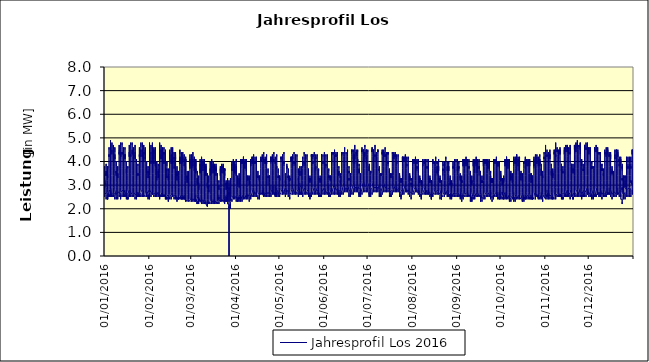
| Category | Jahresprofil Los 2016 |
|---|---|
| 01/01/2016 | 2.9 |
| 01/01/2016 | 2.8 |
| 01/01/2016 | 2.7 |
| 01/01/2016 | 2.5 |
| 01/01/2016 | 2.5 |
| 01/01/2016 | 2.6 |
| 01/01/2016 | 2.7 |
| 01/01/2016 | 2.8 |
| 01/01/2016 | 2.8 |
| 01/01/2016 | 3 |
| 01/01/2016 | 2.9 |
| 01/01/2016 | 3.2 |
| 01/01/2016 | 3.2 |
| 01/01/2016 | 3 |
| 01/01/2016 | 3.1 |
| 01/01/2016 | 3 |
| 01/01/2016 | 3.3 |
| 01/01/2016 | 3.8 |
| 01/01/2016 | 3.7 |
| 01/01/2016 | 3.6 |
| 01/01/2016 | 3.5 |
| 01/01/2016 | 3.3 |
| 01/01/2016 | 3.2 |
| 01/01/2016 | 3.1 |
| 02/01/2016 | 2.7 |
| 02/01/2016 | 2.6 |
| 02/01/2016 | 2.5 |
| 02/01/2016 | 2.5 |
| 02/01/2016 | 2.4 |
| 02/01/2016 | 2.5 |
| 02/01/2016 | 2.6 |
| 02/01/2016 | 2.8 |
| 02/01/2016 | 2.9 |
| 02/01/2016 | 3.3 |
| 02/01/2016 | 3.4 |
| 02/01/2016 | 3.6 |
| 02/01/2016 | 3.4 |
| 02/01/2016 | 3.5 |
| 02/01/2016 | 3.5 |
| 02/01/2016 | 3.4 |
| 02/01/2016 | 3.6 |
| 02/01/2016 | 3.9 |
| 02/01/2016 | 3.9 |
| 02/01/2016 | 3.8 |
| 02/01/2016 | 3.5 |
| 02/01/2016 | 3.2 |
| 02/01/2016 | 3.1 |
| 02/01/2016 | 2.9 |
| 03/01/2016 | 2.7 |
| 03/01/2016 | 2.6 |
| 03/01/2016 | 2.4 |
| 03/01/2016 | 2.5 |
| 03/01/2016 | 2.4 |
| 03/01/2016 | 2.4 |
| 03/01/2016 | 2.5 |
| 03/01/2016 | 2.7 |
| 03/01/2016 | 2.8 |
| 03/01/2016 | 3.1 |
| 03/01/2016 | 3.2 |
| 03/01/2016 | 3.4 |
| 03/01/2016 | 3.4 |
| 03/01/2016 | 3.4 |
| 03/01/2016 | 3.3 |
| 03/01/2016 | 3.5 |
| 03/01/2016 | 3.7 |
| 03/01/2016 | 3.8 |
| 03/01/2016 | 3.7 |
| 03/01/2016 | 3.8 |
| 03/01/2016 | 3.4 |
| 03/01/2016 | 3.3 |
| 03/01/2016 | 3.2 |
| 03/01/2016 | 2.8 |
| 04/01/2016 | 2.8 |
| 04/01/2016 | 2.5 |
| 04/01/2016 | 2.5 |
| 04/01/2016 | 2.6 |
| 04/01/2016 | 2.5 |
| 04/01/2016 | 2.8 |
| 04/01/2016 | 3.3 |
| 04/01/2016 | 3.7 |
| 04/01/2016 | 4 |
| 04/01/2016 | 4.1 |
| 04/01/2016 | 4.2 |
| 04/01/2016 | 4.3 |
| 04/01/2016 | 4.2 |
| 04/01/2016 | 4.3 |
| 04/01/2016 | 4.3 |
| 04/01/2016 | 4.3 |
| 04/01/2016 | 4.6 |
| 04/01/2016 | 4.6 |
| 04/01/2016 | 4.6 |
| 04/01/2016 | 4.5 |
| 04/01/2016 | 4 |
| 04/01/2016 | 3.5 |
| 04/01/2016 | 3.3 |
| 04/01/2016 | 3 |
| 05/01/2016 | 2.8 |
| 05/01/2016 | 2.7 |
| 05/01/2016 | 2.5 |
| 05/01/2016 | 2.5 |
| 05/01/2016 | 2.6 |
| 05/01/2016 | 2.8 |
| 05/01/2016 | 3.3 |
| 05/01/2016 | 3.7 |
| 05/01/2016 | 4 |
| 05/01/2016 | 4.1 |
| 05/01/2016 | 4.2 |
| 05/01/2016 | 4.2 |
| 05/01/2016 | 4.3 |
| 05/01/2016 | 4.2 |
| 05/01/2016 | 4.2 |
| 05/01/2016 | 4.4 |
| 05/01/2016 | 4.8 |
| 05/01/2016 | 4.9 |
| 05/01/2016 | 4.8 |
| 05/01/2016 | 4.5 |
| 05/01/2016 | 4 |
| 05/01/2016 | 3.6 |
| 05/01/2016 | 3.4 |
| 05/01/2016 | 3.1 |
| 06/01/2016 | 2.9 |
| 06/01/2016 | 2.5 |
| 06/01/2016 | 2.6 |
| 06/01/2016 | 2.5 |
| 06/01/2016 | 2.6 |
| 06/01/2016 | 2.9 |
| 06/01/2016 | 3.4 |
| 06/01/2016 | 3.8 |
| 06/01/2016 | 4.1 |
| 06/01/2016 | 4.3 |
| 06/01/2016 | 4.3 |
| 06/01/2016 | 4.4 |
| 06/01/2016 | 4.5 |
| 06/01/2016 | 4.4 |
| 06/01/2016 | 4.3 |
| 06/01/2016 | 4.5 |
| 06/01/2016 | 4.7 |
| 06/01/2016 | 4.8 |
| 06/01/2016 | 4.8 |
| 06/01/2016 | 4.5 |
| 06/01/2016 | 4 |
| 06/01/2016 | 3.6 |
| 06/01/2016 | 3.4 |
| 06/01/2016 | 3.1 |
| 07/01/2016 | 2.7 |
| 07/01/2016 | 2.6 |
| 07/01/2016 | 2.6 |
| 07/01/2016 | 2.5 |
| 07/01/2016 | 2.6 |
| 07/01/2016 | 2.9 |
| 07/01/2016 | 3.4 |
| 07/01/2016 | 3.8 |
| 07/01/2016 | 4.1 |
| 07/01/2016 | 4 |
| 07/01/2016 | 4.3 |
| 07/01/2016 | 4.3 |
| 07/01/2016 | 4.2 |
| 07/01/2016 | 4.2 |
| 07/01/2016 | 4.2 |
| 07/01/2016 | 4.1 |
| 07/01/2016 | 4.5 |
| 07/01/2016 | 4.7 |
| 07/01/2016 | 4.5 |
| 07/01/2016 | 4.4 |
| 07/01/2016 | 3.9 |
| 07/01/2016 | 3.6 |
| 07/01/2016 | 3.4 |
| 07/01/2016 | 2.9 |
| 08/01/2016 | 2.7 |
| 08/01/2016 | 2.6 |
| 08/01/2016 | 2.4 |
| 08/01/2016 | 2.5 |
| 08/01/2016 | 2.6 |
| 08/01/2016 | 2.8 |
| 08/01/2016 | 3.3 |
| 08/01/2016 | 3.7 |
| 08/01/2016 | 4 |
| 08/01/2016 | 4 |
| 08/01/2016 | 4.3 |
| 08/01/2016 | 4.3 |
| 08/01/2016 | 4.3 |
| 08/01/2016 | 4.3 |
| 08/01/2016 | 4.1 |
| 08/01/2016 | 4.2 |
| 08/01/2016 | 4.3 |
| 08/01/2016 | 4.6 |
| 08/01/2016 | 4.6 |
| 08/01/2016 | 4.4 |
| 08/01/2016 | 3.9 |
| 08/01/2016 | 3.5 |
| 08/01/2016 | 3.3 |
| 08/01/2016 | 3 |
| 09/01/2016 | 2.8 |
| 09/01/2016 | 2.5 |
| 09/01/2016 | 2.4 |
| 09/01/2016 | 2.4 |
| 09/01/2016 | 2.5 |
| 09/01/2016 | 2.5 |
| 09/01/2016 | 2.7 |
| 09/01/2016 | 2.8 |
| 09/01/2016 | 3.1 |
| 09/01/2016 | 3.4 |
| 09/01/2016 | 3.6 |
| 09/01/2016 | 3.5 |
| 09/01/2016 | 3.5 |
| 09/01/2016 | 3.6 |
| 09/01/2016 | 3.4 |
| 09/01/2016 | 3.6 |
| 09/01/2016 | 3.8 |
| 09/01/2016 | 4 |
| 09/01/2016 | 4 |
| 09/01/2016 | 3.8 |
| 09/01/2016 | 3.5 |
| 09/01/2016 | 3.3 |
| 09/01/2016 | 3.1 |
| 09/01/2016 | 2.9 |
| 10/01/2016 | 2.6 |
| 10/01/2016 | 2.7 |
| 10/01/2016 | 2.5 |
| 10/01/2016 | 2.4 |
| 10/01/2016 | 2.5 |
| 10/01/2016 | 2.5 |
| 10/01/2016 | 2.6 |
| 10/01/2016 | 2.6 |
| 10/01/2016 | 2.8 |
| 10/01/2016 | 3 |
| 10/01/2016 | 3.3 |
| 10/01/2016 | 3.5 |
| 10/01/2016 | 3.5 |
| 10/01/2016 | 3.5 |
| 10/01/2016 | 3.3 |
| 10/01/2016 | 3.5 |
| 10/01/2016 | 3.7 |
| 10/01/2016 | 3.8 |
| 10/01/2016 | 3.8 |
| 10/01/2016 | 3.6 |
| 10/01/2016 | 3.5 |
| 10/01/2016 | 3.2 |
| 10/01/2016 | 3.2 |
| 10/01/2016 | 2.9 |
| 11/01/2016 | 2.7 |
| 11/01/2016 | 2.7 |
| 11/01/2016 | 2.6 |
| 11/01/2016 | 2.5 |
| 11/01/2016 | 2.6 |
| 11/01/2016 | 2.9 |
| 11/01/2016 | 3.3 |
| 11/01/2016 | 3.9 |
| 11/01/2016 | 4 |
| 11/01/2016 | 4.1 |
| 11/01/2016 | 4.2 |
| 11/01/2016 | 4.2 |
| 11/01/2016 | 4.3 |
| 11/01/2016 | 4.4 |
| 11/01/2016 | 4.3 |
| 11/01/2016 | 4.3 |
| 11/01/2016 | 4.5 |
| 11/01/2016 | 4.6 |
| 11/01/2016 | 4.7 |
| 11/01/2016 | 4.4 |
| 11/01/2016 | 3.9 |
| 11/01/2016 | 3.6 |
| 11/01/2016 | 3.4 |
| 11/01/2016 | 3.1 |
| 12/01/2016 | 2.7 |
| 12/01/2016 | 2.6 |
| 12/01/2016 | 2.4 |
| 12/01/2016 | 2.6 |
| 12/01/2016 | 2.7 |
| 12/01/2016 | 2.9 |
| 12/01/2016 | 3.3 |
| 12/01/2016 | 3.9 |
| 12/01/2016 | 4 |
| 12/01/2016 | 4.1 |
| 12/01/2016 | 4.3 |
| 12/01/2016 | 4.4 |
| 12/01/2016 | 4.2 |
| 12/01/2016 | 4.3 |
| 12/01/2016 | 4.2 |
| 12/01/2016 | 4.3 |
| 12/01/2016 | 4.5 |
| 12/01/2016 | 4.8 |
| 12/01/2016 | 4.7 |
| 12/01/2016 | 4.6 |
| 12/01/2016 | 4.1 |
| 12/01/2016 | 3.7 |
| 12/01/2016 | 3.2 |
| 12/01/2016 | 2.9 |
| 13/01/2016 | 2.8 |
| 13/01/2016 | 2.7 |
| 13/01/2016 | 2.5 |
| 13/01/2016 | 2.6 |
| 13/01/2016 | 2.7 |
| 13/01/2016 | 2.8 |
| 13/01/2016 | 3.4 |
| 13/01/2016 | 3.8 |
| 13/01/2016 | 4.1 |
| 13/01/2016 | 4.3 |
| 13/01/2016 | 4.3 |
| 13/01/2016 | 4.3 |
| 13/01/2016 | 4.4 |
| 13/01/2016 | 4.4 |
| 13/01/2016 | 4.3 |
| 13/01/2016 | 4.4 |
| 13/01/2016 | 4.5 |
| 13/01/2016 | 4.8 |
| 13/01/2016 | 4.7 |
| 13/01/2016 | 4.6 |
| 13/01/2016 | 4.1 |
| 13/01/2016 | 3.7 |
| 13/01/2016 | 3.3 |
| 13/01/2016 | 3 |
| 14/01/2016 | 2.8 |
| 14/01/2016 | 2.7 |
| 14/01/2016 | 2.5 |
| 14/01/2016 | 2.6 |
| 14/01/2016 | 2.7 |
| 14/01/2016 | 2.8 |
| 14/01/2016 | 3.4 |
| 14/01/2016 | 3.8 |
| 14/01/2016 | 4.1 |
| 14/01/2016 | 4.2 |
| 14/01/2016 | 4.2 |
| 14/01/2016 | 4.3 |
| 14/01/2016 | 4.3 |
| 14/01/2016 | 4.3 |
| 14/01/2016 | 4.2 |
| 14/01/2016 | 4.1 |
| 14/01/2016 | 4.3 |
| 14/01/2016 | 4.6 |
| 14/01/2016 | 4.6 |
| 14/01/2016 | 4.5 |
| 14/01/2016 | 4 |
| 14/01/2016 | 3.5 |
| 14/01/2016 | 3.3 |
| 14/01/2016 | 3 |
| 15/01/2016 | 2.8 |
| 15/01/2016 | 2.7 |
| 15/01/2016 | 2.5 |
| 15/01/2016 | 2.6 |
| 15/01/2016 | 2.5 |
| 15/01/2016 | 2.8 |
| 15/01/2016 | 3.3 |
| 15/01/2016 | 3.7 |
| 15/01/2016 | 4.1 |
| 15/01/2016 | 4.3 |
| 15/01/2016 | 4.3 |
| 15/01/2016 | 4.3 |
| 15/01/2016 | 4.2 |
| 15/01/2016 | 4.3 |
| 15/01/2016 | 4.1 |
| 15/01/2016 | 4.2 |
| 15/01/2016 | 4.3 |
| 15/01/2016 | 4.6 |
| 15/01/2016 | 4.5 |
| 15/01/2016 | 4.3 |
| 15/01/2016 | 3.8 |
| 15/01/2016 | 3.6 |
| 15/01/2016 | 3.3 |
| 15/01/2016 | 2.9 |
| 16/01/2016 | 2.7 |
| 16/01/2016 | 2.6 |
| 16/01/2016 | 2.5 |
| 16/01/2016 | 2.5 |
| 16/01/2016 | 2.4 |
| 16/01/2016 | 2.7 |
| 16/01/2016 | 2.8 |
| 16/01/2016 | 3 |
| 16/01/2016 | 3.3 |
| 16/01/2016 | 3.3 |
| 16/01/2016 | 3.5 |
| 16/01/2016 | 3.7 |
| 16/01/2016 | 3.6 |
| 16/01/2016 | 3.5 |
| 16/01/2016 | 3.5 |
| 16/01/2016 | 3.5 |
| 16/01/2016 | 3.6 |
| 16/01/2016 | 3.9 |
| 16/01/2016 | 4 |
| 16/01/2016 | 3.9 |
| 16/01/2016 | 3.6 |
| 16/01/2016 | 3.4 |
| 16/01/2016 | 3.2 |
| 16/01/2016 | 3 |
| 17/01/2016 | 2.7 |
| 17/01/2016 | 2.6 |
| 17/01/2016 | 2.4 |
| 17/01/2016 | 2.5 |
| 17/01/2016 | 2.4 |
| 17/01/2016 | 2.4 |
| 17/01/2016 | 2.5 |
| 17/01/2016 | 2.8 |
| 17/01/2016 | 2.9 |
| 17/01/2016 | 3.2 |
| 17/01/2016 | 3.2 |
| 17/01/2016 | 3.4 |
| 17/01/2016 | 3.4 |
| 17/01/2016 | 3.4 |
| 17/01/2016 | 3.4 |
| 17/01/2016 | 3.4 |
| 17/01/2016 | 3.5 |
| 17/01/2016 | 3.8 |
| 17/01/2016 | 3.8 |
| 17/01/2016 | 3.7 |
| 17/01/2016 | 3.5 |
| 17/01/2016 | 3.3 |
| 17/01/2016 | 3.1 |
| 17/01/2016 | 3 |
| 18/01/2016 | 2.8 |
| 18/01/2016 | 2.6 |
| 18/01/2016 | 2.5 |
| 18/01/2016 | 2.6 |
| 18/01/2016 | 2.5 |
| 18/01/2016 | 2.8 |
| 18/01/2016 | 3.3 |
| 18/01/2016 | 3.9 |
| 18/01/2016 | 4.2 |
| 18/01/2016 | 4.3 |
| 18/01/2016 | 4.3 |
| 18/01/2016 | 4.3 |
| 18/01/2016 | 4.4 |
| 18/01/2016 | 4.2 |
| 18/01/2016 | 4.2 |
| 18/01/2016 | 4.2 |
| 18/01/2016 | 4.5 |
| 18/01/2016 | 4.6 |
| 18/01/2016 | 4.7 |
| 18/01/2016 | 4.5 |
| 18/01/2016 | 4 |
| 18/01/2016 | 3.7 |
| 18/01/2016 | 3.3 |
| 18/01/2016 | 3 |
| 19/01/2016 | 2.8 |
| 19/01/2016 | 2.7 |
| 19/01/2016 | 2.5 |
| 19/01/2016 | 2.5 |
| 19/01/2016 | 2.6 |
| 19/01/2016 | 2.9 |
| 19/01/2016 | 3.5 |
| 19/01/2016 | 3.9 |
| 19/01/2016 | 4.2 |
| 19/01/2016 | 4.3 |
| 19/01/2016 | 4.3 |
| 19/01/2016 | 4.3 |
| 19/01/2016 | 4.3 |
| 19/01/2016 | 4.3 |
| 19/01/2016 | 4.2 |
| 19/01/2016 | 4.3 |
| 19/01/2016 | 4.5 |
| 19/01/2016 | 4.8 |
| 19/01/2016 | 4.7 |
| 19/01/2016 | 4.7 |
| 19/01/2016 | 4.2 |
| 19/01/2016 | 3.6 |
| 19/01/2016 | 3.3 |
| 19/01/2016 | 3 |
| 20/01/2016 | 2.7 |
| 20/01/2016 | 2.6 |
| 20/01/2016 | 2.6 |
| 20/01/2016 | 2.5 |
| 20/01/2016 | 2.6 |
| 20/01/2016 | 2.9 |
| 20/01/2016 | 3.4 |
| 20/01/2016 | 4.1 |
| 20/01/2016 | 4.3 |
| 20/01/2016 | 4.3 |
| 20/01/2016 | 4.5 |
| 20/01/2016 | 4.5 |
| 20/01/2016 | 4.5 |
| 20/01/2016 | 4.3 |
| 20/01/2016 | 4.4 |
| 20/01/2016 | 4.4 |
| 20/01/2016 | 4.4 |
| 20/01/2016 | 4.8 |
| 20/01/2016 | 4.7 |
| 20/01/2016 | 4.5 |
| 20/01/2016 | 4.2 |
| 20/01/2016 | 3.6 |
| 20/01/2016 | 3.4 |
| 20/01/2016 | 3.1 |
| 21/01/2016 | 2.7 |
| 21/01/2016 | 2.6 |
| 21/01/2016 | 2.6 |
| 21/01/2016 | 2.5 |
| 21/01/2016 | 2.6 |
| 21/01/2016 | 2.9 |
| 21/01/2016 | 3.4 |
| 21/01/2016 | 4 |
| 21/01/2016 | 4.1 |
| 21/01/2016 | 4.2 |
| 21/01/2016 | 4.4 |
| 21/01/2016 | 4.4 |
| 21/01/2016 | 4.4 |
| 21/01/2016 | 4.2 |
| 21/01/2016 | 4.1 |
| 21/01/2016 | 4.1 |
| 21/01/2016 | 4.3 |
| 21/01/2016 | 4.6 |
| 21/01/2016 | 4.6 |
| 21/01/2016 | 4.4 |
| 21/01/2016 | 3.9 |
| 21/01/2016 | 3.6 |
| 21/01/2016 | 3.4 |
| 21/01/2016 | 2.9 |
| 22/01/2016 | 2.7 |
| 22/01/2016 | 2.6 |
| 22/01/2016 | 2.4 |
| 22/01/2016 | 2.5 |
| 22/01/2016 | 2.6 |
| 22/01/2016 | 2.9 |
| 22/01/2016 | 3.3 |
| 22/01/2016 | 3.9 |
| 22/01/2016 | 4.1 |
| 22/01/2016 | 4.3 |
| 22/01/2016 | 4.4 |
| 22/01/2016 | 4.4 |
| 22/01/2016 | 4.3 |
| 22/01/2016 | 4.2 |
| 22/01/2016 | 4.2 |
| 22/01/2016 | 4.1 |
| 22/01/2016 | 4.3 |
| 22/01/2016 | 4.6 |
| 22/01/2016 | 4.7 |
| 22/01/2016 | 4.4 |
| 22/01/2016 | 3.9 |
| 22/01/2016 | 3.5 |
| 22/01/2016 | 3.2 |
| 22/01/2016 | 3 |
| 23/01/2016 | 2.6 |
| 23/01/2016 | 2.6 |
| 23/01/2016 | 2.6 |
| 23/01/2016 | 2.4 |
| 23/01/2016 | 2.6 |
| 23/01/2016 | 2.6 |
| 23/01/2016 | 2.8 |
| 23/01/2016 | 2.9 |
| 23/01/2016 | 3.2 |
| 23/01/2016 | 3.5 |
| 23/01/2016 | 3.7 |
| 23/01/2016 | 3.8 |
| 23/01/2016 | 3.7 |
| 23/01/2016 | 3.5 |
| 23/01/2016 | 3.5 |
| 23/01/2016 | 3.5 |
| 23/01/2016 | 3.6 |
| 23/01/2016 | 3.9 |
| 23/01/2016 | 4.1 |
| 23/01/2016 | 4 |
| 23/01/2016 | 3.7 |
| 23/01/2016 | 3.3 |
| 23/01/2016 | 3.1 |
| 23/01/2016 | 2.8 |
| 24/01/2016 | 2.6 |
| 24/01/2016 | 2.7 |
| 24/01/2016 | 2.5 |
| 24/01/2016 | 2.6 |
| 24/01/2016 | 2.5 |
| 24/01/2016 | 2.5 |
| 24/01/2016 | 2.7 |
| 24/01/2016 | 2.7 |
| 24/01/2016 | 3.1 |
| 24/01/2016 | 3.1 |
| 24/01/2016 | 3.4 |
| 24/01/2016 | 3.5 |
| 24/01/2016 | 3.5 |
| 24/01/2016 | 3.4 |
| 24/01/2016 | 3.4 |
| 24/01/2016 | 3.4 |
| 24/01/2016 | 3.5 |
| 24/01/2016 | 3.8 |
| 24/01/2016 | 3.9 |
| 24/01/2016 | 3.8 |
| 24/01/2016 | 3.4 |
| 24/01/2016 | 3.3 |
| 24/01/2016 | 3.2 |
| 24/01/2016 | 2.9 |
| 25/01/2016 | 2.7 |
| 25/01/2016 | 2.5 |
| 25/01/2016 | 2.6 |
| 25/01/2016 | 2.5 |
| 25/01/2016 | 2.6 |
| 25/01/2016 | 2.9 |
| 25/01/2016 | 3.5 |
| 25/01/2016 | 3.9 |
| 25/01/2016 | 4.2 |
| 25/01/2016 | 4.3 |
| 25/01/2016 | 4.3 |
| 25/01/2016 | 4.3 |
| 25/01/2016 | 4.3 |
| 25/01/2016 | 4.3 |
| 25/01/2016 | 4.2 |
| 25/01/2016 | 4.2 |
| 25/01/2016 | 4.3 |
| 25/01/2016 | 4.5 |
| 25/01/2016 | 4.6 |
| 25/01/2016 | 4.6 |
| 25/01/2016 | 4.1 |
| 25/01/2016 | 3.6 |
| 25/01/2016 | 3.3 |
| 25/01/2016 | 3 |
| 26/01/2016 | 2.7 |
| 26/01/2016 | 2.6 |
| 26/01/2016 | 2.5 |
| 26/01/2016 | 2.6 |
| 26/01/2016 | 2.7 |
| 26/01/2016 | 3 |
| 26/01/2016 | 3.5 |
| 26/01/2016 | 3.9 |
| 26/01/2016 | 4.2 |
| 26/01/2016 | 4.3 |
| 26/01/2016 | 4.5 |
| 26/01/2016 | 4.5 |
| 26/01/2016 | 4.4 |
| 26/01/2016 | 4.2 |
| 26/01/2016 | 4.3 |
| 26/01/2016 | 4.3 |
| 26/01/2016 | 4.4 |
| 26/01/2016 | 4.8 |
| 26/01/2016 | 4.8 |
| 26/01/2016 | 4.6 |
| 26/01/2016 | 4.1 |
| 26/01/2016 | 3.7 |
| 26/01/2016 | 3.4 |
| 26/01/2016 | 2.9 |
| 27/01/2016 | 2.8 |
| 27/01/2016 | 2.7 |
| 27/01/2016 | 2.5 |
| 27/01/2016 | 2.6 |
| 27/01/2016 | 2.7 |
| 27/01/2016 | 2.9 |
| 27/01/2016 | 3.6 |
| 27/01/2016 | 4.1 |
| 27/01/2016 | 4.4 |
| 27/01/2016 | 4.5 |
| 27/01/2016 | 4.4 |
| 27/01/2016 | 4.4 |
| 27/01/2016 | 4.4 |
| 27/01/2016 | 4.4 |
| 27/01/2016 | 4.2 |
| 27/01/2016 | 4.4 |
| 27/01/2016 | 4.4 |
| 27/01/2016 | 4.7 |
| 27/01/2016 | 4.8 |
| 27/01/2016 | 4.6 |
| 27/01/2016 | 4.1 |
| 27/01/2016 | 3.7 |
| 27/01/2016 | 3.3 |
| 27/01/2016 | 3 |
| 28/01/2016 | 2.8 |
| 28/01/2016 | 2.7 |
| 28/01/2016 | 2.5 |
| 28/01/2016 | 2.6 |
| 28/01/2016 | 2.7 |
| 28/01/2016 | 2.9 |
| 28/01/2016 | 3.6 |
| 28/01/2016 | 4 |
| 28/01/2016 | 4.3 |
| 28/01/2016 | 4.4 |
| 28/01/2016 | 4.4 |
| 28/01/2016 | 4.3 |
| 28/01/2016 | 4.3 |
| 28/01/2016 | 4.2 |
| 28/01/2016 | 4.1 |
| 28/01/2016 | 4 |
| 28/01/2016 | 4.2 |
| 28/01/2016 | 4.6 |
| 28/01/2016 | 4.7 |
| 28/01/2016 | 4.5 |
| 28/01/2016 | 4 |
| 28/01/2016 | 3.7 |
| 28/01/2016 | 3.2 |
| 28/01/2016 | 3 |
| 29/01/2016 | 2.6 |
| 29/01/2016 | 2.5 |
| 29/01/2016 | 2.5 |
| 29/01/2016 | 2.6 |
| 29/01/2016 | 2.7 |
| 29/01/2016 | 2.8 |
| 29/01/2016 | 3.5 |
| 29/01/2016 | 3.9 |
| 29/01/2016 | 4.3 |
| 29/01/2016 | 4.5 |
| 29/01/2016 | 4.4 |
| 29/01/2016 | 4.3 |
| 29/01/2016 | 4.4 |
| 29/01/2016 | 4.3 |
| 29/01/2016 | 4.2 |
| 29/01/2016 | 4.1 |
| 29/01/2016 | 4.2 |
| 29/01/2016 | 4.5 |
| 29/01/2016 | 4.6 |
| 29/01/2016 | 4.3 |
| 29/01/2016 | 3.8 |
| 29/01/2016 | 3.6 |
| 29/01/2016 | 3.3 |
| 29/01/2016 | 3.1 |
| 30/01/2016 | 2.7 |
| 30/01/2016 | 2.7 |
| 30/01/2016 | 2.5 |
| 30/01/2016 | 2.5 |
| 30/01/2016 | 2.5 |
| 30/01/2016 | 2.7 |
| 30/01/2016 | 2.7 |
| 30/01/2016 | 3.1 |
| 30/01/2016 | 3.4 |
| 30/01/2016 | 3.5 |
| 30/01/2016 | 3.8 |
| 30/01/2016 | 3.7 |
| 30/01/2016 | 3.6 |
| 30/01/2016 | 3.6 |
| 30/01/2016 | 3.5 |
| 30/01/2016 | 3.5 |
| 30/01/2016 | 3.6 |
| 30/01/2016 | 3.9 |
| 30/01/2016 | 4 |
| 30/01/2016 | 3.9 |
| 30/01/2016 | 3.6 |
| 30/01/2016 | 3.3 |
| 30/01/2016 | 3.2 |
| 30/01/2016 | 2.9 |
| 31/01/2016 | 2.8 |
| 31/01/2016 | 2.6 |
| 31/01/2016 | 2.4 |
| 31/01/2016 | 2.5 |
| 31/01/2016 | 2.6 |
| 31/01/2016 | 2.5 |
| 31/01/2016 | 2.6 |
| 31/01/2016 | 2.8 |
| 31/01/2016 | 3 |
| 31/01/2016 | 3.3 |
| 31/01/2016 | 3.5 |
| 31/01/2016 | 3.6 |
| 31/01/2016 | 3.6 |
| 31/01/2016 | 3.5 |
| 31/01/2016 | 3.4 |
| 31/01/2016 | 3.4 |
| 31/01/2016 | 3.3 |
| 31/01/2016 | 3.7 |
| 31/01/2016 | 3.8 |
| 31/01/2016 | 3.7 |
| 31/01/2016 | 3.5 |
| 31/01/2016 | 3.2 |
| 31/01/2016 | 3.1 |
| 31/01/2016 | 3 |
| 01/02/2016 | 2.8 |
| 01/02/2016 | 2.6 |
| 01/02/2016 | 2.4 |
| 01/02/2016 | 2.5 |
| 01/02/2016 | 2.7 |
| 01/02/2016 | 2.9 |
| 01/02/2016 | 3.4 |
| 01/02/2016 | 3.9 |
| 01/02/2016 | 4.3 |
| 01/02/2016 | 4.4 |
| 01/02/2016 | 4.4 |
| 01/02/2016 | 4.4 |
| 01/02/2016 | 4.3 |
| 01/02/2016 | 4 |
| 01/02/2016 | 4.1 |
| 01/02/2016 | 3.9 |
| 01/02/2016 | 4 |
| 01/02/2016 | 4.5 |
| 01/02/2016 | 4.8 |
| 01/02/2016 | 4.3 |
| 01/02/2016 | 3.8 |
| 01/02/2016 | 3.4 |
| 01/02/2016 | 3.3 |
| 01/02/2016 | 2.9 |
| 02/02/2016 | 2.8 |
| 02/02/2016 | 2.7 |
| 02/02/2016 | 2.5 |
| 02/02/2016 | 2.6 |
| 02/02/2016 | 2.7 |
| 02/02/2016 | 3 |
| 02/02/2016 | 3.4 |
| 02/02/2016 | 3.9 |
| 02/02/2016 | 4.3 |
| 02/02/2016 | 4.4 |
| 02/02/2016 | 4.4 |
| 02/02/2016 | 4.4 |
| 02/02/2016 | 4.3 |
| 02/02/2016 | 4.1 |
| 02/02/2016 | 3.9 |
| 02/02/2016 | 4 |
| 02/02/2016 | 4.2 |
| 02/02/2016 | 4.5 |
| 02/02/2016 | 4.7 |
| 02/02/2016 | 4.4 |
| 02/02/2016 | 3.9 |
| 02/02/2016 | 3.5 |
| 02/02/2016 | 3.4 |
| 02/02/2016 | 3 |
| 03/02/2016 | 2.7 |
| 03/02/2016 | 2.6 |
| 03/02/2016 | 2.6 |
| 03/02/2016 | 2.7 |
| 03/02/2016 | 2.6 |
| 03/02/2016 | 2.8 |
| 03/02/2016 | 3.5 |
| 03/02/2016 | 4 |
| 03/02/2016 | 4.2 |
| 03/02/2016 | 4.6 |
| 03/02/2016 | 4.6 |
| 03/02/2016 | 4.5 |
| 03/02/2016 | 4.4 |
| 03/02/2016 | 4.3 |
| 03/02/2016 | 4.1 |
| 03/02/2016 | 4.1 |
| 03/02/2016 | 4.2 |
| 03/02/2016 | 4.5 |
| 03/02/2016 | 4.8 |
| 03/02/2016 | 4.5 |
| 03/02/2016 | 3.9 |
| 03/02/2016 | 3.5 |
| 03/02/2016 | 3.2 |
| 03/02/2016 | 3 |
| 04/02/2016 | 2.7 |
| 04/02/2016 | 2.6 |
| 04/02/2016 | 2.6 |
| 04/02/2016 | 2.5 |
| 04/02/2016 | 2.6 |
| 04/02/2016 | 2.8 |
| 04/02/2016 | 3.5 |
| 04/02/2016 | 4 |
| 04/02/2016 | 4.2 |
| 04/02/2016 | 4.5 |
| 04/02/2016 | 4.5 |
| 04/02/2016 | 4.5 |
| 04/02/2016 | 4.3 |
| 04/02/2016 | 4 |
| 04/02/2016 | 3.9 |
| 04/02/2016 | 4 |
| 04/02/2016 | 4 |
| 04/02/2016 | 4.3 |
| 04/02/2016 | 4.6 |
| 04/02/2016 | 4.1 |
| 04/02/2016 | 3.9 |
| 04/02/2016 | 3.5 |
| 04/02/2016 | 3.2 |
| 04/02/2016 | 3 |
| 05/02/2016 | 2.7 |
| 05/02/2016 | 2.6 |
| 05/02/2016 | 2.6 |
| 05/02/2016 | 2.5 |
| 05/02/2016 | 2.6 |
| 05/02/2016 | 2.8 |
| 05/02/2016 | 3.4 |
| 05/02/2016 | 3.9 |
| 05/02/2016 | 4.2 |
| 05/02/2016 | 4.5 |
| 05/02/2016 | 4.5 |
| 05/02/2016 | 4.5 |
| 05/02/2016 | 4.3 |
| 05/02/2016 | 4 |
| 05/02/2016 | 3.9 |
| 05/02/2016 | 3.8 |
| 05/02/2016 | 4 |
| 05/02/2016 | 4.3 |
| 05/02/2016 | 4.6 |
| 05/02/2016 | 4.1 |
| 05/02/2016 | 3.7 |
| 05/02/2016 | 3.4 |
| 05/02/2016 | 3.3 |
| 05/02/2016 | 2.9 |
| 06/02/2016 | 2.6 |
| 06/02/2016 | 2.6 |
| 06/02/2016 | 2.6 |
| 06/02/2016 | 2.6 |
| 06/02/2016 | 2.5 |
| 06/02/2016 | 2.7 |
| 06/02/2016 | 2.7 |
| 06/02/2016 | 3 |
| 06/02/2016 | 3.3 |
| 06/02/2016 | 3.6 |
| 06/02/2016 | 3.7 |
| 06/02/2016 | 3.8 |
| 06/02/2016 | 3.7 |
| 06/02/2016 | 3.4 |
| 06/02/2016 | 3.2 |
| 06/02/2016 | 3.3 |
| 06/02/2016 | 3.4 |
| 06/02/2016 | 3.7 |
| 06/02/2016 | 4 |
| 06/02/2016 | 3.8 |
| 06/02/2016 | 3.5 |
| 06/02/2016 | 3.2 |
| 06/02/2016 | 3.1 |
| 06/02/2016 | 2.7 |
| 07/02/2016 | 2.6 |
| 07/02/2016 | 2.7 |
| 07/02/2016 | 2.5 |
| 07/02/2016 | 2.5 |
| 07/02/2016 | 2.5 |
| 07/02/2016 | 2.6 |
| 07/02/2016 | 2.7 |
| 07/02/2016 | 3 |
| 07/02/2016 | 3.1 |
| 07/02/2016 | 3.4 |
| 07/02/2016 | 3.4 |
| 07/02/2016 | 3.5 |
| 07/02/2016 | 3.6 |
| 07/02/2016 | 3.5 |
| 07/02/2016 | 3.4 |
| 07/02/2016 | 3.3 |
| 07/02/2016 | 3.3 |
| 07/02/2016 | 3.7 |
| 07/02/2016 | 3.9 |
| 07/02/2016 | 3.8 |
| 07/02/2016 | 3.6 |
| 07/02/2016 | 3.3 |
| 07/02/2016 | 3.2 |
| 07/02/2016 | 2.8 |
| 08/02/2016 | 2.6 |
| 08/02/2016 | 2.6 |
| 08/02/2016 | 2.5 |
| 08/02/2016 | 2.4 |
| 08/02/2016 | 2.6 |
| 08/02/2016 | 3 |
| 08/02/2016 | 3.6 |
| 08/02/2016 | 4 |
| 08/02/2016 | 4.3 |
| 08/02/2016 | 4.4 |
| 08/02/2016 | 4.5 |
| 08/02/2016 | 4.5 |
| 08/02/2016 | 4.4 |
| 08/02/2016 | 4.2 |
| 08/02/2016 | 4.2 |
| 08/02/2016 | 4.3 |
| 08/02/2016 | 4.1 |
| 08/02/2016 | 4.5 |
| 08/02/2016 | 4.8 |
| 08/02/2016 | 4.5 |
| 08/02/2016 | 4 |
| 08/02/2016 | 3.5 |
| 08/02/2016 | 3.2 |
| 08/02/2016 | 3 |
| 09/02/2016 | 2.6 |
| 09/02/2016 | 2.5 |
| 09/02/2016 | 2.6 |
| 09/02/2016 | 2.5 |
| 09/02/2016 | 2.6 |
| 09/02/2016 | 3 |
| 09/02/2016 | 3.5 |
| 09/02/2016 | 4.2 |
| 09/02/2016 | 4.5 |
| 09/02/2016 | 4.4 |
| 09/02/2016 | 4.4 |
| 09/02/2016 | 4.4 |
| 09/02/2016 | 4.3 |
| 09/02/2016 | 4.2 |
| 09/02/2016 | 4.2 |
| 09/02/2016 | 4.1 |
| 09/02/2016 | 4.3 |
| 09/02/2016 | 4.7 |
| 09/02/2016 | 4.7 |
| 09/02/2016 | 4.7 |
| 09/02/2016 | 4.1 |
| 09/02/2016 | 3.6 |
| 09/02/2016 | 3.3 |
| 09/02/2016 | 3 |
| 10/02/2016 | 2.7 |
| 10/02/2016 | 2.5 |
| 10/02/2016 | 2.6 |
| 10/02/2016 | 2.5 |
| 10/02/2016 | 2.6 |
| 10/02/2016 | 3 |
| 10/02/2016 | 3.6 |
| 10/02/2016 | 4 |
| 10/02/2016 | 4.3 |
| 10/02/2016 | 4.5 |
| 10/02/2016 | 4.5 |
| 10/02/2016 | 4.5 |
| 10/02/2016 | 4.4 |
| 10/02/2016 | 4.3 |
| 10/02/2016 | 4.3 |
| 10/02/2016 | 4.1 |
| 10/02/2016 | 4.2 |
| 10/02/2016 | 4.5 |
| 10/02/2016 | 4.6 |
| 10/02/2016 | 4.6 |
| 10/02/2016 | 4.1 |
| 10/02/2016 | 3.5 |
| 10/02/2016 | 3.3 |
| 10/02/2016 | 3 |
| 11/02/2016 | 2.6 |
| 11/02/2016 | 2.5 |
| 11/02/2016 | 2.6 |
| 11/02/2016 | 2.5 |
| 11/02/2016 | 2.6 |
| 11/02/2016 | 2.9 |
| 11/02/2016 | 3.5 |
| 11/02/2016 | 4.1 |
| 11/02/2016 | 4.4 |
| 11/02/2016 | 4.3 |
| 11/02/2016 | 4.4 |
| 11/02/2016 | 4.3 |
| 11/02/2016 | 4.2 |
| 11/02/2016 | 4.1 |
| 11/02/2016 | 4.1 |
| 11/02/2016 | 3.9 |
| 11/02/2016 | 4 |
| 11/02/2016 | 4.3 |
| 11/02/2016 | 4.6 |
| 11/02/2016 | 4.5 |
| 11/02/2016 | 4 |
| 11/02/2016 | 3.5 |
| 11/02/2016 | 3.2 |
| 11/02/2016 | 2.9 |
| 12/02/2016 | 2.6 |
| 12/02/2016 | 2.5 |
| 12/02/2016 | 2.6 |
| 12/02/2016 | 2.4 |
| 12/02/2016 | 2.6 |
| 12/02/2016 | 2.9 |
| 12/02/2016 | 3.4 |
| 12/02/2016 | 3.9 |
| 12/02/2016 | 4.3 |
| 12/02/2016 | 4.5 |
| 12/02/2016 | 4.3 |
| 12/02/2016 | 4.4 |
| 12/02/2016 | 4.3 |
| 12/02/2016 | 4.1 |
| 12/02/2016 | 4 |
| 12/02/2016 | 4 |
| 12/02/2016 | 4 |
| 12/02/2016 | 4.4 |
| 12/02/2016 | 4.4 |
| 12/02/2016 | 4.2 |
| 12/02/2016 | 3.8 |
| 12/02/2016 | 3.5 |
| 12/02/2016 | 3.2 |
| 12/02/2016 | 3 |
| 13/02/2016 | 2.6 |
| 13/02/2016 | 2.4 |
| 13/02/2016 | 2.5 |
| 13/02/2016 | 2.5 |
| 13/02/2016 | 2.4 |
| 13/02/2016 | 2.5 |
| 13/02/2016 | 2.7 |
| 13/02/2016 | 3 |
| 13/02/2016 | 3.3 |
| 13/02/2016 | 3.6 |
| 13/02/2016 | 3.7 |
| 13/02/2016 | 3.7 |
| 13/02/2016 | 3.6 |
| 13/02/2016 | 3.4 |
| 13/02/2016 | 3.3 |
| 13/02/2016 | 3.3 |
| 13/02/2016 | 3.4 |
| 13/02/2016 | 3.7 |
| 13/02/2016 | 4 |
| 13/02/2016 | 3.8 |
| 13/02/2016 | 3.5 |
| 13/02/2016 | 3.2 |
| 13/02/2016 | 3 |
| 13/02/2016 | 2.8 |
| 14/02/2016 | 2.6 |
| 14/02/2016 | 2.5 |
| 14/02/2016 | 2.4 |
| 14/02/2016 | 2.4 |
| 14/02/2016 | 2.3 |
| 14/02/2016 | 2.4 |
| 14/02/2016 | 2.6 |
| 14/02/2016 | 2.7 |
| 14/02/2016 | 2.9 |
| 14/02/2016 | 3.2 |
| 14/02/2016 | 3.3 |
| 14/02/2016 | 3.4 |
| 14/02/2016 | 3.3 |
| 14/02/2016 | 3.2 |
| 14/02/2016 | 3.2 |
| 14/02/2016 | 3.2 |
| 14/02/2016 | 3.2 |
| 14/02/2016 | 3.5 |
| 14/02/2016 | 3.7 |
| 14/02/2016 | 3.6 |
| 14/02/2016 | 3.4 |
| 14/02/2016 | 3.3 |
| 14/02/2016 | 3.1 |
| 14/02/2016 | 2.8 |
| 15/02/2016 | 2.6 |
| 15/02/2016 | 2.4 |
| 15/02/2016 | 2.4 |
| 15/02/2016 | 2.5 |
| 15/02/2016 | 2.6 |
| 15/02/2016 | 2.8 |
| 15/02/2016 | 3.4 |
| 15/02/2016 | 3.9 |
| 15/02/2016 | 4.2 |
| 15/02/2016 | 4.3 |
| 15/02/2016 | 4.4 |
| 15/02/2016 | 4.3 |
| 15/02/2016 | 4.2 |
| 15/02/2016 | 4.2 |
| 15/02/2016 | 4.1 |
| 15/02/2016 | 4.1 |
| 15/02/2016 | 4.1 |
| 15/02/2016 | 4.2 |
| 15/02/2016 | 4.5 |
| 15/02/2016 | 4.3 |
| 15/02/2016 | 4 |
| 15/02/2016 | 3.5 |
| 15/02/2016 | 3.2 |
| 15/02/2016 | 2.9 |
| 16/02/2016 | 2.6 |
| 16/02/2016 | 2.5 |
| 16/02/2016 | 2.4 |
| 16/02/2016 | 2.5 |
| 16/02/2016 | 2.7 |
| 16/02/2016 | 2.8 |
| 16/02/2016 | 3.5 |
| 16/02/2016 | 4 |
| 16/02/2016 | 4.1 |
| 16/02/2016 | 4.2 |
| 16/02/2016 | 4.3 |
| 16/02/2016 | 4.2 |
| 16/02/2016 | 4.1 |
| 16/02/2016 | 4 |
| 16/02/2016 | 4.1 |
| 16/02/2016 | 3.9 |
| 16/02/2016 | 4 |
| 16/02/2016 | 4.4 |
| 16/02/2016 | 4.6 |
| 16/02/2016 | 4.4 |
| 16/02/2016 | 3.9 |
| 16/02/2016 | 3.6 |
| 16/02/2016 | 3.2 |
| 16/02/2016 | 2.7 |
| 17/02/2016 | 2.6 |
| 17/02/2016 | 2.6 |
| 17/02/2016 | 2.5 |
| 17/02/2016 | 2.6 |
| 17/02/2016 | 2.7 |
| 17/02/2016 | 2.8 |
| 17/02/2016 | 3.5 |
| 17/02/2016 | 3.9 |
| 17/02/2016 | 4.2 |
| 17/02/2016 | 4.3 |
| 17/02/2016 | 4.4 |
| 17/02/2016 | 4.3 |
| 17/02/2016 | 4.2 |
| 17/02/2016 | 4.1 |
| 17/02/2016 | 4.2 |
| 17/02/2016 | 3.9 |
| 17/02/2016 | 4 |
| 17/02/2016 | 4.2 |
| 17/02/2016 | 4.6 |
| 17/02/2016 | 4.4 |
| 17/02/2016 | 3.9 |
| 17/02/2016 | 3.5 |
| 17/02/2016 | 3.2 |
| 17/02/2016 | 2.7 |
| 18/02/2016 | 2.6 |
| 18/02/2016 | 2.5 |
| 18/02/2016 | 2.4 |
| 18/02/2016 | 2.5 |
| 18/02/2016 | 2.7 |
| 18/02/2016 | 2.8 |
| 18/02/2016 | 3.5 |
| 18/02/2016 | 4 |
| 18/02/2016 | 4.1 |
| 18/02/2016 | 4.2 |
| 18/02/2016 | 4.2 |
| 18/02/2016 | 4.1 |
| 18/02/2016 | 4 |
| 18/02/2016 | 4 |
| 18/02/2016 | 4 |
| 18/02/2016 | 3.7 |
| 18/02/2016 | 3.8 |
| 18/02/2016 | 4.2 |
| 18/02/2016 | 4.4 |
| 18/02/2016 | 4.2 |
| 18/02/2016 | 3.8 |
| 18/02/2016 | 3.4 |
| 18/02/2016 | 3.2 |
| 18/02/2016 | 2.7 |
| 19/02/2016 | 2.6 |
| 19/02/2016 | 2.5 |
| 19/02/2016 | 2.4 |
| 19/02/2016 | 2.5 |
| 19/02/2016 | 2.6 |
| 19/02/2016 | 2.7 |
| 19/02/2016 | 3.3 |
| 19/02/2016 | 3.8 |
| 19/02/2016 | 4.2 |
| 19/02/2016 | 4.1 |
| 19/02/2016 | 4.2 |
| 19/02/2016 | 4.3 |
| 19/02/2016 | 4.1 |
| 19/02/2016 | 3.9 |
| 19/02/2016 | 3.8 |
| 19/02/2016 | 3.8 |
| 19/02/2016 | 3.8 |
| 19/02/2016 | 4.1 |
| 19/02/2016 | 4.4 |
| 19/02/2016 | 4.2 |
| 19/02/2016 | 3.8 |
| 19/02/2016 | 3.3 |
| 19/02/2016 | 3 |
| 19/02/2016 | 2.7 |
| 20/02/2016 | 2.6 |
| 20/02/2016 | 2.4 |
| 20/02/2016 | 2.3 |
| 20/02/2016 | 2.3 |
| 20/02/2016 | 2.5 |
| 20/02/2016 | 2.6 |
| 20/02/2016 | 2.7 |
| 20/02/2016 | 3 |
| 20/02/2016 | 3.1 |
| 20/02/2016 | 3.3 |
| 20/02/2016 | 3.6 |
| 20/02/2016 | 3.4 |
| 20/02/2016 | 3.5 |
| 20/02/2016 | 3.3 |
| 20/02/2016 | 3.2 |
| 20/02/2016 | 3.2 |
| 20/02/2016 | 3.3 |
| 20/02/2016 | 3.5 |
| 20/02/2016 | 3.8 |
| 20/02/2016 | 3.8 |
| 20/02/2016 | 3.5 |
| 20/02/2016 | 3.2 |
| 20/02/2016 | 3 |
| 20/02/2016 | 2.8 |
| 21/02/2016 | 2.4 |
| 21/02/2016 | 2.5 |
| 21/02/2016 | 2.4 |
| 21/02/2016 | 2.5 |
| 21/02/2016 | 2.4 |
| 21/02/2016 | 2.5 |
| 21/02/2016 | 2.6 |
| 21/02/2016 | 2.7 |
| 21/02/2016 | 2.9 |
| 21/02/2016 | 3.1 |
| 21/02/2016 | 3.3 |
| 21/02/2016 | 3.3 |
| 21/02/2016 | 3.3 |
| 21/02/2016 | 3.1 |
| 21/02/2016 | 3.1 |
| 21/02/2016 | 3.1 |
| 21/02/2016 | 3.1 |
| 21/02/2016 | 3.4 |
| 21/02/2016 | 3.6 |
| 21/02/2016 | 3.6 |
| 21/02/2016 | 3.4 |
| 21/02/2016 | 3.1 |
| 21/02/2016 | 2.9 |
| 21/02/2016 | 2.8 |
| 22/02/2016 | 2.4 |
| 22/02/2016 | 2.5 |
| 22/02/2016 | 2.4 |
| 22/02/2016 | 2.4 |
| 22/02/2016 | 2.5 |
| 22/02/2016 | 2.9 |
| 22/02/2016 | 3.3 |
| 22/02/2016 | 3.8 |
| 22/02/2016 | 4.1 |
| 22/02/2016 | 4.2 |
| 22/02/2016 | 4 |
| 22/02/2016 | 4.1 |
| 22/02/2016 | 4.1 |
| 22/02/2016 | 4.1 |
| 22/02/2016 | 3.9 |
| 22/02/2016 | 3.9 |
| 22/02/2016 | 3.9 |
| 22/02/2016 | 4.2 |
| 22/02/2016 | 4.5 |
| 22/02/2016 | 4.3 |
| 22/02/2016 | 3.8 |
| 22/02/2016 | 3.4 |
| 22/02/2016 | 3.2 |
| 22/02/2016 | 2.7 |
| 23/02/2016 | 2.6 |
| 23/02/2016 | 2.4 |
| 23/02/2016 | 2.5 |
| 23/02/2016 | 2.4 |
| 23/02/2016 | 2.5 |
| 23/02/2016 | 2.9 |
| 23/02/2016 | 3.3 |
| 23/02/2016 | 3.7 |
| 23/02/2016 | 4 |
| 23/02/2016 | 4.1 |
| 23/02/2016 | 4.2 |
| 23/02/2016 | 4 |
| 23/02/2016 | 3.9 |
| 23/02/2016 | 3.9 |
| 23/02/2016 | 3.9 |
| 23/02/2016 | 3.9 |
| 23/02/2016 | 4 |
| 23/02/2016 | 4.1 |
| 23/02/2016 | 4.4 |
| 23/02/2016 | 4.4 |
| 23/02/2016 | 3.9 |
| 23/02/2016 | 3.5 |
| 23/02/2016 | 3 |
| 23/02/2016 | 2.7 |
| 24/02/2016 | 2.6 |
| 24/02/2016 | 2.4 |
| 24/02/2016 | 2.5 |
| 24/02/2016 | 2.4 |
| 24/02/2016 | 2.6 |
| 24/02/2016 | 2.9 |
| 24/02/2016 | 3.3 |
| 24/02/2016 | 3.8 |
| 24/02/2016 | 4.1 |
| 24/02/2016 | 4.2 |
| 24/02/2016 | 4.2 |
| 24/02/2016 | 4.1 |
| 24/02/2016 | 4.1 |
| 24/02/2016 | 4 |
| 24/02/2016 | 4 |
| 24/02/2016 | 4 |
| 24/02/2016 | 4 |
| 24/02/2016 | 4.2 |
| 24/02/2016 | 4.3 |
| 24/02/2016 | 4.4 |
| 24/02/2016 | 3.9 |
| 24/02/2016 | 3.5 |
| 24/02/2016 | 3 |
| 24/02/2016 | 2.7 |
| 25/02/2016 | 2.6 |
| 25/02/2016 | 2.4 |
| 25/02/2016 | 2.5 |
| 25/02/2016 | 2.4 |
| 25/02/2016 | 2.5 |
| 25/02/2016 | 2.8 |
| 25/02/2016 | 3.2 |
| 25/02/2016 | 3.7 |
| 25/02/2016 | 3.9 |
| 25/02/2016 | 4 |
| 25/02/2016 | 4.1 |
| 25/02/2016 | 4 |
| 25/02/2016 | 3.9 |
| 25/02/2016 | 3.8 |
| 25/02/2016 | 3.8 |
| 25/02/2016 | 3.8 |
| 25/02/2016 | 3.8 |
| 25/02/2016 | 3.9 |
| 25/02/2016 | 4.3 |
| 25/02/2016 | 4.2 |
| 25/02/2016 | 3.8 |
| 25/02/2016 | 3.4 |
| 25/02/2016 | 2.9 |
| 25/02/2016 | 2.7 |
| 26/02/2016 | 2.6 |
| 26/02/2016 | 2.3 |
| 26/02/2016 | 2.4 |
| 26/02/2016 | 2.4 |
| 26/02/2016 | 2.5 |
| 26/02/2016 | 2.8 |
| 26/02/2016 | 3.3 |
| 26/02/2016 | 3.7 |
| 26/02/2016 | 4.1 |
| 26/02/2016 | 4 |
| 26/02/2016 | 4.1 |
| 26/02/2016 | 4.1 |
| 26/02/2016 | 4 |
| 26/02/2016 | 3.8 |
| 26/02/2016 | 3.7 |
| 26/02/2016 | 3.6 |
| 26/02/2016 | 3.8 |
| 26/02/2016 | 3.8 |
| 26/02/2016 | 4.2 |
| 26/02/2016 | 4.2 |
| 26/02/2016 | 3.6 |
| 26/02/2016 | 3.2 |
| 26/02/2016 | 3 |
| 26/02/2016 | 2.7 |
| 27/02/2016 | 2.4 |
| 27/02/2016 | 2.3 |
| 27/02/2016 | 2.4 |
| 27/02/2016 | 2.4 |
| 27/02/2016 | 2.4 |
| 27/02/2016 | 2.4 |
| 27/02/2016 | 2.6 |
| 27/02/2016 | 2.7 |
| 27/02/2016 | 3 |
| 27/02/2016 | 3.3 |
| 27/02/2016 | 3.3 |
| 27/02/2016 | 3.3 |
| 27/02/2016 | 3.4 |
| 27/02/2016 | 3.2 |
| 27/02/2016 | 3.1 |
| 27/02/2016 | 3.1 |
| 27/02/2016 | 3.1 |
| 27/02/2016 | 3.4 |
| 27/02/2016 | 3.6 |
| 27/02/2016 | 3.6 |
| 27/02/2016 | 3.3 |
| 27/02/2016 | 3 |
| 27/02/2016 | 2.8 |
| 27/02/2016 | 2.6 |
| 28/02/2016 | 2.4 |
| 28/02/2016 | 2.3 |
| 28/02/2016 | 2.3 |
| 28/02/2016 | 2.3 |
| 28/02/2016 | 2.3 |
| 28/02/2016 | 2.4 |
| 28/02/2016 | 2.4 |
| 28/02/2016 | 2.5 |
| 28/02/2016 | 2.9 |
| 28/02/2016 | 2.9 |
| 28/02/2016 | 3 |
| 28/02/2016 | 3.3 |
| 28/02/2016 | 3.2 |
| 28/02/2016 | 3.1 |
| 28/02/2016 | 3 |
| 28/02/2016 | 3.1 |
| 28/02/2016 | 2.9 |
| 28/02/2016 | 3.2 |
| 28/02/2016 | 3.6 |
| 28/02/2016 | 3.6 |
| 28/02/2016 | 3.2 |
| 28/02/2016 | 3.1 |
| 28/02/2016 | 2.9 |
| 28/02/2016 | 2.6 |
| 29/02/2016 | 2.4 |
| 29/02/2016 | 2.3 |
| 29/02/2016 | 2.3 |
| 29/02/2016 | 2.4 |
| 29/02/2016 | 2.4 |
| 29/02/2016 | 2.7 |
| 29/02/2016 | 3.3 |
| 29/02/2016 | 3.6 |
| 29/02/2016 | 3.9 |
| 29/02/2016 | 4.1 |
| 29/02/2016 | 3.9 |
| 29/02/2016 | 4 |
| 29/02/2016 | 3.9 |
| 29/02/2016 | 3.9 |
| 29/02/2016 | 3.7 |
| 29/02/2016 | 3.7 |
| 29/02/2016 | 3.7 |
| 29/02/2016 | 3.9 |
| 29/02/2016 | 4.2 |
| 29/02/2016 | 4.3 |
| 29/02/2016 | 3.8 |
| 29/02/2016 | 3.2 |
| 29/02/2016 | 2.9 |
| 29/02/2016 | 2.7 |
| 01/03/2016 | 2.4 |
| 01/03/2016 | 2.4 |
| 01/03/2016 | 2.3 |
| 01/03/2016 | 2.5 |
| 01/03/2016 | 2.4 |
| 01/03/2016 | 2.7 |
| 01/03/2016 | 3.2 |
| 01/03/2016 | 3.6 |
| 01/03/2016 | 3.9 |
| 01/03/2016 | 4 |
| 01/03/2016 | 4 |
| 01/03/2016 | 3.9 |
| 01/03/2016 | 3.8 |
| 01/03/2016 | 3.8 |
| 01/03/2016 | 3.8 |
| 01/03/2016 | 3.8 |
| 01/03/2016 | 3.8 |
| 01/03/2016 | 4 |
| 01/03/2016 | 4.3 |
| 01/03/2016 | 4.2 |
| 01/03/2016 | 3.7 |
| 01/03/2016 | 3.3 |
| 01/03/2016 | 2.9 |
| 01/03/2016 | 2.7 |
| 02/03/2016 | 2.4 |
| 02/03/2016 | 2.4 |
| 02/03/2016 | 2.3 |
| 02/03/2016 | 2.3 |
| 02/03/2016 | 2.4 |
| 02/03/2016 | 2.7 |
| 02/03/2016 | 3.3 |
| 02/03/2016 | 3.6 |
| 02/03/2016 | 4 |
| 02/03/2016 | 4.1 |
| 02/03/2016 | 4.1 |
| 02/03/2016 | 4 |
| 02/03/2016 | 3.9 |
| 02/03/2016 | 3.9 |
| 02/03/2016 | 3.8 |
| 02/03/2016 | 3.8 |
| 02/03/2016 | 3.8 |
| 02/03/2016 | 3.9 |
| 02/03/2016 | 4.3 |
| 02/03/2016 | 4.4 |
| 02/03/2016 | 3.7 |
| 02/03/2016 | 3.2 |
| 02/03/2016 | 2.9 |
| 02/03/2016 | 2.7 |
| 03/03/2016 | 2.4 |
| 03/03/2016 | 2.4 |
| 03/03/2016 | 2.3 |
| 03/03/2016 | 2.3 |
| 03/03/2016 | 2.4 |
| 03/03/2016 | 2.7 |
| 03/03/2016 | 3.2 |
| 03/03/2016 | 3.5 |
| 03/03/2016 | 3.8 |
| 03/03/2016 | 3.9 |
| 03/03/2016 | 4 |
| 03/03/2016 | 3.8 |
| 03/03/2016 | 3.7 |
| 03/03/2016 | 3.7 |
| 03/03/2016 | 3.6 |
| 03/03/2016 | 3.6 |
| 03/03/2016 | 3.6 |
| 03/03/2016 | 3.7 |
| 03/03/2016 | 4.1 |
| 03/03/2016 | 4.2 |
| 03/03/2016 | 3.6 |
| 03/03/2016 | 3.1 |
| 03/03/2016 | 2.9 |
| 03/03/2016 | 2.6 |
| 04/03/2016 | 2.4 |
| 04/03/2016 | 2.4 |
| 04/03/2016 | 2.3 |
| 04/03/2016 | 2.4 |
| 04/03/2016 | 2.3 |
| 04/03/2016 | 2.6 |
| 04/03/2016 | 3.1 |
| 04/03/2016 | 3.6 |
| 04/03/2016 | 3.7 |
| 04/03/2016 | 3.9 |
| 04/03/2016 | 3.9 |
| 04/03/2016 | 4 |
| 04/03/2016 | 3.8 |
| 04/03/2016 | 3.7 |
| 04/03/2016 | 3.5 |
| 04/03/2016 | 3.7 |
| 04/03/2016 | 3.6 |
| 04/03/2016 | 3.6 |
| 04/03/2016 | 4.1 |
| 04/03/2016 | 4 |
| 04/03/2016 | 3.6 |
| 04/03/2016 | 3.2 |
| 04/03/2016 | 2.9 |
| 04/03/2016 | 2.7 |
| 05/03/2016 | 2.4 |
| 05/03/2016 | 2.3 |
| 05/03/2016 | 2.2 |
| 05/03/2016 | 2.3 |
| 05/03/2016 | 2.2 |
| 05/03/2016 | 2.3 |
| 05/03/2016 | 2.6 |
| 05/03/2016 | 2.7 |
| 05/03/2016 | 3 |
| 05/03/2016 | 3.2 |
| 05/03/2016 | 3.2 |
| 05/03/2016 | 3.2 |
| 05/03/2016 | 3.3 |
| 05/03/2016 | 3.1 |
| 05/03/2016 | 3 |
| 05/03/2016 | 3 |
| 05/03/2016 | 3 |
| 05/03/2016 | 3.2 |
| 05/03/2016 | 3.6 |
| 05/03/2016 | 3.6 |
| 05/03/2016 | 3.4 |
| 05/03/2016 | 3 |
| 05/03/2016 | 2.8 |
| 05/03/2016 | 2.6 |
| 06/03/2016 | 2.5 |
| 06/03/2016 | 2.4 |
| 06/03/2016 | 2.3 |
| 06/03/2016 | 2.2 |
| 06/03/2016 | 2.4 |
| 06/03/2016 | 2.3 |
| 06/03/2016 | 2.5 |
| 06/03/2016 | 2.5 |
| 06/03/2016 | 2.7 |
| 06/03/2016 | 2.9 |
| 06/03/2016 | 3 |
| 06/03/2016 | 3 |
| 06/03/2016 | 3.1 |
| 06/03/2016 | 3 |
| 06/03/2016 | 2.9 |
| 06/03/2016 | 3 |
| 06/03/2016 | 2.8 |
| 06/03/2016 | 2.9 |
| 06/03/2016 | 3.4 |
| 06/03/2016 | 3.4 |
| 06/03/2016 | 3.3 |
| 06/03/2016 | 2.9 |
| 06/03/2016 | 2.7 |
| 06/03/2016 | 2.6 |
| 07/03/2016 | 2.5 |
| 07/03/2016 | 2.3 |
| 07/03/2016 | 2.3 |
| 07/03/2016 | 2.3 |
| 07/03/2016 | 2.4 |
| 07/03/2016 | 2.6 |
| 07/03/2016 | 3.1 |
| 07/03/2016 | 3.5 |
| 07/03/2016 | 3.8 |
| 07/03/2016 | 3.9 |
| 07/03/2016 | 3.8 |
| 07/03/2016 | 3.8 |
| 07/03/2016 | 3.8 |
| 07/03/2016 | 3.8 |
| 07/03/2016 | 3.6 |
| 07/03/2016 | 3.6 |
| 07/03/2016 | 3.5 |
| 07/03/2016 | 3.7 |
| 07/03/2016 | 4 |
| 07/03/2016 | 4.1 |
| 07/03/2016 | 3.6 |
| 07/03/2016 | 3.2 |
| 07/03/2016 | 2.9 |
| 07/03/2016 | 2.6 |
| 08/03/2016 | 2.4 |
| 08/03/2016 | 2.2 |
| 08/03/2016 | 2.4 |
| 08/03/2016 | 2.3 |
| 08/03/2016 | 2.5 |
| 08/03/2016 | 2.6 |
| 08/03/2016 | 3 |
| 08/03/2016 | 3.5 |
| 08/03/2016 | 3.8 |
| 08/03/2016 | 3.9 |
| 08/03/2016 | 3.9 |
| 08/03/2016 | 3.7 |
| 08/03/2016 | 3.7 |
| 08/03/2016 | 3.6 |
| 08/03/2016 | 3.6 |
| 08/03/2016 | 3.6 |
| 08/03/2016 | 3.6 |
| 08/03/2016 | 3.8 |
| 08/03/2016 | 4.1 |
| 08/03/2016 | 4.2 |
| 08/03/2016 | 3.7 |
| 08/03/2016 | 3.2 |
| 08/03/2016 | 2.9 |
| 08/03/2016 | 2.7 |
| 09/03/2016 | 2.4 |
| 09/03/2016 | 2.3 |
| 09/03/2016 | 2.2 |
| 09/03/2016 | 2.4 |
| 09/03/2016 | 2.5 |
| 09/03/2016 | 2.6 |
| 09/03/2016 | 3 |
| 09/03/2016 | 3.5 |
| 09/03/2016 | 3.8 |
| 09/03/2016 | 3.9 |
| 09/03/2016 | 4 |
| 09/03/2016 | 3.8 |
| 09/03/2016 | 3.8 |
| 09/03/2016 | 3.7 |
| 09/03/2016 | 3.7 |
| 09/03/2016 | 3.6 |
| 09/03/2016 | 3.6 |
| 09/03/2016 | 3.7 |
| 09/03/2016 | 4 |
| 09/03/2016 | 4.1 |
| 09/03/2016 | 3.7 |
| 09/03/2016 | 3.2 |
| 09/03/2016 | 2.9 |
| 09/03/2016 | 2.5 |
| 10/03/2016 | 2.4 |
| 10/03/2016 | 2.2 |
| 10/03/2016 | 2.2 |
| 10/03/2016 | 2.3 |
| 10/03/2016 | 2.4 |
| 10/03/2016 | 2.5 |
| 10/03/2016 | 3.2 |
| 10/03/2016 | 3.4 |
| 10/03/2016 | 3.7 |
| 10/03/2016 | 3.8 |
| 10/03/2016 | 3.8 |
| 10/03/2016 | 3.7 |
| 10/03/2016 | 3.6 |
| 10/03/2016 | 3.6 |
| 10/03/2016 | 3.5 |
| 10/03/2016 | 3.5 |
| 10/03/2016 | 3.4 |
| 10/03/2016 | 3.5 |
| 10/03/2016 | 4.1 |
| 10/03/2016 | 4 |
| 10/03/2016 | 3.6 |
| 10/03/2016 | 3.1 |
| 10/03/2016 | 2.8 |
| 10/03/2016 | 2.4 |
| 11/03/2016 | 2.4 |
| 11/03/2016 | 2.2 |
| 11/03/2016 | 2.3 |
| 11/03/2016 | 2.3 |
| 11/03/2016 | 2.4 |
| 11/03/2016 | 2.7 |
| 11/03/2016 | 3 |
| 11/03/2016 | 3.5 |
| 11/03/2016 | 3.6 |
| 11/03/2016 | 3.8 |
| 11/03/2016 | 3.8 |
| 11/03/2016 | 3.8 |
| 11/03/2016 | 3.7 |
| 11/03/2016 | 3.7 |
| 11/03/2016 | 3.6 |
| 11/03/2016 | 3.5 |
| 11/03/2016 | 3.4 |
| 11/03/2016 | 3.4 |
| 11/03/2016 | 3.9 |
| 11/03/2016 | 3.9 |
| 11/03/2016 | 3.4 |
| 11/03/2016 | 3 |
| 11/03/2016 | 2.7 |
| 11/03/2016 | 2.5 |
| 12/03/2016 | 2.2 |
| 12/03/2016 | 2.1 |
| 12/03/2016 | 2.3 |
| 12/03/2016 | 2.1 |
| 12/03/2016 | 2.3 |
| 12/03/2016 | 2.4 |
| 12/03/2016 | 2.4 |
| 12/03/2016 | 2.7 |
| 12/03/2016 | 2.8 |
| 12/03/2016 | 2.9 |
| 12/03/2016 | 3.1 |
| 12/03/2016 | 3.1 |
| 12/03/2016 | 3 |
| 12/03/2016 | 3 |
| 12/03/2016 | 2.9 |
| 12/03/2016 | 2.9 |
| 12/03/2016 | 2.9 |
| 12/03/2016 | 2.9 |
| 12/03/2016 | 3.5 |
| 12/03/2016 | 3.4 |
| 12/03/2016 | 3.2 |
| 12/03/2016 | 2.8 |
| 12/03/2016 | 2.6 |
| 12/03/2016 | 2.4 |
| 13/03/2016 | 2.3 |
| 13/03/2016 | 2.2 |
| 13/03/2016 | 2.2 |
| 13/03/2016 | 2.3 |
| 13/03/2016 | 2.2 |
| 13/03/2016 | 2.3 |
| 13/03/2016 | 2.3 |
| 13/03/2016 | 2.5 |
| 13/03/2016 | 2.7 |
| 13/03/2016 | 2.8 |
| 13/03/2016 | 2.9 |
| 13/03/2016 | 2.9 |
| 13/03/2016 | 3 |
| 13/03/2016 | 3 |
| 13/03/2016 | 2.9 |
| 13/03/2016 | 2.7 |
| 13/03/2016 | 2.7 |
| 13/03/2016 | 2.8 |
| 13/03/2016 | 3.3 |
| 13/03/2016 | 3.4 |
| 13/03/2016 | 3.1 |
| 13/03/2016 | 2.8 |
| 13/03/2016 | 2.6 |
| 13/03/2016 | 2.4 |
| 14/03/2016 | 2.3 |
| 14/03/2016 | 2.2 |
| 14/03/2016 | 2.2 |
| 14/03/2016 | 2.2 |
| 14/03/2016 | 2.3 |
| 14/03/2016 | 2.6 |
| 14/03/2016 | 3.1 |
| 14/03/2016 | 3.4 |
| 14/03/2016 | 3.5 |
| 14/03/2016 | 3.6 |
| 14/03/2016 | 3.7 |
| 14/03/2016 | 3.7 |
| 14/03/2016 | 3.7 |
| 14/03/2016 | 3.7 |
| 14/03/2016 | 3.5 |
| 14/03/2016 | 3.4 |
| 14/03/2016 | 3.5 |
| 14/03/2016 | 3.5 |
| 14/03/2016 | 4 |
| 14/03/2016 | 4 |
| 14/03/2016 | 3.6 |
| 14/03/2016 | 3.2 |
| 14/03/2016 | 2.6 |
| 14/03/2016 | 2.4 |
| 15/03/2016 | 2.4 |
| 15/03/2016 | 2.3 |
| 15/03/2016 | 2.2 |
| 15/03/2016 | 2.2 |
| 15/03/2016 | 2.3 |
| 15/03/2016 | 2.6 |
| 15/03/2016 | 3 |
| 15/03/2016 | 3.4 |
| 15/03/2016 | 3.7 |
| 15/03/2016 | 3.8 |
| 15/03/2016 | 3.8 |
| 15/03/2016 | 3.6 |
| 15/03/2016 | 3.6 |
| 15/03/2016 | 3.5 |
| 15/03/2016 | 3.5 |
| 15/03/2016 | 3.5 |
| 15/03/2016 | 3.5 |
| 15/03/2016 | 3.7 |
| 15/03/2016 | 4.1 |
| 15/03/2016 | 4.1 |
| 15/03/2016 | 3.7 |
| 15/03/2016 | 3.2 |
| 15/03/2016 | 2.7 |
| 15/03/2016 | 2.5 |
| 16/03/2016 | 2.3 |
| 16/03/2016 | 2.3 |
| 16/03/2016 | 2.3 |
| 16/03/2016 | 2.2 |
| 16/03/2016 | 2.4 |
| 16/03/2016 | 2.7 |
| 16/03/2016 | 3.1 |
| 16/03/2016 | 3.5 |
| 16/03/2016 | 3.8 |
| 16/03/2016 | 3.9 |
| 16/03/2016 | 3.9 |
| 16/03/2016 | 3.7 |
| 16/03/2016 | 3.7 |
| 16/03/2016 | 3.7 |
| 16/03/2016 | 3.6 |
| 16/03/2016 | 3.6 |
| 16/03/2016 | 3.5 |
| 16/03/2016 | 3.7 |
| 16/03/2016 | 4 |
| 16/03/2016 | 4 |
| 16/03/2016 | 3.7 |
| 16/03/2016 | 3.2 |
| 16/03/2016 | 2.7 |
| 16/03/2016 | 2.5 |
| 17/03/2016 | 2.3 |
| 17/03/2016 | 2.3 |
| 17/03/2016 | 2.3 |
| 17/03/2016 | 2.2 |
| 17/03/2016 | 2.4 |
| 17/03/2016 | 2.6 |
| 17/03/2016 | 3 |
| 17/03/2016 | 3.4 |
| 17/03/2016 | 3.7 |
| 17/03/2016 | 3.8 |
| 17/03/2016 | 3.8 |
| 17/03/2016 | 3.6 |
| 17/03/2016 | 3.6 |
| 17/03/2016 | 3.5 |
| 17/03/2016 | 3.5 |
| 17/03/2016 | 3.4 |
| 17/03/2016 | 3.4 |
| 17/03/2016 | 3.6 |
| 17/03/2016 | 3.9 |
| 17/03/2016 | 3.8 |
| 17/03/2016 | 3.6 |
| 17/03/2016 | 3.2 |
| 17/03/2016 | 2.7 |
| 17/03/2016 | 2.5 |
| 18/03/2016 | 2.3 |
| 18/03/2016 | 2.3 |
| 18/03/2016 | 2.2 |
| 18/03/2016 | 2.2 |
| 18/03/2016 | 2.3 |
| 18/03/2016 | 2.6 |
| 18/03/2016 | 3.1 |
| 18/03/2016 | 3.3 |
| 18/03/2016 | 3.6 |
| 18/03/2016 | 3.8 |
| 18/03/2016 | 3.8 |
| 18/03/2016 | 3.6 |
| 18/03/2016 | 3.7 |
| 18/03/2016 | 3.6 |
| 18/03/2016 | 3.4 |
| 18/03/2016 | 3.5 |
| 18/03/2016 | 3.5 |
| 18/03/2016 | 3.6 |
| 18/03/2016 | 3.9 |
| 18/03/2016 | 3.8 |
| 18/03/2016 | 3.4 |
| 18/03/2016 | 3.1 |
| 18/03/2016 | 2.8 |
| 18/03/2016 | 2.5 |
| 19/03/2016 | 2.3 |
| 19/03/2016 | 2.2 |
| 19/03/2016 | 2.2 |
| 19/03/2016 | 2.3 |
| 19/03/2016 | 2.3 |
| 19/03/2016 | 2.3 |
| 19/03/2016 | 2.5 |
| 19/03/2016 | 2.5 |
| 19/03/2016 | 2.8 |
| 19/03/2016 | 3 |
| 19/03/2016 | 3.2 |
| 19/03/2016 | 3.2 |
| 19/03/2016 | 3.1 |
| 19/03/2016 | 3.1 |
| 19/03/2016 | 3 |
| 19/03/2016 | 3 |
| 19/03/2016 | 3 |
| 19/03/2016 | 3 |
| 19/03/2016 | 3.4 |
| 19/03/2016 | 3.5 |
| 19/03/2016 | 3.2 |
| 19/03/2016 | 2.9 |
| 19/03/2016 | 2.7 |
| 19/03/2016 | 2.5 |
| 20/03/2016 | 2.4 |
| 20/03/2016 | 2.4 |
| 20/03/2016 | 2.3 |
| 20/03/2016 | 2.2 |
| 20/03/2016 | 2.2 |
| 20/03/2016 | 2.3 |
| 20/03/2016 | 2.5 |
| 20/03/2016 | 2.4 |
| 20/03/2016 | 2.6 |
| 20/03/2016 | 2.7 |
| 20/03/2016 | 2.8 |
| 20/03/2016 | 3 |
| 20/03/2016 | 2.9 |
| 20/03/2016 | 2.9 |
| 20/03/2016 | 2.8 |
| 20/03/2016 | 2.8 |
| 20/03/2016 | 2.9 |
| 20/03/2016 | 3.1 |
| 20/03/2016 | 3.2 |
| 20/03/2016 | 3.2 |
| 20/03/2016 | 3.1 |
| 20/03/2016 | 2.8 |
| 20/03/2016 | 2.8 |
| 20/03/2016 | 2.5 |
| 21/03/2016 | 2.4 |
| 21/03/2016 | 2.3 |
| 21/03/2016 | 2.3 |
| 21/03/2016 | 2.3 |
| 21/03/2016 | 2.4 |
| 21/03/2016 | 2.6 |
| 21/03/2016 | 2.9 |
| 21/03/2016 | 3.3 |
| 21/03/2016 | 3.5 |
| 21/03/2016 | 3.6 |
| 21/03/2016 | 3.7 |
| 21/03/2016 | 3.6 |
| 21/03/2016 | 3.5 |
| 21/03/2016 | 3.5 |
| 21/03/2016 | 3.4 |
| 21/03/2016 | 3.4 |
| 21/03/2016 | 3.4 |
| 21/03/2016 | 3.7 |
| 21/03/2016 | 3.8 |
| 21/03/2016 | 3.7 |
| 21/03/2016 | 3.4 |
| 21/03/2016 | 3 |
| 21/03/2016 | 2.9 |
| 21/03/2016 | 2.5 |
| 22/03/2016 | 2.3 |
| 22/03/2016 | 2.4 |
| 22/03/2016 | 2.4 |
| 22/03/2016 | 2.3 |
| 22/03/2016 | 2.4 |
| 22/03/2016 | 2.6 |
| 22/03/2016 | 2.9 |
| 22/03/2016 | 3.3 |
| 22/03/2016 | 3.5 |
| 22/03/2016 | 3.7 |
| 22/03/2016 | 3.8 |
| 22/03/2016 | 3.7 |
| 22/03/2016 | 3.6 |
| 22/03/2016 | 3.6 |
| 22/03/2016 | 3.5 |
| 22/03/2016 | 3.5 |
| 22/03/2016 | 3.5 |
| 22/03/2016 | 3.7 |
| 22/03/2016 | 3.9 |
| 22/03/2016 | 3.8 |
| 22/03/2016 | 3.5 |
| 22/03/2016 | 3.1 |
| 22/03/2016 | 2.9 |
| 22/03/2016 | 2.5 |
| 23/03/2016 | 2.4 |
| 23/03/2016 | 2.3 |
| 23/03/2016 | 2.4 |
| 23/03/2016 | 2.4 |
| 23/03/2016 | 2.5 |
| 23/03/2016 | 2.7 |
| 23/03/2016 | 2.9 |
| 23/03/2016 | 3.4 |
| 23/03/2016 | 3.6 |
| 23/03/2016 | 3.8 |
| 23/03/2016 | 3.7 |
| 23/03/2016 | 3.8 |
| 23/03/2016 | 3.8 |
| 23/03/2016 | 3.7 |
| 23/03/2016 | 3.6 |
| 23/03/2016 | 3.5 |
| 23/03/2016 | 3.5 |
| 23/03/2016 | 3.7 |
| 23/03/2016 | 3.9 |
| 23/03/2016 | 3.9 |
| 23/03/2016 | 3.5 |
| 23/03/2016 | 3.1 |
| 23/03/2016 | 2.9 |
| 23/03/2016 | 2.6 |
| 24/03/2016 | 2.4 |
| 24/03/2016 | 2.2 |
| 24/03/2016 | 2.4 |
| 24/03/2016 | 2.3 |
| 24/03/2016 | 2.5 |
| 24/03/2016 | 2.6 |
| 24/03/2016 | 3 |
| 24/03/2016 | 3.3 |
| 24/03/2016 | 3.5 |
| 24/03/2016 | 3.7 |
| 24/03/2016 | 3.6 |
| 24/03/2016 | 3.7 |
| 24/03/2016 | 3.6 |
| 24/03/2016 | 3.6 |
| 24/03/2016 | 3.5 |
| 24/03/2016 | 3.4 |
| 24/03/2016 | 3.4 |
| 24/03/2016 | 3.5 |
| 24/03/2016 | 3.7 |
| 24/03/2016 | 3.7 |
| 24/03/2016 | 3.3 |
| 24/03/2016 | 3.1 |
| 24/03/2016 | 2.9 |
| 24/03/2016 | 2.5 |
| 25/03/2016 | 2.5 |
| 25/03/2016 | 2.5 |
| 25/03/2016 | 2.4 |
| 25/03/2016 | 2.3 |
| 25/03/2016 | 2.3 |
| 25/03/2016 | 2.3 |
| 25/03/2016 | 2.4 |
| 25/03/2016 | 2.3 |
| 25/03/2016 | 2.6 |
| 25/03/2016 | 2.8 |
| 25/03/2016 | 2.9 |
| 25/03/2016 | 3 |
| 25/03/2016 | 3 |
| 25/03/2016 | 3.1 |
| 25/03/2016 | 3 |
| 25/03/2016 | 2.8 |
| 25/03/2016 | 2.8 |
| 25/03/2016 | 3.1 |
| 25/03/2016 | 3.2 |
| 25/03/2016 | 3 |
| 25/03/2016 | 2.9 |
| 25/03/2016 | 2.8 |
| 25/03/2016 | 2.7 |
| 25/03/2016 | 2.4 |
| 26/03/2016 | 2.5 |
| 26/03/2016 | 2.4 |
| 26/03/2016 | 2.3 |
| 26/03/2016 | 2.4 |
| 26/03/2016 | 2.4 |
| 26/03/2016 | 2.4 |
| 26/03/2016 | 2.5 |
| 26/03/2016 | 2.4 |
| 26/03/2016 | 2.8 |
| 26/03/2016 | 3 |
| 26/03/2016 | 3.1 |
| 26/03/2016 | 3.1 |
| 26/03/2016 | 3.2 |
| 26/03/2016 | 3 |
| 26/03/2016 | 2.9 |
| 26/03/2016 | 2.9 |
| 26/03/2016 | 2.9 |
| 26/03/2016 | 3.2 |
| 26/03/2016 | 3.3 |
| 26/03/2016 | 3.3 |
| 26/03/2016 | 3.1 |
| 26/03/2016 | 2.8 |
| 26/03/2016 | 2.7 |
| 26/03/2016 | 2.5 |
| 27/03/2016 | 2.2 |
| 27/03/2016 | 2.2 |
| 27/03/2016 | 0 |
| 27/03/2016 | 2.1 |
| 27/03/2016 | 2 |
| 27/03/2016 | 2.1 |
| 27/03/2016 | 2.3 |
| 27/03/2016 | 2.6 |
| 27/03/2016 | 2.7 |
| 27/03/2016 | 2.9 |
| 27/03/2016 | 2.9 |
| 27/03/2016 | 2.9 |
| 27/03/2016 | 2.8 |
| 27/03/2016 | 2.6 |
| 27/03/2016 | 2.7 |
| 27/03/2016 | 2.5 |
| 27/03/2016 | 2.4 |
| 27/03/2016 | 2.3 |
| 27/03/2016 | 3.1 |
| 27/03/2016 | 3.2 |
| 27/03/2016 | 2.8 |
| 27/03/2016 | 2.6 |
| 27/03/2016 | 2.5 |
| 27/03/2016 | 2.5 |
| 28/03/2016 | 2.1 |
| 28/03/2016 | 2.2 |
| 28/03/2016 | 2.2 |
| 28/03/2016 | 2.1 |
| 28/03/2016 | 2 |
| 28/03/2016 | 2.1 |
| 28/03/2016 | 2.3 |
| 28/03/2016 | 2.6 |
| 28/03/2016 | 2.7 |
| 28/03/2016 | 2.9 |
| 28/03/2016 | 2.9 |
| 28/03/2016 | 2.9 |
| 28/03/2016 | 2.8 |
| 28/03/2016 | 2.6 |
| 28/03/2016 | 2.7 |
| 28/03/2016 | 2.5 |
| 28/03/2016 | 2.6 |
| 28/03/2016 | 2.4 |
| 28/03/2016 | 3.3 |
| 28/03/2016 | 3.2 |
| 28/03/2016 | 3 |
| 28/03/2016 | 2.6 |
| 28/03/2016 | 2.5 |
| 28/03/2016 | 2.5 |
| 29/03/2016 | 2.4 |
| 29/03/2016 | 2.4 |
| 29/03/2016 | 2.4 |
| 29/03/2016 | 2.3 |
| 29/03/2016 | 2.4 |
| 29/03/2016 | 2.6 |
| 29/03/2016 | 3.1 |
| 29/03/2016 | 3.4 |
| 29/03/2016 | 3.8 |
| 29/03/2016 | 3.9 |
| 29/03/2016 | 3.9 |
| 29/03/2016 | 4 |
| 29/03/2016 | 3.9 |
| 29/03/2016 | 3.8 |
| 29/03/2016 | 3.7 |
| 29/03/2016 | 3.6 |
| 29/03/2016 | 3.6 |
| 29/03/2016 | 3.7 |
| 29/03/2016 | 3.9 |
| 29/03/2016 | 3.9 |
| 29/03/2016 | 3.8 |
| 29/03/2016 | 3.2 |
| 29/03/2016 | 2.9 |
| 29/03/2016 | 2.8 |
| 30/03/2016 | 2.5 |
| 30/03/2016 | 2.5 |
| 30/03/2016 | 2.4 |
| 30/03/2016 | 2.4 |
| 30/03/2016 | 2.5 |
| 30/03/2016 | 2.7 |
| 30/03/2016 | 3.1 |
| 30/03/2016 | 3.5 |
| 30/03/2016 | 3.9 |
| 30/03/2016 | 4 |
| 30/03/2016 | 4 |
| 30/03/2016 | 4.1 |
| 30/03/2016 | 4.1 |
| 30/03/2016 | 3.9 |
| 30/03/2016 | 3.8 |
| 30/03/2016 | 3.7 |
| 30/03/2016 | 3.6 |
| 30/03/2016 | 3.6 |
| 30/03/2016 | 4 |
| 30/03/2016 | 3.9 |
| 30/03/2016 | 3.7 |
| 30/03/2016 | 3.2 |
| 30/03/2016 | 2.9 |
| 30/03/2016 | 2.8 |
| 31/03/2016 | 2.5 |
| 31/03/2016 | 2.5 |
| 31/03/2016 | 2.4 |
| 31/03/2016 | 2.4 |
| 31/03/2016 | 2.5 |
| 31/03/2016 | 2.6 |
| 31/03/2016 | 3.1 |
| 31/03/2016 | 3.4 |
| 31/03/2016 | 3.8 |
| 31/03/2016 | 3.9 |
| 31/03/2016 | 3.9 |
| 31/03/2016 | 4 |
| 31/03/2016 | 4 |
| 31/03/2016 | 3.8 |
| 31/03/2016 | 3.6 |
| 31/03/2016 | 3.6 |
| 31/03/2016 | 3.5 |
| 31/03/2016 | 3.5 |
| 31/03/2016 | 3.9 |
| 31/03/2016 | 3.9 |
| 31/03/2016 | 3.6 |
| 31/03/2016 | 3.1 |
| 31/03/2016 | 2.9 |
| 31/03/2016 | 2.8 |
| 01/04/2016 | 2.5 |
| 01/04/2016 | 2.5 |
| 01/04/2016 | 2.4 |
| 01/04/2016 | 2.3 |
| 01/04/2016 | 2.4 |
| 01/04/2016 | 2.8 |
| 01/04/2016 | 3 |
| 01/04/2016 | 3.5 |
| 01/04/2016 | 3.7 |
| 01/04/2016 | 3.9 |
| 01/04/2016 | 4.1 |
| 01/04/2016 | 4 |
| 01/04/2016 | 3.9 |
| 01/04/2016 | 3.8 |
| 01/04/2016 | 3.6 |
| 01/04/2016 | 3.5 |
| 01/04/2016 | 3.6 |
| 01/04/2016 | 3.4 |
| 01/04/2016 | 3.8 |
| 01/04/2016 | 3.7 |
| 01/04/2016 | 3.4 |
| 01/04/2016 | 3.3 |
| 01/04/2016 | 3 |
| 01/04/2016 | 2.6 |
| 02/04/2016 | 2.5 |
| 02/04/2016 | 2.4 |
| 02/04/2016 | 2.3 |
| 02/04/2016 | 2.4 |
| 02/04/2016 | 2.4 |
| 02/04/2016 | 2.3 |
| 02/04/2016 | 2.5 |
| 02/04/2016 | 2.7 |
| 02/04/2016 | 2.9 |
| 02/04/2016 | 3.1 |
| 02/04/2016 | 3.3 |
| 02/04/2016 | 3.3 |
| 02/04/2016 | 3.3 |
| 02/04/2016 | 3.2 |
| 02/04/2016 | 3 |
| 02/04/2016 | 3 |
| 02/04/2016 | 3 |
| 02/04/2016 | 3 |
| 02/04/2016 | 3.4 |
| 02/04/2016 | 3.3 |
| 02/04/2016 | 3.3 |
| 02/04/2016 | 3.1 |
| 02/04/2016 | 2.9 |
| 02/04/2016 | 2.7 |
| 03/04/2016 | 2.6 |
| 03/04/2016 | 2.3 |
| 03/04/2016 | 2.3 |
| 03/04/2016 | 2.4 |
| 03/04/2016 | 2.4 |
| 03/04/2016 | 2.5 |
| 03/04/2016 | 2.4 |
| 03/04/2016 | 2.6 |
| 03/04/2016 | 2.8 |
| 03/04/2016 | 3 |
| 03/04/2016 | 3.1 |
| 03/04/2016 | 3.1 |
| 03/04/2016 | 3.3 |
| 03/04/2016 | 3.2 |
| 03/04/2016 | 3.1 |
| 03/04/2016 | 3.1 |
| 03/04/2016 | 3 |
| 03/04/2016 | 2.9 |
| 03/04/2016 | 3.2 |
| 03/04/2016 | 3.5 |
| 03/04/2016 | 3.3 |
| 03/04/2016 | 3 |
| 03/04/2016 | 2.9 |
| 03/04/2016 | 2.8 |
| 04/04/2016 | 2.6 |
| 04/04/2016 | 2.5 |
| 04/04/2016 | 2.3 |
| 04/04/2016 | 2.5 |
| 04/04/2016 | 2.4 |
| 04/04/2016 | 2.7 |
| 04/04/2016 | 3.3 |
| 04/04/2016 | 3.7 |
| 04/04/2016 | 3.8 |
| 04/04/2016 | 3.9 |
| 04/04/2016 | 4.1 |
| 04/04/2016 | 4 |
| 04/04/2016 | 4 |
| 04/04/2016 | 4 |
| 04/04/2016 | 3.9 |
| 04/04/2016 | 3.9 |
| 04/04/2016 | 3.8 |
| 04/04/2016 | 3.7 |
| 04/04/2016 | 4 |
| 04/04/2016 | 4 |
| 04/04/2016 | 3.8 |
| 04/04/2016 | 3.4 |
| 04/04/2016 | 3.1 |
| 04/04/2016 | 2.9 |
| 05/04/2016 | 2.6 |
| 05/04/2016 | 2.4 |
| 05/04/2016 | 2.3 |
| 05/04/2016 | 2.5 |
| 05/04/2016 | 2.5 |
| 05/04/2016 | 2.7 |
| 05/04/2016 | 3.2 |
| 05/04/2016 | 3.7 |
| 05/04/2016 | 4 |
| 05/04/2016 | 3.9 |
| 05/04/2016 | 4 |
| 05/04/2016 | 4.1 |
| 05/04/2016 | 4.1 |
| 05/04/2016 | 4.1 |
| 05/04/2016 | 4 |
| 05/04/2016 | 4 |
| 05/04/2016 | 4 |
| 05/04/2016 | 3.9 |
| 05/04/2016 | 4.1 |
| 05/04/2016 | 4 |
| 05/04/2016 | 3.9 |
| 05/04/2016 | 3.5 |
| 05/04/2016 | 3.1 |
| 05/04/2016 | 2.8 |
| 06/04/2016 | 2.6 |
| 06/04/2016 | 2.4 |
| 06/04/2016 | 2.4 |
| 06/04/2016 | 2.6 |
| 06/04/2016 | 2.5 |
| 06/04/2016 | 2.8 |
| 06/04/2016 | 3.3 |
| 06/04/2016 | 3.8 |
| 06/04/2016 | 3.9 |
| 06/04/2016 | 4 |
| 06/04/2016 | 4.1 |
| 06/04/2016 | 4.2 |
| 06/04/2016 | 4.2 |
| 06/04/2016 | 4.2 |
| 06/04/2016 | 4.1 |
| 06/04/2016 | 4 |
| 06/04/2016 | 4 |
| 06/04/2016 | 3.9 |
| 06/04/2016 | 4.1 |
| 06/04/2016 | 4.2 |
| 06/04/2016 | 3.9 |
| 06/04/2016 | 3.4 |
| 06/04/2016 | 3.2 |
| 06/04/2016 | 2.8 |
| 07/04/2016 | 2.6 |
| 07/04/2016 | 2.4 |
| 07/04/2016 | 2.4 |
| 07/04/2016 | 2.5 |
| 07/04/2016 | 2.5 |
| 07/04/2016 | 2.7 |
| 07/04/2016 | 3.2 |
| 07/04/2016 | 3.7 |
| 07/04/2016 | 4 |
| 07/04/2016 | 3.9 |
| 07/04/2016 | 4 |
| 07/04/2016 | 4.1 |
| 07/04/2016 | 4.1 |
| 07/04/2016 | 4 |
| 07/04/2016 | 3.9 |
| 07/04/2016 | 3.9 |
| 07/04/2016 | 3.7 |
| 07/04/2016 | 3.8 |
| 07/04/2016 | 3.9 |
| 07/04/2016 | 4 |
| 07/04/2016 | 3.7 |
| 07/04/2016 | 3.4 |
| 07/04/2016 | 3.1 |
| 07/04/2016 | 2.7 |
| 08/04/2016 | 2.6 |
| 08/04/2016 | 2.4 |
| 08/04/2016 | 2.4 |
| 08/04/2016 | 2.5 |
| 08/04/2016 | 2.7 |
| 08/04/2016 | 2.9 |
| 08/04/2016 | 3.1 |
| 08/04/2016 | 3.6 |
| 08/04/2016 | 3.9 |
| 08/04/2016 | 4.1 |
| 08/04/2016 | 4 |
| 08/04/2016 | 4.1 |
| 08/04/2016 | 4 |
| 08/04/2016 | 4.1 |
| 08/04/2016 | 3.9 |
| 08/04/2016 | 3.8 |
| 08/04/2016 | 3.8 |
| 08/04/2016 | 3.6 |
| 08/04/2016 | 3.8 |
| 08/04/2016 | 4 |
| 08/04/2016 | 3.8 |
| 08/04/2016 | 3.3 |
| 08/04/2016 | 3 |
| 08/04/2016 | 2.8 |
| 09/04/2016 | 2.5 |
| 09/04/2016 | 2.6 |
| 09/04/2016 | 2.5 |
| 09/04/2016 | 2.4 |
| 09/04/2016 | 2.4 |
| 09/04/2016 | 2.6 |
| 09/04/2016 | 2.6 |
| 09/04/2016 | 2.9 |
| 09/04/2016 | 2.9 |
| 09/04/2016 | 3.3 |
| 09/04/2016 | 3.4 |
| 09/04/2016 | 3.4 |
| 09/04/2016 | 3.4 |
| 09/04/2016 | 3.4 |
| 09/04/2016 | 3.2 |
| 09/04/2016 | 3.3 |
| 09/04/2016 | 3.3 |
| 09/04/2016 | 3.3 |
| 09/04/2016 | 3.4 |
| 09/04/2016 | 3.4 |
| 09/04/2016 | 3.4 |
| 09/04/2016 | 3.3 |
| 09/04/2016 | 2.9 |
| 09/04/2016 | 2.7 |
| 09/04/2016 | 2.6 |
| 10/04/2016 | 2.5 |
| 10/04/2016 | 2.5 |
| 10/04/2016 | 2.3 |
| 10/04/2016 | 2.3 |
| 10/04/2016 | 2.4 |
| 10/04/2016 | 2.5 |
| 10/04/2016 | 2.5 |
| 10/04/2016 | 2.7 |
| 10/04/2016 | 3.1 |
| 10/04/2016 | 3.2 |
| 10/04/2016 | 3.3 |
| 10/04/2016 | 3.3 |
| 10/04/2016 | 3.4 |
| 10/04/2016 | 3.2 |
| 10/04/2016 | 3.1 |
| 10/04/2016 | 3 |
| 10/04/2016 | 3.2 |
| 10/04/2016 | 3.3 |
| 10/04/2016 | 3.3 |
| 10/04/2016 | 3.3 |
| 10/04/2016 | 3.2 |
| 10/04/2016 | 3 |
| 10/04/2016 | 2.7 |
| 10/04/2016 | 2.6 |
| 11/04/2016 | 2.5 |
| 11/04/2016 | 2.5 |
| 11/04/2016 | 2.4 |
| 11/04/2016 | 2.6 |
| 11/04/2016 | 2.9 |
| 11/04/2016 | 3.2 |
| 11/04/2016 | 3.6 |
| 11/04/2016 | 3.9 |
| 11/04/2016 | 4 |
| 11/04/2016 | 4.1 |
| 11/04/2016 | 4.1 |
| 11/04/2016 | 4.1 |
| 11/04/2016 | 4.1 |
| 11/04/2016 | 4.1 |
| 11/04/2016 | 4.1 |
| 11/04/2016 | 4 |
| 11/04/2016 | 3.8 |
| 11/04/2016 | 3.9 |
| 11/04/2016 | 4.1 |
| 11/04/2016 | 3.8 |
| 11/04/2016 | 3.5 |
| 11/04/2016 | 3.2 |
| 11/04/2016 | 2.8 |
| 11/04/2016 | 2.7 |
| 12/04/2016 | 2.5 |
| 12/04/2016 | 2.5 |
| 12/04/2016 | 2.5 |
| 12/04/2016 | 2.6 |
| 12/04/2016 | 2.9 |
| 12/04/2016 | 3.3 |
| 12/04/2016 | 3.8 |
| 12/04/2016 | 3.9 |
| 12/04/2016 | 4 |
| 12/04/2016 | 4.1 |
| 12/04/2016 | 4.2 |
| 12/04/2016 | 4.2 |
| 12/04/2016 | 4.2 |
| 12/04/2016 | 4.1 |
| 12/04/2016 | 3.9 |
| 12/04/2016 | 4 |
| 12/04/2016 | 4 |
| 12/04/2016 | 4 |
| 12/04/2016 | 4.2 |
| 12/04/2016 | 3.9 |
| 12/04/2016 | 3.6 |
| 12/04/2016 | 3.3 |
| 12/04/2016 | 2.9 |
| 12/04/2016 | 2.8 |
| 13/04/2016 | 2.6 |
| 13/04/2016 | 2.5 |
| 13/04/2016 | 2.5 |
| 13/04/2016 | 2.7 |
| 13/04/2016 | 2.9 |
| 13/04/2016 | 3.4 |
| 13/04/2016 | 3.6 |
| 13/04/2016 | 4 |
| 13/04/2016 | 4.1 |
| 13/04/2016 | 4.2 |
| 13/04/2016 | 4.3 |
| 13/04/2016 | 4.3 |
| 13/04/2016 | 4.3 |
| 13/04/2016 | 4.2 |
| 13/04/2016 | 4 |
| 13/04/2016 | 4 |
| 13/04/2016 | 4 |
| 13/04/2016 | 3.9 |
| 13/04/2016 | 4.1 |
| 13/04/2016 | 4 |
| 13/04/2016 | 3.6 |
| 13/04/2016 | 3.1 |
| 13/04/2016 | 2.9 |
| 13/04/2016 | 2.8 |
| 14/04/2016 | 2.6 |
| 14/04/2016 | 2.5 |
| 14/04/2016 | 2.5 |
| 14/04/2016 | 2.7 |
| 14/04/2016 | 2.9 |
| 14/04/2016 | 3.3 |
| 14/04/2016 | 3.8 |
| 14/04/2016 | 3.9 |
| 14/04/2016 | 4 |
| 14/04/2016 | 4.1 |
| 14/04/2016 | 4.2 |
| 14/04/2016 | 4.2 |
| 14/04/2016 | 4.2 |
| 14/04/2016 | 3.9 |
| 14/04/2016 | 3.9 |
| 14/04/2016 | 3.9 |
| 14/04/2016 | 3.9 |
| 14/04/2016 | 4 |
| 14/04/2016 | 3.9 |
| 14/04/2016 | 3.9 |
| 14/04/2016 | 3.6 |
| 14/04/2016 | 3.3 |
| 14/04/2016 | 2.9 |
| 14/04/2016 | 2.7 |
| 15/04/2016 | 2.6 |
| 15/04/2016 | 2.5 |
| 15/04/2016 | 2.5 |
| 15/04/2016 | 2.6 |
| 15/04/2016 | 2.8 |
| 15/04/2016 | 3.2 |
| 15/04/2016 | 3.6 |
| 15/04/2016 | 3.8 |
| 15/04/2016 | 4 |
| 15/04/2016 | 4.1 |
| 15/04/2016 | 4.1 |
| 15/04/2016 | 4.1 |
| 15/04/2016 | 4.2 |
| 15/04/2016 | 4 |
| 15/04/2016 | 4 |
| 15/04/2016 | 4 |
| 15/04/2016 | 3.9 |
| 15/04/2016 | 3.9 |
| 15/04/2016 | 3.9 |
| 15/04/2016 | 3.7 |
| 15/04/2016 | 3.5 |
| 15/04/2016 | 3.1 |
| 15/04/2016 | 3 |
| 15/04/2016 | 2.6 |
| 16/04/2016 | 2.5 |
| 16/04/2016 | 2.4 |
| 16/04/2016 | 2.5 |
| 16/04/2016 | 2.6 |
| 16/04/2016 | 2.6 |
| 16/04/2016 | 2.7 |
| 16/04/2016 | 2.8 |
| 16/04/2016 | 3.1 |
| 16/04/2016 | 3.2 |
| 16/04/2016 | 3.5 |
| 16/04/2016 | 3.5 |
| 16/04/2016 | 3.5 |
| 16/04/2016 | 3.6 |
| 16/04/2016 | 3.4 |
| 16/04/2016 | 3.4 |
| 16/04/2016 | 3.3 |
| 16/04/2016 | 3.4 |
| 16/04/2016 | 3.4 |
| 16/04/2016 | 3.4 |
| 16/04/2016 | 3.4 |
| 16/04/2016 | 3.3 |
| 16/04/2016 | 3 |
| 16/04/2016 | 2.9 |
| 16/04/2016 | 2.7 |
| 17/04/2016 | 2.6 |
| 17/04/2016 | 2.4 |
| 17/04/2016 | 2.5 |
| 17/04/2016 | 2.5 |
| 17/04/2016 | 2.6 |
| 17/04/2016 | 2.5 |
| 17/04/2016 | 2.7 |
| 17/04/2016 | 2.8 |
| 17/04/2016 | 3 |
| 17/04/2016 | 3.1 |
| 17/04/2016 | 3.4 |
| 17/04/2016 | 3.4 |
| 17/04/2016 | 3.3 |
| 17/04/2016 | 3.2 |
| 17/04/2016 | 3.3 |
| 17/04/2016 | 3.2 |
| 17/04/2016 | 3.3 |
| 17/04/2016 | 3.3 |
| 17/04/2016 | 3.3 |
| 17/04/2016 | 3.3 |
| 17/04/2016 | 3.4 |
| 17/04/2016 | 3.1 |
| 17/04/2016 | 2.9 |
| 17/04/2016 | 2.7 |
| 18/04/2016 | 2.6 |
| 18/04/2016 | 2.6 |
| 18/04/2016 | 2.6 |
| 18/04/2016 | 2.6 |
| 18/04/2016 | 2.8 |
| 18/04/2016 | 3.3 |
| 18/04/2016 | 3.7 |
| 18/04/2016 | 4 |
| 18/04/2016 | 4.1 |
| 18/04/2016 | 4 |
| 18/04/2016 | 4.1 |
| 18/04/2016 | 4.2 |
| 18/04/2016 | 4.2 |
| 18/04/2016 | 4.2 |
| 18/04/2016 | 4 |
| 18/04/2016 | 4 |
| 18/04/2016 | 4.1 |
| 18/04/2016 | 4 |
| 18/04/2016 | 4 |
| 18/04/2016 | 3.9 |
| 18/04/2016 | 3.7 |
| 18/04/2016 | 3.2 |
| 18/04/2016 | 3 |
| 18/04/2016 | 2.6 |
| 19/04/2016 | 2.7 |
| 19/04/2016 | 2.6 |
| 19/04/2016 | 2.6 |
| 19/04/2016 | 2.6 |
| 19/04/2016 | 2.8 |
| 19/04/2016 | 3.4 |
| 19/04/2016 | 3.6 |
| 19/04/2016 | 4 |
| 19/04/2016 | 4.1 |
| 19/04/2016 | 4.2 |
| 19/04/2016 | 4.3 |
| 19/04/2016 | 4.3 |
| 19/04/2016 | 4.1 |
| 19/04/2016 | 4.1 |
| 19/04/2016 | 4.1 |
| 19/04/2016 | 4.2 |
| 19/04/2016 | 4.1 |
| 19/04/2016 | 4.1 |
| 19/04/2016 | 4.1 |
| 19/04/2016 | 4 |
| 19/04/2016 | 3.8 |
| 19/04/2016 | 3.2 |
| 19/04/2016 | 3 |
| 19/04/2016 | 2.7 |
| 20/04/2016 | 2.5 |
| 20/04/2016 | 2.5 |
| 20/04/2016 | 2.7 |
| 20/04/2016 | 2.6 |
| 20/04/2016 | 2.9 |
| 20/04/2016 | 3.5 |
| 20/04/2016 | 3.7 |
| 20/04/2016 | 4.1 |
| 20/04/2016 | 4.2 |
| 20/04/2016 | 4.3 |
| 20/04/2016 | 4.4 |
| 20/04/2016 | 4.3 |
| 20/04/2016 | 4.2 |
| 20/04/2016 | 4.2 |
| 20/04/2016 | 4.2 |
| 20/04/2016 | 4.2 |
| 20/04/2016 | 4.1 |
| 20/04/2016 | 4 |
| 20/04/2016 | 4.1 |
| 20/04/2016 | 4 |
| 20/04/2016 | 3.8 |
| 20/04/2016 | 3.2 |
| 20/04/2016 | 3 |
| 20/04/2016 | 2.7 |
| 21/04/2016 | 2.5 |
| 21/04/2016 | 2.5 |
| 21/04/2016 | 2.6 |
| 21/04/2016 | 2.6 |
| 21/04/2016 | 2.8 |
| 21/04/2016 | 3.4 |
| 21/04/2016 | 3.7 |
| 21/04/2016 | 4 |
| 21/04/2016 | 4.1 |
| 21/04/2016 | 4.2 |
| 21/04/2016 | 4.1 |
| 21/04/2016 | 4.1 |
| 21/04/2016 | 4.1 |
| 21/04/2016 | 4 |
| 21/04/2016 | 4 |
| 21/04/2016 | 4.1 |
| 21/04/2016 | 3.9 |
| 21/04/2016 | 3.9 |
| 21/04/2016 | 4 |
| 21/04/2016 | 3.9 |
| 21/04/2016 | 3.7 |
| 21/04/2016 | 3.2 |
| 21/04/2016 | 3 |
| 21/04/2016 | 2.7 |
| 22/04/2016 | 2.5 |
| 22/04/2016 | 2.5 |
| 22/04/2016 | 2.6 |
| 22/04/2016 | 2.6 |
| 22/04/2016 | 2.8 |
| 22/04/2016 | 3.3 |
| 22/04/2016 | 3.8 |
| 22/04/2016 | 3.9 |
| 22/04/2016 | 4.1 |
| 22/04/2016 | 4.2 |
| 22/04/2016 | 4.3 |
| 22/04/2016 | 4.3 |
| 22/04/2016 | 4.2 |
| 22/04/2016 | 4 |
| 22/04/2016 | 3.9 |
| 22/04/2016 | 4 |
| 22/04/2016 | 4 |
| 22/04/2016 | 3.9 |
| 22/04/2016 | 3.8 |
| 22/04/2016 | 3.7 |
| 22/04/2016 | 3.6 |
| 22/04/2016 | 3.3 |
| 22/04/2016 | 2.9 |
| 22/04/2016 | 2.6 |
| 23/04/2016 | 2.7 |
| 23/04/2016 | 2.6 |
| 23/04/2016 | 2.5 |
| 23/04/2016 | 2.5 |
| 23/04/2016 | 2.5 |
| 23/04/2016 | 2.6 |
| 23/04/2016 | 2.9 |
| 23/04/2016 | 3 |
| 23/04/2016 | 3.4 |
| 23/04/2016 | 3.4 |
| 23/04/2016 | 3.5 |
| 23/04/2016 | 3.7 |
| 23/04/2016 | 3.5 |
| 23/04/2016 | 3.4 |
| 23/04/2016 | 3.4 |
| 23/04/2016 | 3.3 |
| 23/04/2016 | 3.4 |
| 23/04/2016 | 3.4 |
| 23/04/2016 | 3.4 |
| 23/04/2016 | 3.4 |
| 23/04/2016 | 3.4 |
| 23/04/2016 | 3 |
| 23/04/2016 | 2.8 |
| 23/04/2016 | 2.7 |
| 24/04/2016 | 2.6 |
| 24/04/2016 | 2.6 |
| 24/04/2016 | 2.5 |
| 24/04/2016 | 2.5 |
| 24/04/2016 | 2.5 |
| 24/04/2016 | 2.6 |
| 24/04/2016 | 2.6 |
| 24/04/2016 | 2.8 |
| 24/04/2016 | 3 |
| 24/04/2016 | 3.1 |
| 24/04/2016 | 3.3 |
| 24/04/2016 | 3.4 |
| 24/04/2016 | 3.3 |
| 24/04/2016 | 3.2 |
| 24/04/2016 | 3.3 |
| 24/04/2016 | 3.2 |
| 24/04/2016 | 3.3 |
| 24/04/2016 | 3.2 |
| 24/04/2016 | 3.4 |
| 24/04/2016 | 3.3 |
| 24/04/2016 | 3.3 |
| 24/04/2016 | 3.1 |
| 24/04/2016 | 2.9 |
| 24/04/2016 | 2.7 |
| 25/04/2016 | 2.6 |
| 25/04/2016 | 2.6 |
| 25/04/2016 | 2.6 |
| 25/04/2016 | 2.5 |
| 25/04/2016 | 3 |
| 25/04/2016 | 3.4 |
| 25/04/2016 | 3.6 |
| 25/04/2016 | 3.9 |
| 25/04/2016 | 4.1 |
| 25/04/2016 | 4.2 |
| 25/04/2016 | 4.1 |
| 25/04/2016 | 4.2 |
| 25/04/2016 | 4.2 |
| 25/04/2016 | 4.2 |
| 25/04/2016 | 4.2 |
| 25/04/2016 | 4 |
| 25/04/2016 | 4.1 |
| 25/04/2016 | 3.9 |
| 25/04/2016 | 3.9 |
| 25/04/2016 | 3.9 |
| 25/04/2016 | 3.6 |
| 25/04/2016 | 3.3 |
| 25/04/2016 | 2.9 |
| 25/04/2016 | 2.8 |
| 26/04/2016 | 2.7 |
| 26/04/2016 | 2.6 |
| 26/04/2016 | 2.6 |
| 26/04/2016 | 2.8 |
| 26/04/2016 | 3 |
| 26/04/2016 | 3.3 |
| 26/04/2016 | 3.8 |
| 26/04/2016 | 3.9 |
| 26/04/2016 | 4 |
| 26/04/2016 | 4.1 |
| 26/04/2016 | 4.2 |
| 26/04/2016 | 4.3 |
| 26/04/2016 | 4.1 |
| 26/04/2016 | 4.1 |
| 26/04/2016 | 4.1 |
| 26/04/2016 | 4.2 |
| 26/04/2016 | 4.1 |
| 26/04/2016 | 4.1 |
| 26/04/2016 | 4 |
| 26/04/2016 | 4 |
| 26/04/2016 | 3.7 |
| 26/04/2016 | 3.2 |
| 26/04/2016 | 3 |
| 26/04/2016 | 2.7 |
| 27/04/2016 | 2.7 |
| 27/04/2016 | 2.7 |
| 27/04/2016 | 2.6 |
| 27/04/2016 | 2.6 |
| 27/04/2016 | 3 |
| 27/04/2016 | 3.4 |
| 27/04/2016 | 3.7 |
| 27/04/2016 | 4 |
| 27/04/2016 | 4.1 |
| 27/04/2016 | 4.3 |
| 27/04/2016 | 4.4 |
| 27/04/2016 | 4.3 |
| 27/04/2016 | 4.3 |
| 27/04/2016 | 4.2 |
| 27/04/2016 | 4.2 |
| 27/04/2016 | 4.2 |
| 27/04/2016 | 4 |
| 27/04/2016 | 4.1 |
| 27/04/2016 | 4 |
| 27/04/2016 | 4 |
| 27/04/2016 | 3.6 |
| 27/04/2016 | 3.2 |
| 27/04/2016 | 3 |
| 27/04/2016 | 2.7 |
| 28/04/2016 | 2.5 |
| 28/04/2016 | 2.7 |
| 28/04/2016 | 2.6 |
| 28/04/2016 | 2.6 |
| 28/04/2016 | 3 |
| 28/04/2016 | 3.3 |
| 28/04/2016 | 3.8 |
| 28/04/2016 | 3.9 |
| 28/04/2016 | 4 |
| 28/04/2016 | 4.2 |
| 28/04/2016 | 4.1 |
| 28/04/2016 | 4.1 |
| 28/04/2016 | 4.1 |
| 28/04/2016 | 4.1 |
| 28/04/2016 | 4 |
| 28/04/2016 | 3.9 |
| 28/04/2016 | 3.9 |
| 28/04/2016 | 4 |
| 28/04/2016 | 3.9 |
| 28/04/2016 | 3.9 |
| 28/04/2016 | 3.6 |
| 28/04/2016 | 3.2 |
| 28/04/2016 | 3 |
| 28/04/2016 | 2.7 |
| 29/04/2016 | 2.5 |
| 29/04/2016 | 2.7 |
| 29/04/2016 | 2.6 |
| 29/04/2016 | 2.6 |
| 29/04/2016 | 2.9 |
| 29/04/2016 | 3.2 |
| 29/04/2016 | 3.7 |
| 29/04/2016 | 3.9 |
| 29/04/2016 | 4 |
| 29/04/2016 | 4.2 |
| 29/04/2016 | 4.3 |
| 29/04/2016 | 4.3 |
| 29/04/2016 | 4.2 |
| 29/04/2016 | 4 |
| 29/04/2016 | 4 |
| 29/04/2016 | 4 |
| 29/04/2016 | 4 |
| 29/04/2016 | 3.7 |
| 29/04/2016 | 3.8 |
| 29/04/2016 | 3.7 |
| 29/04/2016 | 3.5 |
| 29/04/2016 | 3.3 |
| 29/04/2016 | 2.9 |
| 29/04/2016 | 2.8 |
| 30/04/2016 | 2.7 |
| 30/04/2016 | 2.6 |
| 30/04/2016 | 2.5 |
| 30/04/2016 | 2.5 |
| 30/04/2016 | 2.7 |
| 30/04/2016 | 2.8 |
| 30/04/2016 | 2.9 |
| 30/04/2016 | 3.2 |
| 30/04/2016 | 3.3 |
| 30/04/2016 | 3.4 |
| 30/04/2016 | 3.5 |
| 30/04/2016 | 3.7 |
| 30/04/2016 | 3.5 |
| 30/04/2016 | 3.4 |
| 30/04/2016 | 3.4 |
| 30/04/2016 | 3.3 |
| 30/04/2016 | 3.4 |
| 30/04/2016 | 3.4 |
| 30/04/2016 | 3.4 |
| 30/04/2016 | 3.4 |
| 30/04/2016 | 3.3 |
| 30/04/2016 | 3 |
| 30/04/2016 | 2.8 |
| 30/04/2016 | 2.7 |
| 01/05/2016 | 2.6 |
| 01/05/2016 | 2.6 |
| 01/05/2016 | 2.5 |
| 01/05/2016 | 2.5 |
| 01/05/2016 | 2.5 |
| 01/05/2016 | 2.6 |
| 01/05/2016 | 2.6 |
| 01/05/2016 | 2.8 |
| 01/05/2016 | 2.9 |
| 01/05/2016 | 3.3 |
| 01/05/2016 | 3.3 |
| 01/05/2016 | 3.4 |
| 01/05/2016 | 3.3 |
| 01/05/2016 | 3.2 |
| 01/05/2016 | 3.3 |
| 01/05/2016 | 3.2 |
| 01/05/2016 | 3.2 |
| 01/05/2016 | 3.2 |
| 01/05/2016 | 3.3 |
| 01/05/2016 | 3.4 |
| 01/05/2016 | 3.2 |
| 01/05/2016 | 3.1 |
| 01/05/2016 | 2.9 |
| 01/05/2016 | 2.7 |
| 02/05/2016 | 2.6 |
| 02/05/2016 | 2.6 |
| 02/05/2016 | 2.6 |
| 02/05/2016 | 2.7 |
| 02/05/2016 | 2.9 |
| 02/05/2016 | 3.3 |
| 02/05/2016 | 3.8 |
| 02/05/2016 | 3.9 |
| 02/05/2016 | 4 |
| 02/05/2016 | 4.2 |
| 02/05/2016 | 4.1 |
| 02/05/2016 | 4.2 |
| 02/05/2016 | 4.2 |
| 02/05/2016 | 4.2 |
| 02/05/2016 | 4 |
| 02/05/2016 | 4 |
| 02/05/2016 | 4 |
| 02/05/2016 | 3.9 |
| 02/05/2016 | 3.9 |
| 02/05/2016 | 3.7 |
| 02/05/2016 | 3.7 |
| 02/05/2016 | 3.3 |
| 02/05/2016 | 2.9 |
| 02/05/2016 | 2.8 |
| 03/05/2016 | 2.7 |
| 03/05/2016 | 2.6 |
| 03/05/2016 | 2.6 |
| 03/05/2016 | 2.7 |
| 03/05/2016 | 2.9 |
| 03/05/2016 | 3.3 |
| 03/05/2016 | 3.7 |
| 03/05/2016 | 4.1 |
| 03/05/2016 | 4 |
| 03/05/2016 | 4.1 |
| 03/05/2016 | 4.2 |
| 03/05/2016 | 4.3 |
| 03/05/2016 | 4.1 |
| 03/05/2016 | 4.1 |
| 03/05/2016 | 4.1 |
| 03/05/2016 | 4.2 |
| 03/05/2016 | 4 |
| 03/05/2016 | 4.1 |
| 03/05/2016 | 4 |
| 03/05/2016 | 3.8 |
| 03/05/2016 | 3.5 |
| 03/05/2016 | 3.2 |
| 03/05/2016 | 3 |
| 03/05/2016 | 2.7 |
| 04/05/2016 | 2.7 |
| 04/05/2016 | 2.7 |
| 04/05/2016 | 2.6 |
| 04/05/2016 | 2.8 |
| 04/05/2016 | 2.9 |
| 04/05/2016 | 3.3 |
| 04/05/2016 | 3.8 |
| 04/05/2016 | 4 |
| 04/05/2016 | 4.1 |
| 04/05/2016 | 4.3 |
| 04/05/2016 | 4.4 |
| 04/05/2016 | 4.3 |
| 04/05/2016 | 4.3 |
| 04/05/2016 | 4.2 |
| 04/05/2016 | 4.2 |
| 04/05/2016 | 4.2 |
| 04/05/2016 | 4 |
| 04/05/2016 | 3.9 |
| 04/05/2016 | 4 |
| 04/05/2016 | 3.8 |
| 04/05/2016 | 3.5 |
| 04/05/2016 | 3.2 |
| 04/05/2016 | 3 |
| 04/05/2016 | 2.9 |
| 05/05/2016 | 2.6 |
| 05/05/2016 | 2.5 |
| 05/05/2016 | 2.6 |
| 05/05/2016 | 2.6 |
| 05/05/2016 | 2.6 |
| 05/05/2016 | 2.6 |
| 05/05/2016 | 2.7 |
| 05/05/2016 | 2.9 |
| 05/05/2016 | 3.1 |
| 05/05/2016 | 3.2 |
| 05/05/2016 | 3.4 |
| 05/05/2016 | 3.5 |
| 05/05/2016 | 3.4 |
| 05/05/2016 | 3.3 |
| 05/05/2016 | 3.3 |
| 05/05/2016 | 3.2 |
| 05/05/2016 | 3.2 |
| 05/05/2016 | 3.2 |
| 05/05/2016 | 3.1 |
| 05/05/2016 | 3.2 |
| 05/05/2016 | 3.2 |
| 05/05/2016 | 3 |
| 05/05/2016 | 2.9 |
| 05/05/2016 | 2.9 |
| 06/05/2016 | 2.7 |
| 06/05/2016 | 2.7 |
| 06/05/2016 | 2.6 |
| 06/05/2016 | 2.6 |
| 06/05/2016 | 2.8 |
| 06/05/2016 | 2.9 |
| 06/05/2016 | 3.2 |
| 06/05/2016 | 3.3 |
| 06/05/2016 | 3.6 |
| 06/05/2016 | 3.7 |
| 06/05/2016 | 3.9 |
| 06/05/2016 | 3.9 |
| 06/05/2016 | 3.9 |
| 06/05/2016 | 3.7 |
| 06/05/2016 | 3.7 |
| 06/05/2016 | 3.7 |
| 06/05/2016 | 3.8 |
| 06/05/2016 | 3.8 |
| 06/05/2016 | 3.8 |
| 06/05/2016 | 3.7 |
| 06/05/2016 | 3.6 |
| 06/05/2016 | 3.4 |
| 06/05/2016 | 3.3 |
| 06/05/2016 | 2.8 |
| 07/05/2016 | 2.7 |
| 07/05/2016 | 2.6 |
| 07/05/2016 | 2.5 |
| 07/05/2016 | 2.5 |
| 07/05/2016 | 2.6 |
| 07/05/2016 | 2.7 |
| 07/05/2016 | 2.9 |
| 07/05/2016 | 3.1 |
| 07/05/2016 | 3.3 |
| 07/05/2016 | 3.4 |
| 07/05/2016 | 3.5 |
| 07/05/2016 | 3.7 |
| 07/05/2016 | 3.5 |
| 07/05/2016 | 3.4 |
| 07/05/2016 | 3.4 |
| 07/05/2016 | 3.3 |
| 07/05/2016 | 3.4 |
| 07/05/2016 | 3.3 |
| 07/05/2016 | 3.4 |
| 07/05/2016 | 3.4 |
| 07/05/2016 | 3.2 |
| 07/05/2016 | 3 |
| 07/05/2016 | 2.8 |
| 07/05/2016 | 2.7 |
| 08/05/2016 | 2.6 |
| 08/05/2016 | 2.6 |
| 08/05/2016 | 2.5 |
| 08/05/2016 | 2.4 |
| 08/05/2016 | 2.4 |
| 08/05/2016 | 2.5 |
| 08/05/2016 | 2.6 |
| 08/05/2016 | 2.9 |
| 08/05/2016 | 3.1 |
| 08/05/2016 | 3.3 |
| 08/05/2016 | 3.3 |
| 08/05/2016 | 3.4 |
| 08/05/2016 | 3.3 |
| 08/05/2016 | 3.2 |
| 08/05/2016 | 3.3 |
| 08/05/2016 | 3.2 |
| 08/05/2016 | 3.2 |
| 08/05/2016 | 3.2 |
| 08/05/2016 | 3.3 |
| 08/05/2016 | 3.2 |
| 08/05/2016 | 3.2 |
| 08/05/2016 | 3.1 |
| 08/05/2016 | 2.8 |
| 08/05/2016 | 2.7 |
| 09/05/2016 | 2.6 |
| 09/05/2016 | 2.6 |
| 09/05/2016 | 2.6 |
| 09/05/2016 | 2.7 |
| 09/05/2016 | 2.8 |
| 09/05/2016 | 3.3 |
| 09/05/2016 | 3.7 |
| 09/05/2016 | 4.1 |
| 09/05/2016 | 4 |
| 09/05/2016 | 4.2 |
| 09/05/2016 | 4.1 |
| 09/05/2016 | 4.2 |
| 09/05/2016 | 4.2 |
| 09/05/2016 | 4.2 |
| 09/05/2016 | 4 |
| 09/05/2016 | 4 |
| 09/05/2016 | 4 |
| 09/05/2016 | 4 |
| 09/05/2016 | 3.9 |
| 09/05/2016 | 3.7 |
| 09/05/2016 | 3.5 |
| 09/05/2016 | 3.3 |
| 09/05/2016 | 2.9 |
| 09/05/2016 | 2.8 |
| 10/05/2016 | 2.7 |
| 10/05/2016 | 2.6 |
| 10/05/2016 | 2.6 |
| 10/05/2016 | 2.7 |
| 10/05/2016 | 2.8 |
| 10/05/2016 | 3.4 |
| 10/05/2016 | 3.7 |
| 10/05/2016 | 4 |
| 10/05/2016 | 4.2 |
| 10/05/2016 | 4.1 |
| 10/05/2016 | 4.2 |
| 10/05/2016 | 4.3 |
| 10/05/2016 | 4.1 |
| 10/05/2016 | 4.1 |
| 10/05/2016 | 4.1 |
| 10/05/2016 | 4 |
| 10/05/2016 | 4 |
| 10/05/2016 | 3.9 |
| 10/05/2016 | 4 |
| 10/05/2016 | 3.8 |
| 10/05/2016 | 3.6 |
| 10/05/2016 | 3.2 |
| 10/05/2016 | 3 |
| 10/05/2016 | 2.9 |
| 11/05/2016 | 2.7 |
| 11/05/2016 | 2.7 |
| 11/05/2016 | 2.6 |
| 11/05/2016 | 2.7 |
| 11/05/2016 | 2.8 |
| 11/05/2016 | 3.3 |
| 11/05/2016 | 3.8 |
| 11/05/2016 | 4.1 |
| 11/05/2016 | 4.3 |
| 11/05/2016 | 4.3 |
| 11/05/2016 | 4.4 |
| 11/05/2016 | 4.3 |
| 11/05/2016 | 4.3 |
| 11/05/2016 | 4.2 |
| 11/05/2016 | 4.2 |
| 11/05/2016 | 4 |
| 11/05/2016 | 4 |
| 11/05/2016 | 3.9 |
| 11/05/2016 | 4 |
| 11/05/2016 | 3.8 |
| 11/05/2016 | 3.6 |
| 11/05/2016 | 3.2 |
| 11/05/2016 | 3 |
| 11/05/2016 | 2.7 |
| 12/05/2016 | 2.7 |
| 12/05/2016 | 2.6 |
| 12/05/2016 | 2.6 |
| 12/05/2016 | 2.7 |
| 12/05/2016 | 2.8 |
| 12/05/2016 | 3.4 |
| 12/05/2016 | 3.7 |
| 12/05/2016 | 4 |
| 12/05/2016 | 4.2 |
| 12/05/2016 | 4.2 |
| 12/05/2016 | 4.3 |
| 12/05/2016 | 4.1 |
| 12/05/2016 | 4.1 |
| 12/05/2016 | 4.1 |
| 12/05/2016 | 3.8 |
| 12/05/2016 | 3.8 |
| 12/05/2016 | 3.8 |
| 12/05/2016 | 3.8 |
| 12/05/2016 | 3.9 |
| 12/05/2016 | 3.6 |
| 12/05/2016 | 3.5 |
| 12/05/2016 | 3.2 |
| 12/05/2016 | 3 |
| 12/05/2016 | 2.7 |
| 13/05/2016 | 2.7 |
| 13/05/2016 | 2.6 |
| 13/05/2016 | 2.6 |
| 13/05/2016 | 2.7 |
| 13/05/2016 | 3 |
| 13/05/2016 | 3.3 |
| 13/05/2016 | 3.6 |
| 13/05/2016 | 4 |
| 13/05/2016 | 4.2 |
| 13/05/2016 | 4.2 |
| 13/05/2016 | 4.3 |
| 13/05/2016 | 4.3 |
| 13/05/2016 | 4.2 |
| 13/05/2016 | 4 |
| 13/05/2016 | 4 |
| 13/05/2016 | 3.9 |
| 13/05/2016 | 3.9 |
| 13/05/2016 | 3.8 |
| 13/05/2016 | 3.7 |
| 13/05/2016 | 3.5 |
| 13/05/2016 | 3.4 |
| 13/05/2016 | 3.3 |
| 13/05/2016 | 2.9 |
| 13/05/2016 | 2.8 |
| 14/05/2016 | 2.7 |
| 14/05/2016 | 2.6 |
| 14/05/2016 | 2.5 |
| 14/05/2016 | 2.5 |
| 14/05/2016 | 2.6 |
| 14/05/2016 | 2.7 |
| 14/05/2016 | 2.8 |
| 14/05/2016 | 3.1 |
| 14/05/2016 | 3.3 |
| 14/05/2016 | 3.4 |
| 14/05/2016 | 3.7 |
| 14/05/2016 | 3.7 |
| 14/05/2016 | 3.5 |
| 14/05/2016 | 3.4 |
| 14/05/2016 | 3.4 |
| 14/05/2016 | 3.3 |
| 14/05/2016 | 3.3 |
| 14/05/2016 | 3.3 |
| 14/05/2016 | 3.3 |
| 14/05/2016 | 3.2 |
| 14/05/2016 | 3.3 |
| 14/05/2016 | 3 |
| 14/05/2016 | 2.8 |
| 14/05/2016 | 3 |
| 15/05/2016 | 2.7 |
| 15/05/2016 | 2.6 |
| 15/05/2016 | 2.7 |
| 15/05/2016 | 2.6 |
| 15/05/2016 | 2.6 |
| 15/05/2016 | 2.6 |
| 15/05/2016 | 3.1 |
| 15/05/2016 | 3.3 |
| 15/05/2016 | 3.4 |
| 15/05/2016 | 3.4 |
| 15/05/2016 | 3.5 |
| 15/05/2016 | 3.6 |
| 15/05/2016 | 3.5 |
| 15/05/2016 | 3.4 |
| 15/05/2016 | 3.5 |
| 15/05/2016 | 3.5 |
| 15/05/2016 | 3.5 |
| 15/05/2016 | 3.5 |
| 15/05/2016 | 3.7 |
| 15/05/2016 | 3.8 |
| 15/05/2016 | 3.6 |
| 15/05/2016 | 3.5 |
| 15/05/2016 | 3.2 |
| 15/05/2016 | 3 |
| 16/05/2016 | 2.9 |
| 16/05/2016 | 2.6 |
| 16/05/2016 | 2.7 |
| 16/05/2016 | 2.6 |
| 16/05/2016 | 2.6 |
| 16/05/2016 | 2.8 |
| 16/05/2016 | 3.1 |
| 16/05/2016 | 3.3 |
| 16/05/2016 | 3.4 |
| 16/05/2016 | 3.4 |
| 16/05/2016 | 3.5 |
| 16/05/2016 | 3.6 |
| 16/05/2016 | 3.5 |
| 16/05/2016 | 3.4 |
| 16/05/2016 | 3.5 |
| 16/05/2016 | 3.5 |
| 16/05/2016 | 3.5 |
| 16/05/2016 | 3.5 |
| 16/05/2016 | 3.7 |
| 16/05/2016 | 3.8 |
| 16/05/2016 | 3.6 |
| 16/05/2016 | 3.5 |
| 16/05/2016 | 3.2 |
| 16/05/2016 | 2.8 |
| 17/05/2016 | 2.6 |
| 17/05/2016 | 2.6 |
| 17/05/2016 | 2.5 |
| 17/05/2016 | 2.6 |
| 17/05/2016 | 2.8 |
| 17/05/2016 | 3.2 |
| 17/05/2016 | 3.7 |
| 17/05/2016 | 3.9 |
| 17/05/2016 | 4 |
| 17/05/2016 | 4.1 |
| 17/05/2016 | 4.2 |
| 17/05/2016 | 4.1 |
| 17/05/2016 | 4 |
| 17/05/2016 | 3.9 |
| 17/05/2016 | 3.9 |
| 17/05/2016 | 3.8 |
| 17/05/2016 | 4 |
| 17/05/2016 | 4 |
| 17/05/2016 | 3.8 |
| 17/05/2016 | 3.7 |
| 17/05/2016 | 3.4 |
| 17/05/2016 | 3.2 |
| 17/05/2016 | 2.9 |
| 17/05/2016 | 2.9 |
| 18/05/2016 | 2.7 |
| 18/05/2016 | 2.6 |
| 18/05/2016 | 2.6 |
| 18/05/2016 | 2.7 |
| 18/05/2016 | 3 |
| 18/05/2016 | 3.4 |
| 18/05/2016 | 3.7 |
| 18/05/2016 | 4.1 |
| 18/05/2016 | 4.2 |
| 18/05/2016 | 4.2 |
| 18/05/2016 | 4.4 |
| 18/05/2016 | 4.3 |
| 18/05/2016 | 4.3 |
| 18/05/2016 | 4.2 |
| 18/05/2016 | 4.2 |
| 18/05/2016 | 3.9 |
| 18/05/2016 | 3.9 |
| 18/05/2016 | 3.9 |
| 18/05/2016 | 4 |
| 18/05/2016 | 3.8 |
| 18/05/2016 | 3.4 |
| 18/05/2016 | 3.2 |
| 18/05/2016 | 3 |
| 18/05/2016 | 2.9 |
| 19/05/2016 | 2.7 |
| 19/05/2016 | 2.6 |
| 19/05/2016 | 2.6 |
| 19/05/2016 | 2.7 |
| 19/05/2016 | 2.9 |
| 19/05/2016 | 3.4 |
| 19/05/2016 | 3.7 |
| 19/05/2016 | 4 |
| 19/05/2016 | 4.1 |
| 19/05/2016 | 4.2 |
| 19/05/2016 | 4.3 |
| 19/05/2016 | 4.1 |
| 19/05/2016 | 4.2 |
| 19/05/2016 | 4.1 |
| 19/05/2016 | 3.8 |
| 19/05/2016 | 3.8 |
| 19/05/2016 | 3.8 |
| 19/05/2016 | 3.8 |
| 19/05/2016 | 3.8 |
| 19/05/2016 | 3.6 |
| 19/05/2016 | 3.4 |
| 19/05/2016 | 3.2 |
| 19/05/2016 | 3 |
| 19/05/2016 | 2.7 |
| 20/05/2016 | 2.7 |
| 20/05/2016 | 2.6 |
| 20/05/2016 | 2.6 |
| 20/05/2016 | 2.7 |
| 20/05/2016 | 2.9 |
| 20/05/2016 | 3.3 |
| 20/05/2016 | 3.8 |
| 20/05/2016 | 3.9 |
| 20/05/2016 | 4.2 |
| 20/05/2016 | 4.2 |
| 20/05/2016 | 4.3 |
| 20/05/2016 | 4.3 |
| 20/05/2016 | 4.2 |
| 20/05/2016 | 4 |
| 20/05/2016 | 4 |
| 20/05/2016 | 3.9 |
| 20/05/2016 | 3.8 |
| 20/05/2016 | 3.8 |
| 20/05/2016 | 3.7 |
| 20/05/2016 | 3.5 |
| 20/05/2016 | 3.3 |
| 20/05/2016 | 3.3 |
| 20/05/2016 | 3.1 |
| 20/05/2016 | 2.8 |
| 21/05/2016 | 2.7 |
| 21/05/2016 | 2.6 |
| 21/05/2016 | 2.5 |
| 21/05/2016 | 2.6 |
| 21/05/2016 | 2.5 |
| 21/05/2016 | 2.7 |
| 21/05/2016 | 2.8 |
| 21/05/2016 | 3.1 |
| 21/05/2016 | 3.3 |
| 21/05/2016 | 3.6 |
| 21/05/2016 | 3.7 |
| 21/05/2016 | 3.7 |
| 21/05/2016 | 3.5 |
| 21/05/2016 | 3.4 |
| 21/05/2016 | 3.2 |
| 21/05/2016 | 3.2 |
| 21/05/2016 | 3.3 |
| 21/05/2016 | 3.3 |
| 21/05/2016 | 3.3 |
| 21/05/2016 | 3.3 |
| 21/05/2016 | 3.1 |
| 21/05/2016 | 3 |
| 21/05/2016 | 3 |
| 21/05/2016 | 2.7 |
| 22/05/2016 | 2.6 |
| 22/05/2016 | 2.5 |
| 22/05/2016 | 2.4 |
| 22/05/2016 | 2.6 |
| 22/05/2016 | 2.5 |
| 22/05/2016 | 2.7 |
| 22/05/2016 | 2.7 |
| 22/05/2016 | 2.9 |
| 22/05/2016 | 3.1 |
| 22/05/2016 | 3.3 |
| 22/05/2016 | 3.3 |
| 22/05/2016 | 3.4 |
| 22/05/2016 | 3.3 |
| 22/05/2016 | 3.2 |
| 22/05/2016 | 3.3 |
| 22/05/2016 | 3.2 |
| 22/05/2016 | 3.1 |
| 22/05/2016 | 3.3 |
| 22/05/2016 | 3.3 |
| 22/05/2016 | 3.2 |
| 22/05/2016 | 3.2 |
| 22/05/2016 | 3.1 |
| 22/05/2016 | 2.8 |
| 22/05/2016 | 2.7 |
| 23/05/2016 | 2.6 |
| 23/05/2016 | 2.5 |
| 23/05/2016 | 2.5 |
| 23/05/2016 | 2.6 |
| 23/05/2016 | 2.9 |
| 23/05/2016 | 3.4 |
| 23/05/2016 | 3.8 |
| 23/05/2016 | 4 |
| 23/05/2016 | 4.1 |
| 23/05/2016 | 4.2 |
| 23/05/2016 | 4.3 |
| 23/05/2016 | 4.2 |
| 23/05/2016 | 4.3 |
| 23/05/2016 | 4 |
| 23/05/2016 | 4 |
| 23/05/2016 | 3.9 |
| 23/05/2016 | 3.9 |
| 23/05/2016 | 3.8 |
| 23/05/2016 | 3.8 |
| 23/05/2016 | 3.7 |
| 23/05/2016 | 3.5 |
| 23/05/2016 | 3.3 |
| 23/05/2016 | 2.9 |
| 23/05/2016 | 2.8 |
| 24/05/2016 | 2.6 |
| 24/05/2016 | 2.6 |
| 24/05/2016 | 2.6 |
| 24/05/2016 | 2.7 |
| 24/05/2016 | 2.9 |
| 24/05/2016 | 3.3 |
| 24/05/2016 | 3.8 |
| 24/05/2016 | 3.9 |
| 24/05/2016 | 4.1 |
| 24/05/2016 | 4.3 |
| 24/05/2016 | 4.2 |
| 24/05/2016 | 4.3 |
| 24/05/2016 | 4.1 |
| 24/05/2016 | 4.1 |
| 24/05/2016 | 4.1 |
| 24/05/2016 | 3.9 |
| 24/05/2016 | 3.9 |
| 24/05/2016 | 4 |
| 24/05/2016 | 3.9 |
| 24/05/2016 | 3.8 |
| 24/05/2016 | 3.5 |
| 24/05/2016 | 3.4 |
| 24/05/2016 | 3 |
| 24/05/2016 | 2.9 |
| 25/05/2016 | 2.7 |
| 25/05/2016 | 2.6 |
| 25/05/2016 | 2.6 |
| 25/05/2016 | 2.7 |
| 25/05/2016 | 2.9 |
| 25/05/2016 | 3.4 |
| 25/05/2016 | 3.9 |
| 25/05/2016 | 4 |
| 25/05/2016 | 4.2 |
| 25/05/2016 | 4.2 |
| 25/05/2016 | 4.4 |
| 25/05/2016 | 4.3 |
| 25/05/2016 | 4.3 |
| 25/05/2016 | 4.2 |
| 25/05/2016 | 4 |
| 25/05/2016 | 3.9 |
| 25/05/2016 | 3.9 |
| 25/05/2016 | 3.9 |
| 25/05/2016 | 3.9 |
| 25/05/2016 | 3.8 |
| 25/05/2016 | 3.5 |
| 25/05/2016 | 3.2 |
| 25/05/2016 | 3 |
| 25/05/2016 | 2.9 |
| 26/05/2016 | 2.7 |
| 26/05/2016 | 2.6 |
| 26/05/2016 | 2.6 |
| 26/05/2016 | 2.7 |
| 26/05/2016 | 2.9 |
| 26/05/2016 | 3.3 |
| 26/05/2016 | 3.8 |
| 26/05/2016 | 3.9 |
| 26/05/2016 | 4.1 |
| 26/05/2016 | 4.1 |
| 26/05/2016 | 4.3 |
| 26/05/2016 | 4.1 |
| 26/05/2016 | 4.2 |
| 26/05/2016 | 4.1 |
| 26/05/2016 | 3.9 |
| 26/05/2016 | 3.8 |
| 26/05/2016 | 3.7 |
| 26/05/2016 | 3.8 |
| 26/05/2016 | 3.8 |
| 26/05/2016 | 3.6 |
| 26/05/2016 | 3.4 |
| 26/05/2016 | 3.2 |
| 26/05/2016 | 3 |
| 26/05/2016 | 2.9 |
| 27/05/2016 | 2.7 |
| 27/05/2016 | 2.6 |
| 27/05/2016 | 2.6 |
| 27/05/2016 | 2.7 |
| 27/05/2016 | 2.8 |
| 27/05/2016 | 3.2 |
| 27/05/2016 | 3.7 |
| 27/05/2016 | 4.1 |
| 27/05/2016 | 4.1 |
| 27/05/2016 | 4.2 |
| 27/05/2016 | 4.3 |
| 27/05/2016 | 4.3 |
| 27/05/2016 | 4.2 |
| 27/05/2016 | 4.1 |
| 27/05/2016 | 4 |
| 27/05/2016 | 3.9 |
| 27/05/2016 | 3.8 |
| 27/05/2016 | 3.8 |
| 27/05/2016 | 3.7 |
| 27/05/2016 | 3.6 |
| 27/05/2016 | 3.4 |
| 27/05/2016 | 3.3 |
| 27/05/2016 | 3.1 |
| 27/05/2016 | 2.8 |
| 28/05/2016 | 2.7 |
| 28/05/2016 | 2.6 |
| 28/05/2016 | 2.5 |
| 28/05/2016 | 2.6 |
| 28/05/2016 | 2.7 |
| 28/05/2016 | 2.6 |
| 28/05/2016 | 3 |
| 28/05/2016 | 3 |
| 28/05/2016 | 3.5 |
| 28/05/2016 | 3.6 |
| 28/05/2016 | 3.7 |
| 28/05/2016 | 3.7 |
| 28/05/2016 | 3.6 |
| 28/05/2016 | 3.4 |
| 28/05/2016 | 3.2 |
| 28/05/2016 | 3.2 |
| 28/05/2016 | 3.3 |
| 28/05/2016 | 3.3 |
| 28/05/2016 | 3.3 |
| 28/05/2016 | 3.2 |
| 28/05/2016 | 3.3 |
| 28/05/2016 | 3.2 |
| 28/05/2016 | 3 |
| 28/05/2016 | 2.7 |
| 29/05/2016 | 2.6 |
| 29/05/2016 | 2.5 |
| 29/05/2016 | 2.6 |
| 29/05/2016 | 2.6 |
| 29/05/2016 | 2.5 |
| 29/05/2016 | 2.6 |
| 29/05/2016 | 2.7 |
| 29/05/2016 | 2.8 |
| 29/05/2016 | 3.1 |
| 29/05/2016 | 3.3 |
| 29/05/2016 | 3.4 |
| 29/05/2016 | 3.4 |
| 29/05/2016 | 3.4 |
| 29/05/2016 | 3.3 |
| 29/05/2016 | 3.3 |
| 29/05/2016 | 3.2 |
| 29/05/2016 | 3.1 |
| 29/05/2016 | 3.3 |
| 29/05/2016 | 3.3 |
| 29/05/2016 | 3.2 |
| 29/05/2016 | 3.2 |
| 29/05/2016 | 3.1 |
| 29/05/2016 | 2.9 |
| 29/05/2016 | 2.7 |
| 30/05/2016 | 2.6 |
| 30/05/2016 | 2.6 |
| 30/05/2016 | 2.5 |
| 30/05/2016 | 2.6 |
| 30/05/2016 | 2.9 |
| 30/05/2016 | 3.4 |
| 30/05/2016 | 3.8 |
| 30/05/2016 | 3.9 |
| 30/05/2016 | 4.1 |
| 30/05/2016 | 4.2 |
| 30/05/2016 | 4.3 |
| 30/05/2016 | 4.2 |
| 30/05/2016 | 4.3 |
| 30/05/2016 | 4.1 |
| 30/05/2016 | 4.1 |
| 30/05/2016 | 4 |
| 30/05/2016 | 3.9 |
| 30/05/2016 | 3.8 |
| 30/05/2016 | 3.8 |
| 30/05/2016 | 3.6 |
| 30/05/2016 | 3.4 |
| 30/05/2016 | 3.3 |
| 30/05/2016 | 2.9 |
| 30/05/2016 | 2.9 |
| 31/05/2016 | 2.7 |
| 31/05/2016 | 2.6 |
| 31/05/2016 | 2.6 |
| 31/05/2016 | 2.7 |
| 31/05/2016 | 2.9 |
| 31/05/2016 | 3.3 |
| 31/05/2016 | 3.8 |
| 31/05/2016 | 4.1 |
| 31/05/2016 | 4.1 |
| 31/05/2016 | 4.3 |
| 31/05/2016 | 4.3 |
| 31/05/2016 | 4.3 |
| 31/05/2016 | 4.2 |
| 31/05/2016 | 4.1 |
| 31/05/2016 | 4.1 |
| 31/05/2016 | 4 |
| 31/05/2016 | 3.9 |
| 31/05/2016 | 4 |
| 31/05/2016 | 3.9 |
| 31/05/2016 | 3.8 |
| 31/05/2016 | 3.5 |
| 31/05/2016 | 3.4 |
| 31/05/2016 | 3 |
| 31/05/2016 | 2.9 |
| 01/06/2016 | 2.7 |
| 01/06/2016 | 2.7 |
| 01/06/2016 | 2.6 |
| 01/06/2016 | 2.7 |
| 01/06/2016 | 2.9 |
| 01/06/2016 | 3.4 |
| 01/06/2016 | 3.9 |
| 01/06/2016 | 4 |
| 01/06/2016 | 4.2 |
| 01/06/2016 | 4.3 |
| 01/06/2016 | 4.4 |
| 01/06/2016 | 4.3 |
| 01/06/2016 | 4.3 |
| 01/06/2016 | 4.3 |
| 01/06/2016 | 4.3 |
| 01/06/2016 | 4 |
| 01/06/2016 | 3.9 |
| 01/06/2016 | 4 |
| 01/06/2016 | 4 |
| 01/06/2016 | 3.8 |
| 01/06/2016 | 3.5 |
| 01/06/2016 | 3.2 |
| 01/06/2016 | 3 |
| 01/06/2016 | 2.9 |
| 02/06/2016 | 2.7 |
| 02/06/2016 | 2.7 |
| 02/06/2016 | 2.6 |
| 02/06/2016 | 2.7 |
| 02/06/2016 | 2.9 |
| 02/06/2016 | 3.3 |
| 02/06/2016 | 3.8 |
| 02/06/2016 | 4 |
| 02/06/2016 | 4.1 |
| 02/06/2016 | 4.2 |
| 02/06/2016 | 4.3 |
| 02/06/2016 | 4.2 |
| 02/06/2016 | 4.2 |
| 02/06/2016 | 4.2 |
| 02/06/2016 | 3.9 |
| 02/06/2016 | 3.9 |
| 02/06/2016 | 3.8 |
| 02/06/2016 | 3.9 |
| 02/06/2016 | 3.9 |
| 02/06/2016 | 3.7 |
| 02/06/2016 | 3.4 |
| 02/06/2016 | 3.2 |
| 02/06/2016 | 3 |
| 02/06/2016 | 2.7 |
| 03/06/2016 | 2.7 |
| 03/06/2016 | 2.7 |
| 03/06/2016 | 2.6 |
| 03/06/2016 | 2.7 |
| 03/06/2016 | 2.8 |
| 03/06/2016 | 3.2 |
| 03/06/2016 | 3.7 |
| 03/06/2016 | 3.9 |
| 03/06/2016 | 4.2 |
| 03/06/2016 | 4.2 |
| 03/06/2016 | 4.3 |
| 03/06/2016 | 4.3 |
| 03/06/2016 | 4.3 |
| 03/06/2016 | 4.1 |
| 03/06/2016 | 4.1 |
| 03/06/2016 | 4 |
| 03/06/2016 | 3.9 |
| 03/06/2016 | 3.9 |
| 03/06/2016 | 3.7 |
| 03/06/2016 | 3.6 |
| 03/06/2016 | 3.4 |
| 03/06/2016 | 3.3 |
| 03/06/2016 | 3.1 |
| 03/06/2016 | 2.8 |
| 04/06/2016 | 2.7 |
| 04/06/2016 | 2.6 |
| 04/06/2016 | 2.5 |
| 04/06/2016 | 2.6 |
| 04/06/2016 | 2.7 |
| 04/06/2016 | 2.6 |
| 04/06/2016 | 3 |
| 04/06/2016 | 3.1 |
| 04/06/2016 | 3.5 |
| 04/06/2016 | 3.6 |
| 04/06/2016 | 3.7 |
| 04/06/2016 | 3.7 |
| 04/06/2016 | 3.6 |
| 04/06/2016 | 3.5 |
| 04/06/2016 | 3.3 |
| 04/06/2016 | 3.3 |
| 04/06/2016 | 3.4 |
| 04/06/2016 | 3.4 |
| 04/06/2016 | 3.3 |
| 04/06/2016 | 3.4 |
| 04/06/2016 | 3.3 |
| 04/06/2016 | 3.2 |
| 04/06/2016 | 3.1 |
| 04/06/2016 | 2.7 |
| 05/06/2016 | 2.6 |
| 05/06/2016 | 2.6 |
| 05/06/2016 | 2.5 |
| 05/06/2016 | 2.6 |
| 05/06/2016 | 2.5 |
| 05/06/2016 | 2.6 |
| 05/06/2016 | 2.7 |
| 05/06/2016 | 2.9 |
| 05/06/2016 | 3.1 |
| 05/06/2016 | 3.3 |
| 05/06/2016 | 3.4 |
| 05/06/2016 | 3.4 |
| 05/06/2016 | 3.4 |
| 05/06/2016 | 3.3 |
| 05/06/2016 | 3.4 |
| 05/06/2016 | 3.3 |
| 05/06/2016 | 3.2 |
| 05/06/2016 | 3.3 |
| 05/06/2016 | 3.3 |
| 05/06/2016 | 3.2 |
| 05/06/2016 | 3.1 |
| 05/06/2016 | 3.1 |
| 05/06/2016 | 2.9 |
| 05/06/2016 | 2.8 |
| 06/06/2016 | 2.6 |
| 06/06/2016 | 2.6 |
| 06/06/2016 | 2.6 |
| 06/06/2016 | 2.6 |
| 06/06/2016 | 2.9 |
| 06/06/2016 | 3.4 |
| 06/06/2016 | 3.8 |
| 06/06/2016 | 4 |
| 06/06/2016 | 4.2 |
| 06/06/2016 | 4.2 |
| 06/06/2016 | 4.4 |
| 06/06/2016 | 4.3 |
| 06/06/2016 | 4.4 |
| 06/06/2016 | 4.1 |
| 06/06/2016 | 4.1 |
| 06/06/2016 | 4.1 |
| 06/06/2016 | 4 |
| 06/06/2016 | 4.1 |
| 06/06/2016 | 3.9 |
| 06/06/2016 | 3.7 |
| 06/06/2016 | 3.6 |
| 06/06/2016 | 3.4 |
| 06/06/2016 | 3 |
| 06/06/2016 | 2.9 |
| 07/06/2016 | 2.7 |
| 07/06/2016 | 2.6 |
| 07/06/2016 | 2.6 |
| 07/06/2016 | 2.7 |
| 07/06/2016 | 2.9 |
| 07/06/2016 | 3.3 |
| 07/06/2016 | 3.8 |
| 07/06/2016 | 4.1 |
| 07/06/2016 | 4.1 |
| 07/06/2016 | 4.4 |
| 07/06/2016 | 4.3 |
| 07/06/2016 | 4.4 |
| 07/06/2016 | 4.3 |
| 07/06/2016 | 4.2 |
| 07/06/2016 | 4.2 |
| 07/06/2016 | 4.1 |
| 07/06/2016 | 4 |
| 07/06/2016 | 4 |
| 07/06/2016 | 4 |
| 07/06/2016 | 3.8 |
| 07/06/2016 | 3.5 |
| 07/06/2016 | 3.4 |
| 07/06/2016 | 3.1 |
| 07/06/2016 | 3 |
| 08/06/2016 | 2.8 |
| 08/06/2016 | 2.7 |
| 08/06/2016 | 2.6 |
| 08/06/2016 | 2.7 |
| 08/06/2016 | 2.9 |
| 08/06/2016 | 3.4 |
| 08/06/2016 | 3.9 |
| 08/06/2016 | 4.1 |
| 08/06/2016 | 4.3 |
| 08/06/2016 | 4.3 |
| 08/06/2016 | 4.5 |
| 08/06/2016 | 4.5 |
| 08/06/2016 | 4.4 |
| 08/06/2016 | 4.4 |
| 08/06/2016 | 4.3 |
| 08/06/2016 | 4.1 |
| 08/06/2016 | 4 |
| 08/06/2016 | 4 |
| 08/06/2016 | 4 |
| 08/06/2016 | 3.8 |
| 08/06/2016 | 3.5 |
| 08/06/2016 | 3.5 |
| 08/06/2016 | 3.1 |
| 08/06/2016 | 3 |
| 09/06/2016 | 2.8 |
| 09/06/2016 | 2.7 |
| 09/06/2016 | 2.6 |
| 09/06/2016 | 2.7 |
| 09/06/2016 | 2.9 |
| 09/06/2016 | 3.3 |
| 09/06/2016 | 3.8 |
| 09/06/2016 | 4 |
| 09/06/2016 | 4.2 |
| 09/06/2016 | 4.2 |
| 09/06/2016 | 4.4 |
| 09/06/2016 | 4.2 |
| 09/06/2016 | 4.3 |
| 09/06/2016 | 4.2 |
| 09/06/2016 | 4 |
| 09/06/2016 | 4 |
| 09/06/2016 | 3.9 |
| 09/06/2016 | 3.9 |
| 09/06/2016 | 3.9 |
| 09/06/2016 | 3.7 |
| 09/06/2016 | 3.4 |
| 09/06/2016 | 3.4 |
| 09/06/2016 | 3.1 |
| 09/06/2016 | 2.8 |
| 10/06/2016 | 2.8 |
| 10/06/2016 | 2.7 |
| 10/06/2016 | 2.6 |
| 10/06/2016 | 2.7 |
| 10/06/2016 | 2.9 |
| 10/06/2016 | 3.3 |
| 10/06/2016 | 3.7 |
| 10/06/2016 | 3.9 |
| 10/06/2016 | 4.2 |
| 10/06/2016 | 4.2 |
| 10/06/2016 | 4.4 |
| 10/06/2016 | 4.4 |
| 10/06/2016 | 4.3 |
| 10/06/2016 | 4.2 |
| 10/06/2016 | 4.1 |
| 10/06/2016 | 4.1 |
| 10/06/2016 | 4 |
| 10/06/2016 | 3.9 |
| 10/06/2016 | 3.8 |
| 10/06/2016 | 3.7 |
| 10/06/2016 | 3.4 |
| 10/06/2016 | 3.3 |
| 10/06/2016 | 3.2 |
| 10/06/2016 | 2.9 |
| 11/06/2016 | 2.7 |
| 11/06/2016 | 2.6 |
| 11/06/2016 | 2.5 |
| 11/06/2016 | 2.7 |
| 11/06/2016 | 2.7 |
| 11/06/2016 | 2.6 |
| 11/06/2016 | 2.8 |
| 11/06/2016 | 3.1 |
| 11/06/2016 | 3.5 |
| 11/06/2016 | 3.7 |
| 11/06/2016 | 3.8 |
| 11/06/2016 | 3.8 |
| 11/06/2016 | 3.7 |
| 11/06/2016 | 3.6 |
| 11/06/2016 | 3.6 |
| 11/06/2016 | 3.4 |
| 11/06/2016 | 3.4 |
| 11/06/2016 | 3.4 |
| 11/06/2016 | 3.6 |
| 11/06/2016 | 3.4 |
| 11/06/2016 | 3.3 |
| 11/06/2016 | 3.3 |
| 11/06/2016 | 3.1 |
| 11/06/2016 | 2.8 |
| 12/06/2016 | 2.7 |
| 12/06/2016 | 2.6 |
| 12/06/2016 | 2.5 |
| 12/06/2016 | 2.6 |
| 12/06/2016 | 2.5 |
| 12/06/2016 | 2.5 |
| 12/06/2016 | 2.7 |
| 12/06/2016 | 2.9 |
| 12/06/2016 | 3.1 |
| 12/06/2016 | 3.3 |
| 12/06/2016 | 3.4 |
| 12/06/2016 | 3.5 |
| 12/06/2016 | 3.4 |
| 12/06/2016 | 3.4 |
| 12/06/2016 | 3.4 |
| 12/06/2016 | 3.3 |
| 12/06/2016 | 3.3 |
| 12/06/2016 | 3.4 |
| 12/06/2016 | 3.3 |
| 12/06/2016 | 3.3 |
| 12/06/2016 | 3.1 |
| 12/06/2016 | 3.2 |
| 12/06/2016 | 3 |
| 12/06/2016 | 2.8 |
| 13/06/2016 | 2.7 |
| 13/06/2016 | 2.6 |
| 13/06/2016 | 2.6 |
| 13/06/2016 | 2.7 |
| 13/06/2016 | 2.9 |
| 13/06/2016 | 3.4 |
| 13/06/2016 | 3.6 |
| 13/06/2016 | 4 |
| 13/06/2016 | 4.2 |
| 13/06/2016 | 4.3 |
| 13/06/2016 | 4.4 |
| 13/06/2016 | 4.3 |
| 13/06/2016 | 4.4 |
| 13/06/2016 | 4.2 |
| 13/06/2016 | 4.2 |
| 13/06/2016 | 4.2 |
| 13/06/2016 | 4.1 |
| 13/06/2016 | 4.1 |
| 13/06/2016 | 4.1 |
| 13/06/2016 | 3.7 |
| 13/06/2016 | 3.6 |
| 13/06/2016 | 3.4 |
| 13/06/2016 | 3.1 |
| 13/06/2016 | 3 |
| 14/06/2016 | 2.7 |
| 14/06/2016 | 2.7 |
| 14/06/2016 | 2.6 |
| 14/06/2016 | 2.7 |
| 14/06/2016 | 2.9 |
| 14/06/2016 | 3.3 |
| 14/06/2016 | 3.8 |
| 14/06/2016 | 4 |
| 14/06/2016 | 4.2 |
| 14/06/2016 | 4.4 |
| 14/06/2016 | 4.4 |
| 14/06/2016 | 4.4 |
| 14/06/2016 | 4.3 |
| 14/06/2016 | 4.3 |
| 14/06/2016 | 4.3 |
| 14/06/2016 | 4.2 |
| 14/06/2016 | 4.1 |
| 14/06/2016 | 4.1 |
| 14/06/2016 | 4 |
| 14/06/2016 | 3.9 |
| 14/06/2016 | 3.7 |
| 14/06/2016 | 3.5 |
| 14/06/2016 | 3.1 |
| 14/06/2016 | 3.1 |
| 15/06/2016 | 2.8 |
| 15/06/2016 | 2.7 |
| 15/06/2016 | 2.7 |
| 15/06/2016 | 2.7 |
| 15/06/2016 | 2.9 |
| 15/06/2016 | 3.4 |
| 15/06/2016 | 3.9 |
| 15/06/2016 | 4.1 |
| 15/06/2016 | 4.3 |
| 15/06/2016 | 4.3 |
| 15/06/2016 | 4.5 |
| 15/06/2016 | 4.6 |
| 15/06/2016 | 4.5 |
| 15/06/2016 | 4.4 |
| 15/06/2016 | 4.4 |
| 15/06/2016 | 4.2 |
| 15/06/2016 | 4.1 |
| 15/06/2016 | 4.1 |
| 15/06/2016 | 4.1 |
| 15/06/2016 | 3.9 |
| 15/06/2016 | 3.7 |
| 15/06/2016 | 3.5 |
| 15/06/2016 | 3.2 |
| 15/06/2016 | 2.9 |
| 16/06/2016 | 2.8 |
| 16/06/2016 | 2.7 |
| 16/06/2016 | 2.7 |
| 16/06/2016 | 2.7 |
| 16/06/2016 | 2.9 |
| 16/06/2016 | 3.3 |
| 16/06/2016 | 3.8 |
| 16/06/2016 | 4 |
| 16/06/2016 | 4.2 |
| 16/06/2016 | 4.2 |
| 16/06/2016 | 4.4 |
| 16/06/2016 | 4.3 |
| 16/06/2016 | 4.3 |
| 16/06/2016 | 4.3 |
| 16/06/2016 | 4.1 |
| 16/06/2016 | 4.1 |
| 16/06/2016 | 4 |
| 16/06/2016 | 4 |
| 16/06/2016 | 3.9 |
| 16/06/2016 | 3.8 |
| 16/06/2016 | 3.6 |
| 16/06/2016 | 3.5 |
| 16/06/2016 | 3.2 |
| 16/06/2016 | 2.9 |
| 17/06/2016 | 2.8 |
| 17/06/2016 | 2.7 |
| 17/06/2016 | 2.7 |
| 17/06/2016 | 2.7 |
| 17/06/2016 | 2.9 |
| 17/06/2016 | 3.3 |
| 17/06/2016 | 3.7 |
| 17/06/2016 | 4 |
| 17/06/2016 | 4.2 |
| 17/06/2016 | 4.5 |
| 17/06/2016 | 4.4 |
| 17/06/2016 | 4.4 |
| 17/06/2016 | 4.4 |
| 17/06/2016 | 4.3 |
| 17/06/2016 | 4.2 |
| 17/06/2016 | 4.2 |
| 17/06/2016 | 4.1 |
| 17/06/2016 | 4 |
| 17/06/2016 | 4 |
| 17/06/2016 | 3.7 |
| 17/06/2016 | 3.6 |
| 17/06/2016 | 3.4 |
| 17/06/2016 | 3.3 |
| 17/06/2016 | 3 |
| 18/06/2016 | 2.8 |
| 18/06/2016 | 2.7 |
| 18/06/2016 | 2.5 |
| 18/06/2016 | 2.7 |
| 18/06/2016 | 2.7 |
| 18/06/2016 | 2.7 |
| 18/06/2016 | 2.8 |
| 18/06/2016 | 3.1 |
| 18/06/2016 | 3.5 |
| 18/06/2016 | 3.7 |
| 18/06/2016 | 3.8 |
| 18/06/2016 | 3.8 |
| 18/06/2016 | 3.7 |
| 18/06/2016 | 3.6 |
| 18/06/2016 | 3.6 |
| 18/06/2016 | 3.5 |
| 18/06/2016 | 3.5 |
| 18/06/2016 | 3.5 |
| 18/06/2016 | 3.6 |
| 18/06/2016 | 3.5 |
| 18/06/2016 | 3.2 |
| 18/06/2016 | 3.3 |
| 18/06/2016 | 3.2 |
| 18/06/2016 | 2.8 |
| 19/06/2016 | 2.7 |
| 19/06/2016 | 2.6 |
| 19/06/2016 | 2.5 |
| 19/06/2016 | 2.6 |
| 19/06/2016 | 2.5 |
| 19/06/2016 | 2.5 |
| 19/06/2016 | 2.7 |
| 19/06/2016 | 2.9 |
| 19/06/2016 | 3.1 |
| 19/06/2016 | 3.4 |
| 19/06/2016 | 3.5 |
| 19/06/2016 | 3.5 |
| 19/06/2016 | 3.5 |
| 19/06/2016 | 3.4 |
| 19/06/2016 | 3.5 |
| 19/06/2016 | 3.4 |
| 19/06/2016 | 3.4 |
| 19/06/2016 | 3.4 |
| 19/06/2016 | 3.4 |
| 19/06/2016 | 3.3 |
| 19/06/2016 | 3.3 |
| 19/06/2016 | 3.2 |
| 19/06/2016 | 3 |
| 19/06/2016 | 2.9 |
| 20/06/2016 | 2.7 |
| 20/06/2016 | 2.7 |
| 20/06/2016 | 2.6 |
| 20/06/2016 | 2.7 |
| 20/06/2016 | 2.9 |
| 20/06/2016 | 3.4 |
| 20/06/2016 | 3.6 |
| 20/06/2016 | 4 |
| 20/06/2016 | 4.2 |
| 20/06/2016 | 4.3 |
| 20/06/2016 | 4.5 |
| 20/06/2016 | 4.4 |
| 20/06/2016 | 4.5 |
| 20/06/2016 | 4.3 |
| 20/06/2016 | 4.3 |
| 20/06/2016 | 4.3 |
| 20/06/2016 | 4.2 |
| 20/06/2016 | 4.2 |
| 20/06/2016 | 4.2 |
| 20/06/2016 | 3.8 |
| 20/06/2016 | 3.6 |
| 20/06/2016 | 3.4 |
| 20/06/2016 | 3.1 |
| 20/06/2016 | 3 |
| 21/06/2016 | 2.8 |
| 21/06/2016 | 2.7 |
| 21/06/2016 | 2.6 |
| 21/06/2016 | 2.7 |
| 21/06/2016 | 2.9 |
| 21/06/2016 | 3.3 |
| 21/06/2016 | 3.8 |
| 21/06/2016 | 4 |
| 21/06/2016 | 4.2 |
| 21/06/2016 | 4.4 |
| 21/06/2016 | 4.4 |
| 21/06/2016 | 4.5 |
| 21/06/2016 | 4.4 |
| 21/06/2016 | 4.4 |
| 21/06/2016 | 4.4 |
| 21/06/2016 | 4.4 |
| 21/06/2016 | 4.2 |
| 21/06/2016 | 4.1 |
| 21/06/2016 | 4.3 |
| 21/06/2016 | 3.9 |
| 21/06/2016 | 3.7 |
| 21/06/2016 | 3.5 |
| 21/06/2016 | 3.2 |
| 21/06/2016 | 3.1 |
| 22/06/2016 | 2.9 |
| 22/06/2016 | 2.8 |
| 22/06/2016 | 2.7 |
| 22/06/2016 | 2.7 |
| 22/06/2016 | 2.9 |
| 22/06/2016 | 3.4 |
| 22/06/2016 | 3.7 |
| 22/06/2016 | 4.1 |
| 22/06/2016 | 4.3 |
| 22/06/2016 | 4.6 |
| 22/06/2016 | 4.6 |
| 22/06/2016 | 4.7 |
| 22/06/2016 | 4.5 |
| 22/06/2016 | 4.5 |
| 22/06/2016 | 4.5 |
| 22/06/2016 | 4.3 |
| 22/06/2016 | 4.2 |
| 22/06/2016 | 4.1 |
| 22/06/2016 | 4.3 |
| 22/06/2016 | 3.9 |
| 22/06/2016 | 3.7 |
| 22/06/2016 | 3.5 |
| 22/06/2016 | 3.2 |
| 22/06/2016 | 2.9 |
| 23/06/2016 | 2.9 |
| 23/06/2016 | 2.8 |
| 23/06/2016 | 2.7 |
| 23/06/2016 | 2.7 |
| 23/06/2016 | 2.9 |
| 23/06/2016 | 3.4 |
| 23/06/2016 | 3.7 |
| 23/06/2016 | 4 |
| 23/06/2016 | 4.2 |
| 23/06/2016 | 4.3 |
| 23/06/2016 | 4.5 |
| 23/06/2016 | 4.3 |
| 23/06/2016 | 4.4 |
| 23/06/2016 | 4.4 |
| 23/06/2016 | 4.2 |
| 23/06/2016 | 4.2 |
| 23/06/2016 | 4.1 |
| 23/06/2016 | 4 |
| 23/06/2016 | 4 |
| 23/06/2016 | 3.8 |
| 23/06/2016 | 3.6 |
| 23/06/2016 | 3.5 |
| 23/06/2016 | 3.2 |
| 23/06/2016 | 2.9 |
| 24/06/2016 | 2.9 |
| 24/06/2016 | 2.8 |
| 24/06/2016 | 2.7 |
| 24/06/2016 | 2.7 |
| 24/06/2016 | 2.9 |
| 24/06/2016 | 3.3 |
| 24/06/2016 | 3.7 |
| 24/06/2016 | 4 |
| 24/06/2016 | 4.2 |
| 24/06/2016 | 4.5 |
| 24/06/2016 | 4.5 |
| 24/06/2016 | 4.5 |
| 24/06/2016 | 4.4 |
| 24/06/2016 | 4.3 |
| 24/06/2016 | 4.3 |
| 24/06/2016 | 4.3 |
| 24/06/2016 | 4.2 |
| 24/06/2016 | 4 |
| 24/06/2016 | 4.1 |
| 24/06/2016 | 3.8 |
| 24/06/2016 | 3.6 |
| 24/06/2016 | 3.4 |
| 24/06/2016 | 3.3 |
| 24/06/2016 | 3 |
| 25/06/2016 | 2.8 |
| 25/06/2016 | 2.7 |
| 25/06/2016 | 2.6 |
| 25/06/2016 | 2.7 |
| 25/06/2016 | 2.5 |
| 25/06/2016 | 2.7 |
| 25/06/2016 | 2.8 |
| 25/06/2016 | 3.1 |
| 25/06/2016 | 3.5 |
| 25/06/2016 | 3.7 |
| 25/06/2016 | 3.8 |
| 25/06/2016 | 3.9 |
| 25/06/2016 | 3.8 |
| 25/06/2016 | 3.7 |
| 25/06/2016 | 3.7 |
| 25/06/2016 | 3.6 |
| 25/06/2016 | 3.6 |
| 25/06/2016 | 3.5 |
| 25/06/2016 | 3.7 |
| 25/06/2016 | 3.5 |
| 25/06/2016 | 3.4 |
| 25/06/2016 | 3.3 |
| 25/06/2016 | 3.2 |
| 25/06/2016 | 2.9 |
| 26/06/2016 | 2.8 |
| 26/06/2016 | 2.7 |
| 26/06/2016 | 2.5 |
| 26/06/2016 | 2.6 |
| 26/06/2016 | 2.5 |
| 26/06/2016 | 2.5 |
| 26/06/2016 | 2.7 |
| 26/06/2016 | 2.9 |
| 26/06/2016 | 3.1 |
| 26/06/2016 | 3.4 |
| 26/06/2016 | 3.5 |
| 26/06/2016 | 3.5 |
| 26/06/2016 | 3.5 |
| 26/06/2016 | 3.5 |
| 26/06/2016 | 3.5 |
| 26/06/2016 | 3.5 |
| 26/06/2016 | 3.4 |
| 26/06/2016 | 3.4 |
| 26/06/2016 | 3.4 |
| 26/06/2016 | 3.3 |
| 26/06/2016 | 3.3 |
| 26/06/2016 | 3.2 |
| 26/06/2016 | 3.1 |
| 26/06/2016 | 2.9 |
| 27/06/2016 | 2.7 |
| 27/06/2016 | 2.7 |
| 27/06/2016 | 2.6 |
| 27/06/2016 | 2.7 |
| 27/06/2016 | 2.9 |
| 27/06/2016 | 3.2 |
| 27/06/2016 | 3.6 |
| 27/06/2016 | 4 |
| 27/06/2016 | 4.2 |
| 27/06/2016 | 4.3 |
| 27/06/2016 | 4.5 |
| 27/06/2016 | 4.4 |
| 27/06/2016 | 4.5 |
| 27/06/2016 | 4.6 |
| 27/06/2016 | 4.4 |
| 27/06/2016 | 4.4 |
| 27/06/2016 | 4.3 |
| 27/06/2016 | 4.2 |
| 27/06/2016 | 4.2 |
| 27/06/2016 | 3.8 |
| 27/06/2016 | 3.8 |
| 27/06/2016 | 3.5 |
| 27/06/2016 | 3.2 |
| 27/06/2016 | 3.1 |
| 28/06/2016 | 2.8 |
| 28/06/2016 | 2.7 |
| 28/06/2016 | 2.7 |
| 28/06/2016 | 2.7 |
| 28/06/2016 | 2.9 |
| 28/06/2016 | 3.4 |
| 28/06/2016 | 3.8 |
| 28/06/2016 | 4 |
| 28/06/2016 | 4.2 |
| 28/06/2016 | 4.5 |
| 28/06/2016 | 4.5 |
| 28/06/2016 | 4.5 |
| 28/06/2016 | 4.4 |
| 28/06/2016 | 4.4 |
| 28/06/2016 | 4.5 |
| 28/06/2016 | 4.5 |
| 28/06/2016 | 4.3 |
| 28/06/2016 | 4.4 |
| 28/06/2016 | 4.3 |
| 28/06/2016 | 4 |
| 28/06/2016 | 3.7 |
| 28/06/2016 | 3.5 |
| 28/06/2016 | 3.2 |
| 28/06/2016 | 3.2 |
| 29/06/2016 | 2.9 |
| 29/06/2016 | 2.8 |
| 29/06/2016 | 2.7 |
| 29/06/2016 | 2.8 |
| 29/06/2016 | 3 |
| 29/06/2016 | 3.4 |
| 29/06/2016 | 3.7 |
| 29/06/2016 | 4.1 |
| 29/06/2016 | 4.3 |
| 29/06/2016 | 4.6 |
| 29/06/2016 | 4.6 |
| 29/06/2016 | 4.7 |
| 29/06/2016 | 4.6 |
| 29/06/2016 | 4.6 |
| 29/06/2016 | 4.6 |
| 29/06/2016 | 4.6 |
| 29/06/2016 | 4.3 |
| 29/06/2016 | 4.2 |
| 29/06/2016 | 4.4 |
| 29/06/2016 | 4 |
| 29/06/2016 | 3.7 |
| 29/06/2016 | 3.6 |
| 29/06/2016 | 3.3 |
| 29/06/2016 | 3 |
| 30/06/2016 | 2.9 |
| 30/06/2016 | 2.8 |
| 30/06/2016 | 2.7 |
| 30/06/2016 | 2.8 |
| 30/06/2016 | 2.9 |
| 30/06/2016 | 3.4 |
| 30/06/2016 | 3.7 |
| 30/06/2016 | 4 |
| 30/06/2016 | 4.2 |
| 30/06/2016 | 4.3 |
| 30/06/2016 | 4.5 |
| 30/06/2016 | 4.4 |
| 30/06/2016 | 4.5 |
| 30/06/2016 | 4.4 |
| 30/06/2016 | 4.4 |
| 30/06/2016 | 4.2 |
| 30/06/2016 | 4.2 |
| 30/06/2016 | 4.1 |
| 30/06/2016 | 4.2 |
| 30/06/2016 | 3.9 |
| 30/06/2016 | 3.6 |
| 30/06/2016 | 3.6 |
| 30/06/2016 | 3.3 |
| 30/06/2016 | 3 |
| 01/07/2016 | 2.9 |
| 01/07/2016 | 2.8 |
| 01/07/2016 | 2.7 |
| 01/07/2016 | 2.7 |
| 01/07/2016 | 2.9 |
| 01/07/2016 | 3.3 |
| 01/07/2016 | 3.7 |
| 01/07/2016 | 4 |
| 01/07/2016 | 4.3 |
| 01/07/2016 | 4.5 |
| 01/07/2016 | 4.5 |
| 01/07/2016 | 4.5 |
| 01/07/2016 | 4.5 |
| 01/07/2016 | 4.4 |
| 01/07/2016 | 4.4 |
| 01/07/2016 | 4.4 |
| 01/07/2016 | 4.3 |
| 01/07/2016 | 4.1 |
| 01/07/2016 | 4.1 |
| 01/07/2016 | 3.8 |
| 01/07/2016 | 3.6 |
| 01/07/2016 | 3.5 |
| 01/07/2016 | 3.4 |
| 01/07/2016 | 3.1 |
| 02/07/2016 | 2.9 |
| 02/07/2016 | 2.7 |
| 02/07/2016 | 2.6 |
| 02/07/2016 | 2.7 |
| 02/07/2016 | 2.5 |
| 02/07/2016 | 2.7 |
| 02/07/2016 | 2.8 |
| 02/07/2016 | 3.1 |
| 02/07/2016 | 3.6 |
| 02/07/2016 | 3.8 |
| 02/07/2016 | 3.9 |
| 02/07/2016 | 3.9 |
| 02/07/2016 | 3.8 |
| 02/07/2016 | 3.7 |
| 02/07/2016 | 3.8 |
| 02/07/2016 | 3.6 |
| 02/07/2016 | 3.7 |
| 02/07/2016 | 3.7 |
| 02/07/2016 | 3.7 |
| 02/07/2016 | 3.6 |
| 02/07/2016 | 3.4 |
| 02/07/2016 | 3.4 |
| 02/07/2016 | 3.3 |
| 02/07/2016 | 2.9 |
| 03/07/2016 | 2.8 |
| 03/07/2016 | 2.7 |
| 03/07/2016 | 2.6 |
| 03/07/2016 | 2.6 |
| 03/07/2016 | 2.5 |
| 03/07/2016 | 2.5 |
| 03/07/2016 | 2.7 |
| 03/07/2016 | 2.9 |
| 03/07/2016 | 3.1 |
| 03/07/2016 | 3.4 |
| 03/07/2016 | 3.5 |
| 03/07/2016 | 3.5 |
| 03/07/2016 | 3.6 |
| 03/07/2016 | 3.5 |
| 03/07/2016 | 3.6 |
| 03/07/2016 | 3.5 |
| 03/07/2016 | 3.5 |
| 03/07/2016 | 3.5 |
| 03/07/2016 | 3.4 |
| 03/07/2016 | 3.4 |
| 03/07/2016 | 3.3 |
| 03/07/2016 | 3.3 |
| 03/07/2016 | 3.1 |
| 03/07/2016 | 2.9 |
| 04/07/2016 | 2.8 |
| 04/07/2016 | 2.7 |
| 04/07/2016 | 2.6 |
| 04/07/2016 | 2.7 |
| 04/07/2016 | 2.9 |
| 04/07/2016 | 3.2 |
| 04/07/2016 | 3.6 |
| 04/07/2016 | 4 |
| 04/07/2016 | 4.2 |
| 04/07/2016 | 4.3 |
| 04/07/2016 | 4.5 |
| 04/07/2016 | 4.4 |
| 04/07/2016 | 4.6 |
| 04/07/2016 | 4.6 |
| 04/07/2016 | 4.4 |
| 04/07/2016 | 4.4 |
| 04/07/2016 | 4.4 |
| 04/07/2016 | 4.2 |
| 04/07/2016 | 4.2 |
| 04/07/2016 | 3.9 |
| 04/07/2016 | 3.8 |
| 04/07/2016 | 3.5 |
| 04/07/2016 | 3.2 |
| 04/07/2016 | 3.1 |
| 05/07/2016 | 2.8 |
| 05/07/2016 | 2.7 |
| 05/07/2016 | 2.7 |
| 05/07/2016 | 2.7 |
| 05/07/2016 | 2.9 |
| 05/07/2016 | 3.4 |
| 05/07/2016 | 3.8 |
| 05/07/2016 | 4 |
| 05/07/2016 | 4.2 |
| 05/07/2016 | 4.4 |
| 05/07/2016 | 4.4 |
| 05/07/2016 | 4.5 |
| 05/07/2016 | 4.4 |
| 05/07/2016 | 4.4 |
| 05/07/2016 | 4.5 |
| 05/07/2016 | 4.5 |
| 05/07/2016 | 4.3 |
| 05/07/2016 | 4.4 |
| 05/07/2016 | 4.3 |
| 05/07/2016 | 4 |
| 05/07/2016 | 3.7 |
| 05/07/2016 | 3.5 |
| 05/07/2016 | 3.2 |
| 05/07/2016 | 2.9 |
| 06/07/2016 | 2.9 |
| 06/07/2016 | 2.8 |
| 06/07/2016 | 2.7 |
| 06/07/2016 | 2.8 |
| 06/07/2016 | 3 |
| 06/07/2016 | 3.4 |
| 06/07/2016 | 3.7 |
| 06/07/2016 | 4.1 |
| 06/07/2016 | 4.3 |
| 06/07/2016 | 4.6 |
| 06/07/2016 | 4.6 |
| 06/07/2016 | 4.7 |
| 06/07/2016 | 4.5 |
| 06/07/2016 | 4.5 |
| 06/07/2016 | 4.5 |
| 06/07/2016 | 4.5 |
| 06/07/2016 | 4.3 |
| 06/07/2016 | 4.2 |
| 06/07/2016 | 4.3 |
| 06/07/2016 | 4 |
| 06/07/2016 | 3.7 |
| 06/07/2016 | 3.6 |
| 06/07/2016 | 3.2 |
| 06/07/2016 | 2.9 |
| 07/07/2016 | 2.9 |
| 07/07/2016 | 2.8 |
| 07/07/2016 | 2.7 |
| 07/07/2016 | 2.8 |
| 07/07/2016 | 3 |
| 07/07/2016 | 3.4 |
| 07/07/2016 | 3.6 |
| 07/07/2016 | 4 |
| 07/07/2016 | 4.2 |
| 07/07/2016 | 4.3 |
| 07/07/2016 | 4.4 |
| 07/07/2016 | 4.3 |
| 07/07/2016 | 4.4 |
| 07/07/2016 | 4.4 |
| 07/07/2016 | 4.4 |
| 07/07/2016 | 4.2 |
| 07/07/2016 | 4.1 |
| 07/07/2016 | 4 |
| 07/07/2016 | 4.2 |
| 07/07/2016 | 3.9 |
| 07/07/2016 | 3.7 |
| 07/07/2016 | 3.5 |
| 07/07/2016 | 3.2 |
| 07/07/2016 | 2.9 |
| 08/07/2016 | 2.9 |
| 08/07/2016 | 2.8 |
| 08/07/2016 | 2.7 |
| 08/07/2016 | 2.7 |
| 08/07/2016 | 2.9 |
| 08/07/2016 | 3.3 |
| 08/07/2016 | 3.7 |
| 08/07/2016 | 3.9 |
| 08/07/2016 | 4.2 |
| 08/07/2016 | 4.5 |
| 08/07/2016 | 4.4 |
| 08/07/2016 | 4.5 |
| 08/07/2016 | 4.4 |
| 08/07/2016 | 4.3 |
| 08/07/2016 | 4.3 |
| 08/07/2016 | 4.3 |
| 08/07/2016 | 4.2 |
| 08/07/2016 | 4 |
| 08/07/2016 | 4 |
| 08/07/2016 | 3.8 |
| 08/07/2016 | 3.6 |
| 08/07/2016 | 3.4 |
| 08/07/2016 | 3.3 |
| 08/07/2016 | 3 |
| 09/07/2016 | 2.8 |
| 09/07/2016 | 2.7 |
| 09/07/2016 | 2.6 |
| 09/07/2016 | 2.5 |
| 09/07/2016 | 2.5 |
| 09/07/2016 | 2.7 |
| 09/07/2016 | 2.8 |
| 09/07/2016 | 3.1 |
| 09/07/2016 | 3.5 |
| 09/07/2016 | 3.7 |
| 09/07/2016 | 3.8 |
| 09/07/2016 | 3.8 |
| 09/07/2016 | 3.7 |
| 09/07/2016 | 3.6 |
| 09/07/2016 | 3.7 |
| 09/07/2016 | 3.6 |
| 09/07/2016 | 3.6 |
| 09/07/2016 | 3.7 |
| 09/07/2016 | 3.6 |
| 09/07/2016 | 3.6 |
| 09/07/2016 | 3.5 |
| 09/07/2016 | 3.3 |
| 09/07/2016 | 3.2 |
| 09/07/2016 | 2.9 |
| 10/07/2016 | 2.8 |
| 10/07/2016 | 2.7 |
| 10/07/2016 | 2.5 |
| 10/07/2016 | 2.5 |
| 10/07/2016 | 2.6 |
| 10/07/2016 | 2.5 |
| 10/07/2016 | 2.7 |
| 10/07/2016 | 2.9 |
| 10/07/2016 | 3.1 |
| 10/07/2016 | 3.3 |
| 10/07/2016 | 3.4 |
| 10/07/2016 | 3.5 |
| 10/07/2016 | 3.5 |
| 10/07/2016 | 3.4 |
| 10/07/2016 | 3.5 |
| 10/07/2016 | 3.5 |
| 10/07/2016 | 3.4 |
| 10/07/2016 | 3.4 |
| 10/07/2016 | 3.5 |
| 10/07/2016 | 3.4 |
| 10/07/2016 | 3.4 |
| 10/07/2016 | 3.2 |
| 10/07/2016 | 3.2 |
| 10/07/2016 | 2.9 |
| 11/07/2016 | 2.7 |
| 11/07/2016 | 2.7 |
| 11/07/2016 | 2.6 |
| 11/07/2016 | 2.7 |
| 11/07/2016 | 3 |
| 11/07/2016 | 3.4 |
| 11/07/2016 | 3.6 |
| 11/07/2016 | 4 |
| 11/07/2016 | 4.2 |
| 11/07/2016 | 4.2 |
| 11/07/2016 | 4.4 |
| 11/07/2016 | 4.3 |
| 11/07/2016 | 4.5 |
| 11/07/2016 | 4.5 |
| 11/07/2016 | 4.3 |
| 11/07/2016 | 4.3 |
| 11/07/2016 | 4.3 |
| 11/07/2016 | 4.2 |
| 11/07/2016 | 4.1 |
| 11/07/2016 | 3.8 |
| 11/07/2016 | 3.7 |
| 11/07/2016 | 3.4 |
| 11/07/2016 | 3.3 |
| 11/07/2016 | 3 |
| 12/07/2016 | 2.8 |
| 12/07/2016 | 2.7 |
| 12/07/2016 | 2.7 |
| 12/07/2016 | 2.7 |
| 12/07/2016 | 3 |
| 12/07/2016 | 3.4 |
| 12/07/2016 | 3.8 |
| 12/07/2016 | 4.1 |
| 12/07/2016 | 4.1 |
| 12/07/2016 | 4.4 |
| 12/07/2016 | 4.3 |
| 12/07/2016 | 4.4 |
| 12/07/2016 | 4.3 |
| 12/07/2016 | 4.3 |
| 12/07/2016 | 4.4 |
| 12/07/2016 | 4.5 |
| 12/07/2016 | 4.2 |
| 12/07/2016 | 4.3 |
| 12/07/2016 | 4.2 |
| 12/07/2016 | 4 |
| 12/07/2016 | 3.8 |
| 12/07/2016 | 3.5 |
| 12/07/2016 | 3.1 |
| 12/07/2016 | 3.1 |
| 13/07/2016 | 2.9 |
| 13/07/2016 | 2.8 |
| 13/07/2016 | 2.7 |
| 13/07/2016 | 2.8 |
| 13/07/2016 | 3 |
| 13/07/2016 | 3.4 |
| 13/07/2016 | 3.9 |
| 13/07/2016 | 4 |
| 13/07/2016 | 4.2 |
| 13/07/2016 | 4.5 |
| 13/07/2016 | 4.5 |
| 13/07/2016 | 4.6 |
| 13/07/2016 | 4.5 |
| 13/07/2016 | 4.5 |
| 13/07/2016 | 4.5 |
| 13/07/2016 | 4.5 |
| 13/07/2016 | 4.2 |
| 13/07/2016 | 4.3 |
| 13/07/2016 | 4.2 |
| 13/07/2016 | 4 |
| 13/07/2016 | 3.8 |
| 13/07/2016 | 3.5 |
| 13/07/2016 | 3.2 |
| 13/07/2016 | 2.9 |
| 14/07/2016 | 2.9 |
| 14/07/2016 | 2.8 |
| 14/07/2016 | 2.7 |
| 14/07/2016 | 2.8 |
| 14/07/2016 | 3 |
| 14/07/2016 | 3.4 |
| 14/07/2016 | 3.8 |
| 14/07/2016 | 3.9 |
| 14/07/2016 | 4.1 |
| 14/07/2016 | 4.4 |
| 14/07/2016 | 4.4 |
| 14/07/2016 | 4.2 |
| 14/07/2016 | 4.3 |
| 14/07/2016 | 4.3 |
| 14/07/2016 | 4.3 |
| 14/07/2016 | 4.1 |
| 14/07/2016 | 4 |
| 14/07/2016 | 4.2 |
| 14/07/2016 | 4.1 |
| 14/07/2016 | 3.9 |
| 14/07/2016 | 3.7 |
| 14/07/2016 | 3.4 |
| 14/07/2016 | 3.1 |
| 14/07/2016 | 2.9 |
| 15/07/2016 | 2.8 |
| 15/07/2016 | 2.8 |
| 15/07/2016 | 2.7 |
| 15/07/2016 | 2.8 |
| 15/07/2016 | 3 |
| 15/07/2016 | 3.3 |
| 15/07/2016 | 3.7 |
| 15/07/2016 | 4.1 |
| 15/07/2016 | 4.1 |
| 15/07/2016 | 4.4 |
| 15/07/2016 | 4.3 |
| 15/07/2016 | 4.4 |
| 15/07/2016 | 4.3 |
| 15/07/2016 | 4.3 |
| 15/07/2016 | 4.2 |
| 15/07/2016 | 4.2 |
| 15/07/2016 | 4.1 |
| 15/07/2016 | 3.9 |
| 15/07/2016 | 4 |
| 15/07/2016 | 3.8 |
| 15/07/2016 | 3.5 |
| 15/07/2016 | 3.3 |
| 15/07/2016 | 3.2 |
| 15/07/2016 | 2.9 |
| 16/07/2016 | 2.8 |
| 16/07/2016 | 2.7 |
| 16/07/2016 | 2.6 |
| 16/07/2016 | 2.5 |
| 16/07/2016 | 2.6 |
| 16/07/2016 | 2.7 |
| 16/07/2016 | 3 |
| 16/07/2016 | 3 |
| 16/07/2016 | 3.5 |
| 16/07/2016 | 3.6 |
| 16/07/2016 | 3.7 |
| 16/07/2016 | 3.7 |
| 16/07/2016 | 3.7 |
| 16/07/2016 | 3.6 |
| 16/07/2016 | 3.6 |
| 16/07/2016 | 3.5 |
| 16/07/2016 | 3.5 |
| 16/07/2016 | 3.6 |
| 16/07/2016 | 3.5 |
| 16/07/2016 | 3.3 |
| 16/07/2016 | 3.3 |
| 16/07/2016 | 3.2 |
| 16/07/2016 | 3.1 |
| 16/07/2016 | 2.8 |
| 17/07/2016 | 2.7 |
| 17/07/2016 | 2.7 |
| 17/07/2016 | 2.5 |
| 17/07/2016 | 2.5 |
| 17/07/2016 | 2.6 |
| 17/07/2016 | 2.5 |
| 17/07/2016 | 2.7 |
| 17/07/2016 | 2.8 |
| 17/07/2016 | 3 |
| 17/07/2016 | 3.3 |
| 17/07/2016 | 3.4 |
| 17/07/2016 | 3.4 |
| 17/07/2016 | 3.4 |
| 17/07/2016 | 3.4 |
| 17/07/2016 | 3.5 |
| 17/07/2016 | 3.4 |
| 17/07/2016 | 3.3 |
| 17/07/2016 | 3.3 |
| 17/07/2016 | 3.5 |
| 17/07/2016 | 3.3 |
| 17/07/2016 | 3.2 |
| 17/07/2016 | 3.1 |
| 17/07/2016 | 3.1 |
| 17/07/2016 | 2.8 |
| 18/07/2016 | 2.7 |
| 18/07/2016 | 2.7 |
| 18/07/2016 | 2.6 |
| 18/07/2016 | 2.7 |
| 18/07/2016 | 2.8 |
| 18/07/2016 | 3.4 |
| 18/07/2016 | 3.8 |
| 18/07/2016 | 3.9 |
| 18/07/2016 | 4.1 |
| 18/07/2016 | 4.1 |
| 18/07/2016 | 4.3 |
| 18/07/2016 | 4.3 |
| 18/07/2016 | 4.4 |
| 18/07/2016 | 4.4 |
| 18/07/2016 | 4.3 |
| 18/07/2016 | 4.2 |
| 18/07/2016 | 4.2 |
| 18/07/2016 | 4.1 |
| 18/07/2016 | 4 |
| 18/07/2016 | 3.8 |
| 18/07/2016 | 3.7 |
| 18/07/2016 | 3.3 |
| 18/07/2016 | 3.2 |
| 18/07/2016 | 3 |
| 19/07/2016 | 2.8 |
| 19/07/2016 | 2.7 |
| 19/07/2016 | 2.7 |
| 19/07/2016 | 2.8 |
| 19/07/2016 | 3 |
| 19/07/2016 | 3.4 |
| 19/07/2016 | 3.8 |
| 19/07/2016 | 4.1 |
| 19/07/2016 | 4.1 |
| 19/07/2016 | 4.3 |
| 19/07/2016 | 4.2 |
| 19/07/2016 | 4.3 |
| 19/07/2016 | 4.2 |
| 19/07/2016 | 4.3 |
| 19/07/2016 | 4.3 |
| 19/07/2016 | 4.4 |
| 19/07/2016 | 4.1 |
| 19/07/2016 | 4.2 |
| 19/07/2016 | 4.1 |
| 19/07/2016 | 3.9 |
| 19/07/2016 | 3.6 |
| 19/07/2016 | 3.4 |
| 19/07/2016 | 3.1 |
| 19/07/2016 | 3 |
| 20/07/2016 | 2.8 |
| 20/07/2016 | 2.7 |
| 20/07/2016 | 2.7 |
| 20/07/2016 | 2.8 |
| 20/07/2016 | 2.9 |
| 20/07/2016 | 3.2 |
| 20/07/2016 | 3.7 |
| 20/07/2016 | 3.9 |
| 20/07/2016 | 4.2 |
| 20/07/2016 | 4.4 |
| 20/07/2016 | 4.4 |
| 20/07/2016 | 4.2 |
| 20/07/2016 | 4.3 |
| 20/07/2016 | 4.2 |
| 20/07/2016 | 4.2 |
| 20/07/2016 | 4.2 |
| 20/07/2016 | 4.2 |
| 20/07/2016 | 4 |
| 20/07/2016 | 4 |
| 20/07/2016 | 3.8 |
| 20/07/2016 | 3.5 |
| 20/07/2016 | 3.3 |
| 20/07/2016 | 3 |
| 20/07/2016 | 2.8 |
| 21/07/2016 | 2.8 |
| 21/07/2016 | 2.7 |
| 21/07/2016 | 2.7 |
| 21/07/2016 | 2.7 |
| 21/07/2016 | 2.9 |
| 21/07/2016 | 3.2 |
| 21/07/2016 | 3.7 |
| 21/07/2016 | 3.8 |
| 21/07/2016 | 4.1 |
| 21/07/2016 | 4.3 |
| 21/07/2016 | 4.3 |
| 21/07/2016 | 4.1 |
| 21/07/2016 | 4.1 |
| 21/07/2016 | 4.1 |
| 21/07/2016 | 4.1 |
| 21/07/2016 | 3.9 |
| 21/07/2016 | 4 |
| 21/07/2016 | 3.9 |
| 21/07/2016 | 3.8 |
| 21/07/2016 | 3.5 |
| 21/07/2016 | 3.5 |
| 21/07/2016 | 3.2 |
| 21/07/2016 | 3 |
| 21/07/2016 | 2.8 |
| 22/07/2016 | 2.8 |
| 22/07/2016 | 2.7 |
| 22/07/2016 | 2.7 |
| 22/07/2016 | 2.7 |
| 22/07/2016 | 2.9 |
| 22/07/2016 | 3.1 |
| 22/07/2016 | 3.6 |
| 22/07/2016 | 3.8 |
| 22/07/2016 | 4.1 |
| 22/07/2016 | 4.3 |
| 22/07/2016 | 4.2 |
| 22/07/2016 | 4.2 |
| 22/07/2016 | 4.2 |
| 22/07/2016 | 4 |
| 22/07/2016 | 4 |
| 22/07/2016 | 4 |
| 22/07/2016 | 3.9 |
| 22/07/2016 | 3.9 |
| 22/07/2016 | 3.7 |
| 22/07/2016 | 3.4 |
| 22/07/2016 | 3.4 |
| 22/07/2016 | 3.1 |
| 22/07/2016 | 3.1 |
| 22/07/2016 | 2.9 |
| 23/07/2016 | 2.8 |
| 23/07/2016 | 2.7 |
| 23/07/2016 | 2.5 |
| 23/07/2016 | 2.7 |
| 23/07/2016 | 2.7 |
| 23/07/2016 | 2.6 |
| 23/07/2016 | 2.8 |
| 23/07/2016 | 3 |
| 23/07/2016 | 3.3 |
| 23/07/2016 | 3.5 |
| 23/07/2016 | 3.5 |
| 23/07/2016 | 3.5 |
| 23/07/2016 | 3.3 |
| 23/07/2016 | 3.4 |
| 23/07/2016 | 3.3 |
| 23/07/2016 | 3.3 |
| 23/07/2016 | 3.4 |
| 23/07/2016 | 3.4 |
| 23/07/2016 | 3.4 |
| 23/07/2016 | 3.2 |
| 23/07/2016 | 3.1 |
| 23/07/2016 | 3.1 |
| 23/07/2016 | 3 |
| 23/07/2016 | 2.7 |
| 24/07/2016 | 2.7 |
| 24/07/2016 | 2.6 |
| 24/07/2016 | 2.5 |
| 24/07/2016 | 2.6 |
| 24/07/2016 | 2.5 |
| 24/07/2016 | 2.4 |
| 24/07/2016 | 2.5 |
| 24/07/2016 | 2.7 |
| 24/07/2016 | 3 |
| 24/07/2016 | 3.2 |
| 24/07/2016 | 3.3 |
| 24/07/2016 | 3.3 |
| 24/07/2016 | 3.3 |
| 24/07/2016 | 3.2 |
| 24/07/2016 | 3.3 |
| 24/07/2016 | 3.3 |
| 24/07/2016 | 3.2 |
| 24/07/2016 | 3.2 |
| 24/07/2016 | 3.1 |
| 24/07/2016 | 3.2 |
| 24/07/2016 | 3.2 |
| 24/07/2016 | 3.1 |
| 24/07/2016 | 3 |
| 24/07/2016 | 2.8 |
| 25/07/2016 | 2.7 |
| 25/07/2016 | 2.6 |
| 25/07/2016 | 2.6 |
| 25/07/2016 | 2.7 |
| 25/07/2016 | 2.9 |
| 25/07/2016 | 3.2 |
| 25/07/2016 | 3.7 |
| 25/07/2016 | 3.8 |
| 25/07/2016 | 4.1 |
| 25/07/2016 | 4 |
| 25/07/2016 | 4.2 |
| 25/07/2016 | 4.1 |
| 25/07/2016 | 4.2 |
| 25/07/2016 | 4 |
| 25/07/2016 | 4 |
| 25/07/2016 | 4 |
| 25/07/2016 | 3.9 |
| 25/07/2016 | 3.9 |
| 25/07/2016 | 3.8 |
| 25/07/2016 | 3.7 |
| 25/07/2016 | 3.5 |
| 25/07/2016 | 3.1 |
| 25/07/2016 | 3.1 |
| 25/07/2016 | 2.9 |
| 26/07/2016 | 2.7 |
| 26/07/2016 | 2.7 |
| 26/07/2016 | 2.6 |
| 26/07/2016 | 2.7 |
| 26/07/2016 | 2.9 |
| 26/07/2016 | 3.2 |
| 26/07/2016 | 3.6 |
| 26/07/2016 | 4 |
| 26/07/2016 | 4.1 |
| 26/07/2016 | 4.2 |
| 26/07/2016 | 4.1 |
| 26/07/2016 | 4.2 |
| 26/07/2016 | 4.1 |
| 26/07/2016 | 4 |
| 26/07/2016 | 4 |
| 26/07/2016 | 4.1 |
| 26/07/2016 | 4.1 |
| 26/07/2016 | 4 |
| 26/07/2016 | 3.9 |
| 26/07/2016 | 3.6 |
| 26/07/2016 | 3.6 |
| 26/07/2016 | 3.2 |
| 26/07/2016 | 3.1 |
| 26/07/2016 | 3 |
| 27/07/2016 | 2.8 |
| 27/07/2016 | 2.7 |
| 27/07/2016 | 2.7 |
| 27/07/2016 | 2.8 |
| 27/07/2016 | 3 |
| 27/07/2016 | 3.2 |
| 27/07/2016 | 3.7 |
| 27/07/2016 | 3.9 |
| 27/07/2016 | 4.2 |
| 27/07/2016 | 4.3 |
| 27/07/2016 | 4.3 |
| 27/07/2016 | 4.1 |
| 27/07/2016 | 4.2 |
| 27/07/2016 | 4.1 |
| 27/07/2016 | 4.1 |
| 27/07/2016 | 4.1 |
| 27/07/2016 | 4.1 |
| 27/07/2016 | 4 |
| 27/07/2016 | 3.9 |
| 27/07/2016 | 3.6 |
| 27/07/2016 | 3.6 |
| 27/07/2016 | 3.2 |
| 27/07/2016 | 2.9 |
| 27/07/2016 | 2.8 |
| 28/07/2016 | 2.8 |
| 28/07/2016 | 2.7 |
| 28/07/2016 | 2.7 |
| 28/07/2016 | 2.8 |
| 28/07/2016 | 2.9 |
| 28/07/2016 | 3.2 |
| 28/07/2016 | 3.7 |
| 28/07/2016 | 3.8 |
| 28/07/2016 | 4.1 |
| 28/07/2016 | 4.2 |
| 28/07/2016 | 4.2 |
| 28/07/2016 | 4 |
| 28/07/2016 | 4 |
| 28/07/2016 | 4 |
| 28/07/2016 | 4 |
| 28/07/2016 | 3.8 |
| 28/07/2016 | 3.9 |
| 28/07/2016 | 3.8 |
| 28/07/2016 | 3.7 |
| 28/07/2016 | 3.5 |
| 28/07/2016 | 3.3 |
| 28/07/2016 | 3.2 |
| 28/07/2016 | 2.9 |
| 28/07/2016 | 2.7 |
| 29/07/2016 | 2.8 |
| 29/07/2016 | 2.7 |
| 29/07/2016 | 2.6 |
| 29/07/2016 | 2.7 |
| 29/07/2016 | 2.9 |
| 29/07/2016 | 3.1 |
| 29/07/2016 | 3.5 |
| 29/07/2016 | 3.9 |
| 29/07/2016 | 4.1 |
| 29/07/2016 | 4.2 |
| 29/07/2016 | 4.1 |
| 29/07/2016 | 4.1 |
| 29/07/2016 | 4.1 |
| 29/07/2016 | 3.9 |
| 29/07/2016 | 3.9 |
| 29/07/2016 | 3.9 |
| 29/07/2016 | 3.8 |
| 29/07/2016 | 3.8 |
| 29/07/2016 | 3.6 |
| 29/07/2016 | 3.4 |
| 29/07/2016 | 3.3 |
| 29/07/2016 | 3.1 |
| 29/07/2016 | 3 |
| 29/07/2016 | 2.8 |
| 30/07/2016 | 2.7 |
| 30/07/2016 | 2.7 |
| 30/07/2016 | 2.5 |
| 30/07/2016 | 2.5 |
| 30/07/2016 | 2.5 |
| 30/07/2016 | 2.6 |
| 30/07/2016 | 2.7 |
| 30/07/2016 | 3 |
| 30/07/2016 | 3.3 |
| 30/07/2016 | 3.5 |
| 30/07/2016 | 3.4 |
| 30/07/2016 | 3.4 |
| 30/07/2016 | 3.3 |
| 30/07/2016 | 3.4 |
| 30/07/2016 | 3.2 |
| 30/07/2016 | 3.3 |
| 30/07/2016 | 3.3 |
| 30/07/2016 | 3.4 |
| 30/07/2016 | 3.3 |
| 30/07/2016 | 3.2 |
| 30/07/2016 | 3.2 |
| 30/07/2016 | 3 |
| 30/07/2016 | 2.9 |
| 30/07/2016 | 2.7 |
| 31/07/2016 | 2.7 |
| 31/07/2016 | 2.6 |
| 31/07/2016 | 2.5 |
| 31/07/2016 | 2.5 |
| 31/07/2016 | 2.5 |
| 31/07/2016 | 2.4 |
| 31/07/2016 | 2.5 |
| 31/07/2016 | 2.7 |
| 31/07/2016 | 2.9 |
| 31/07/2016 | 3.2 |
| 31/07/2016 | 3.3 |
| 31/07/2016 | 3.3 |
| 31/07/2016 | 3.3 |
| 31/07/2016 | 3.2 |
| 31/07/2016 | 3.3 |
| 31/07/2016 | 3.2 |
| 31/07/2016 | 3.1 |
| 31/07/2016 | 3.1 |
| 31/07/2016 | 3 |
| 31/07/2016 | 3 |
| 31/07/2016 | 3.1 |
| 31/07/2016 | 3.1 |
| 31/07/2016 | 2.9 |
| 31/07/2016 | 2.7 |
| 01/08/2016 | 2.6 |
| 01/08/2016 | 2.6 |
| 01/08/2016 | 2.6 |
| 01/08/2016 | 2.7 |
| 01/08/2016 | 2.9 |
| 01/08/2016 | 3.2 |
| 01/08/2016 | 3.6 |
| 01/08/2016 | 3.8 |
| 01/08/2016 | 4 |
| 01/08/2016 | 3.9 |
| 01/08/2016 | 4.1 |
| 01/08/2016 | 4 |
| 01/08/2016 | 4.1 |
| 01/08/2016 | 3.9 |
| 01/08/2016 | 3.9 |
| 01/08/2016 | 3.9 |
| 01/08/2016 | 3.8 |
| 01/08/2016 | 3.8 |
| 01/08/2016 | 3.7 |
| 01/08/2016 | 3.4 |
| 01/08/2016 | 3.3 |
| 01/08/2016 | 3.1 |
| 01/08/2016 | 3 |
| 01/08/2016 | 2.8 |
| 02/08/2016 | 2.7 |
| 02/08/2016 | 2.7 |
| 02/08/2016 | 2.6 |
| 02/08/2016 | 2.7 |
| 02/08/2016 | 2.9 |
| 02/08/2016 | 3.2 |
| 02/08/2016 | 3.6 |
| 02/08/2016 | 3.9 |
| 02/08/2016 | 4 |
| 02/08/2016 | 4.1 |
| 02/08/2016 | 4.1 |
| 02/08/2016 | 4.1 |
| 02/08/2016 | 4 |
| 02/08/2016 | 3.9 |
| 02/08/2016 | 4 |
| 02/08/2016 | 4.1 |
| 02/08/2016 | 4 |
| 02/08/2016 | 3.9 |
| 02/08/2016 | 3.8 |
| 02/08/2016 | 3.6 |
| 02/08/2016 | 3.4 |
| 02/08/2016 | 3.1 |
| 02/08/2016 | 3.1 |
| 02/08/2016 | 2.9 |
| 03/08/2016 | 2.8 |
| 03/08/2016 | 2.7 |
| 03/08/2016 | 2.7 |
| 03/08/2016 | 2.8 |
| 03/08/2016 | 3 |
| 03/08/2016 | 3.2 |
| 03/08/2016 | 3.7 |
| 03/08/2016 | 4 |
| 03/08/2016 | 4.1 |
| 03/08/2016 | 4.2 |
| 03/08/2016 | 4.2 |
| 03/08/2016 | 4.1 |
| 03/08/2016 | 4.1 |
| 03/08/2016 | 4.1 |
| 03/08/2016 | 4.1 |
| 03/08/2016 | 4 |
| 03/08/2016 | 4 |
| 03/08/2016 | 3.9 |
| 03/08/2016 | 3.8 |
| 03/08/2016 | 3.5 |
| 03/08/2016 | 3.4 |
| 03/08/2016 | 3.2 |
| 03/08/2016 | 2.9 |
| 03/08/2016 | 2.9 |
| 04/08/2016 | 2.8 |
| 04/08/2016 | 2.7 |
| 04/08/2016 | 2.7 |
| 04/08/2016 | 2.8 |
| 04/08/2016 | 3 |
| 04/08/2016 | 3.2 |
| 04/08/2016 | 3.6 |
| 04/08/2016 | 3.9 |
| 04/08/2016 | 4 |
| 04/08/2016 | 4.1 |
| 04/08/2016 | 4.1 |
| 04/08/2016 | 3.9 |
| 04/08/2016 | 4 |
| 04/08/2016 | 3.9 |
| 04/08/2016 | 3.9 |
| 04/08/2016 | 3.7 |
| 04/08/2016 | 3.8 |
| 04/08/2016 | 3.8 |
| 04/08/2016 | 3.6 |
| 04/08/2016 | 3.5 |
| 04/08/2016 | 3.4 |
| 04/08/2016 | 3.1 |
| 04/08/2016 | 2.8 |
| 04/08/2016 | 2.7 |
| 05/08/2016 | 2.7 |
| 05/08/2016 | 2.7 |
| 05/08/2016 | 2.6 |
| 05/08/2016 | 2.8 |
| 05/08/2016 | 2.9 |
| 05/08/2016 | 3.3 |
| 05/08/2016 | 3.5 |
| 05/08/2016 | 3.9 |
| 05/08/2016 | 4 |
| 05/08/2016 | 4.1 |
| 05/08/2016 | 4 |
| 05/08/2016 | 4.1 |
| 05/08/2016 | 4 |
| 05/08/2016 | 3.9 |
| 05/08/2016 | 3.8 |
| 05/08/2016 | 3.8 |
| 05/08/2016 | 3.7 |
| 05/08/2016 | 3.8 |
| 05/08/2016 | 3.5 |
| 05/08/2016 | 3.4 |
| 05/08/2016 | 3.3 |
| 05/08/2016 | 3 |
| 05/08/2016 | 2.9 |
| 05/08/2016 | 2.8 |
| 06/08/2016 | 2.7 |
| 06/08/2016 | 2.6 |
| 06/08/2016 | 2.5 |
| 06/08/2016 | 2.5 |
| 06/08/2016 | 2.5 |
| 06/08/2016 | 2.6 |
| 06/08/2016 | 2.7 |
| 06/08/2016 | 3 |
| 06/08/2016 | 3.2 |
| 06/08/2016 | 3.4 |
| 06/08/2016 | 3.3 |
| 06/08/2016 | 3.3 |
| 06/08/2016 | 3.2 |
| 06/08/2016 | 3.3 |
| 06/08/2016 | 3.1 |
| 06/08/2016 | 3.2 |
| 06/08/2016 | 3.2 |
| 06/08/2016 | 3.3 |
| 06/08/2016 | 3.2 |
| 06/08/2016 | 3.2 |
| 06/08/2016 | 3.2 |
| 06/08/2016 | 2.9 |
| 06/08/2016 | 2.8 |
| 06/08/2016 | 2.6 |
| 07/08/2016 | 2.6 |
| 07/08/2016 | 2.6 |
| 07/08/2016 | 2.5 |
| 07/08/2016 | 2.5 |
| 07/08/2016 | 2.6 |
| 07/08/2016 | 2.4 |
| 07/08/2016 | 2.5 |
| 07/08/2016 | 2.8 |
| 07/08/2016 | 2.9 |
| 07/08/2016 | 3.1 |
| 07/08/2016 | 3.2 |
| 07/08/2016 | 3.2 |
| 07/08/2016 | 3.2 |
| 07/08/2016 | 3.1 |
| 07/08/2016 | 3.2 |
| 07/08/2016 | 3.1 |
| 07/08/2016 | 3.1 |
| 07/08/2016 | 3.1 |
| 07/08/2016 | 3 |
| 07/08/2016 | 3 |
| 07/08/2016 | 3.1 |
| 07/08/2016 | 3 |
| 07/08/2016 | 2.9 |
| 07/08/2016 | 2.7 |
| 08/08/2016 | 2.6 |
| 08/08/2016 | 2.6 |
| 08/08/2016 | 2.6 |
| 08/08/2016 | 2.7 |
| 08/08/2016 | 3 |
| 08/08/2016 | 3.2 |
| 08/08/2016 | 3.6 |
| 08/08/2016 | 3.9 |
| 08/08/2016 | 4 |
| 08/08/2016 | 4.1 |
| 08/08/2016 | 4.1 |
| 08/08/2016 | 4 |
| 08/08/2016 | 4 |
| 08/08/2016 | 3.8 |
| 08/08/2016 | 3.9 |
| 08/08/2016 | 3.8 |
| 08/08/2016 | 3.8 |
| 08/08/2016 | 3.7 |
| 08/08/2016 | 3.6 |
| 08/08/2016 | 3.4 |
| 08/08/2016 | 3.4 |
| 08/08/2016 | 3.2 |
| 08/08/2016 | 2.9 |
| 08/08/2016 | 2.8 |
| 09/08/2016 | 2.7 |
| 09/08/2016 | 2.6 |
| 09/08/2016 | 2.6 |
| 09/08/2016 | 2.7 |
| 09/08/2016 | 3 |
| 09/08/2016 | 3.2 |
| 09/08/2016 | 3.6 |
| 09/08/2016 | 3.9 |
| 09/08/2016 | 3.9 |
| 09/08/2016 | 4 |
| 09/08/2016 | 4 |
| 09/08/2016 | 4.1 |
| 09/08/2016 | 3.9 |
| 09/08/2016 | 3.9 |
| 09/08/2016 | 3.9 |
| 09/08/2016 | 4 |
| 09/08/2016 | 3.9 |
| 09/08/2016 | 3.9 |
| 09/08/2016 | 3.8 |
| 09/08/2016 | 3.6 |
| 09/08/2016 | 3.5 |
| 09/08/2016 | 3.1 |
| 09/08/2016 | 3 |
| 09/08/2016 | 2.9 |
| 10/08/2016 | 2.7 |
| 10/08/2016 | 2.7 |
| 10/08/2016 | 2.6 |
| 10/08/2016 | 2.8 |
| 10/08/2016 | 3 |
| 10/08/2016 | 3.2 |
| 10/08/2016 | 3.7 |
| 10/08/2016 | 4 |
| 10/08/2016 | 4.1 |
| 10/08/2016 | 4.1 |
| 10/08/2016 | 4.1 |
| 10/08/2016 | 4 |
| 10/08/2016 | 4 |
| 10/08/2016 | 4 |
| 10/08/2016 | 4 |
| 10/08/2016 | 4 |
| 10/08/2016 | 3.9 |
| 10/08/2016 | 3.8 |
| 10/08/2016 | 3.8 |
| 10/08/2016 | 3.6 |
| 10/08/2016 | 3.5 |
| 10/08/2016 | 3.1 |
| 10/08/2016 | 3 |
| 10/08/2016 | 2.8 |
| 11/08/2016 | 2.7 |
| 11/08/2016 | 2.7 |
| 11/08/2016 | 2.6 |
| 11/08/2016 | 2.8 |
| 11/08/2016 | 3 |
| 11/08/2016 | 3.2 |
| 11/08/2016 | 3.6 |
| 11/08/2016 | 3.9 |
| 11/08/2016 | 4 |
| 11/08/2016 | 4.1 |
| 11/08/2016 | 4 |
| 11/08/2016 | 3.9 |
| 11/08/2016 | 3.9 |
| 11/08/2016 | 3.9 |
| 11/08/2016 | 3.7 |
| 11/08/2016 | 3.7 |
| 11/08/2016 | 3.8 |
| 11/08/2016 | 3.7 |
| 11/08/2016 | 3.5 |
| 11/08/2016 | 3.4 |
| 11/08/2016 | 3.4 |
| 11/08/2016 | 3.1 |
| 11/08/2016 | 2.8 |
| 11/08/2016 | 2.6 |
| 12/08/2016 | 2.7 |
| 12/08/2016 | 2.6 |
| 12/08/2016 | 2.6 |
| 12/08/2016 | 2.7 |
| 12/08/2016 | 2.9 |
| 12/08/2016 | 3.1 |
| 12/08/2016 | 3.5 |
| 12/08/2016 | 3.9 |
| 12/08/2016 | 4 |
| 12/08/2016 | 4.1 |
| 12/08/2016 | 4 |
| 12/08/2016 | 4 |
| 12/08/2016 | 4 |
| 12/08/2016 | 3.8 |
| 12/08/2016 | 3.8 |
| 12/08/2016 | 3.8 |
| 12/08/2016 | 3.6 |
| 12/08/2016 | 3.7 |
| 12/08/2016 | 3.5 |
| 12/08/2016 | 3.3 |
| 12/08/2016 | 3.4 |
| 12/08/2016 | 3.2 |
| 12/08/2016 | 2.9 |
| 12/08/2016 | 2.7 |
| 13/08/2016 | 2.7 |
| 13/08/2016 | 2.6 |
| 13/08/2016 | 2.5 |
| 13/08/2016 | 2.5 |
| 13/08/2016 | 2.5 |
| 13/08/2016 | 2.6 |
| 13/08/2016 | 2.7 |
| 13/08/2016 | 3 |
| 13/08/2016 | 3.2 |
| 13/08/2016 | 3.4 |
| 13/08/2016 | 3.3 |
| 13/08/2016 | 3.3 |
| 13/08/2016 | 3.2 |
| 13/08/2016 | 3.3 |
| 13/08/2016 | 3.1 |
| 13/08/2016 | 3.2 |
| 13/08/2016 | 3.2 |
| 13/08/2016 | 3.3 |
| 13/08/2016 | 3.1 |
| 13/08/2016 | 3.1 |
| 13/08/2016 | 3 |
| 13/08/2016 | 2.9 |
| 13/08/2016 | 2.8 |
| 13/08/2016 | 2.6 |
| 14/08/2016 | 2.6 |
| 14/08/2016 | 2.6 |
| 14/08/2016 | 2.4 |
| 14/08/2016 | 2.4 |
| 14/08/2016 | 2.6 |
| 14/08/2016 | 2.4 |
| 14/08/2016 | 2.5 |
| 14/08/2016 | 2.6 |
| 14/08/2016 | 2.9 |
| 14/08/2016 | 3.1 |
| 14/08/2016 | 3.2 |
| 14/08/2016 | 3.2 |
| 14/08/2016 | 3.2 |
| 14/08/2016 | 3.1 |
| 14/08/2016 | 3.2 |
| 14/08/2016 | 3.1 |
| 14/08/2016 | 3 |
| 14/08/2016 | 3.1 |
| 14/08/2016 | 3.1 |
| 14/08/2016 | 3.2 |
| 14/08/2016 | 3.1 |
| 14/08/2016 | 3 |
| 14/08/2016 | 2.8 |
| 14/08/2016 | 2.6 |
| 15/08/2016 | 2.6 |
| 15/08/2016 | 2.6 |
| 15/08/2016 | 2.5 |
| 15/08/2016 | 2.7 |
| 15/08/2016 | 2.7 |
| 15/08/2016 | 3.2 |
| 15/08/2016 | 3.6 |
| 15/08/2016 | 3.7 |
| 15/08/2016 | 4 |
| 15/08/2016 | 3.9 |
| 15/08/2016 | 4.1 |
| 15/08/2016 | 4 |
| 15/08/2016 | 4 |
| 15/08/2016 | 3.8 |
| 15/08/2016 | 3.8 |
| 15/08/2016 | 3.8 |
| 15/08/2016 | 3.7 |
| 15/08/2016 | 3.7 |
| 15/08/2016 | 3.6 |
| 15/08/2016 | 3.5 |
| 15/08/2016 | 3.4 |
| 15/08/2016 | 3.2 |
| 15/08/2016 | 2.9 |
| 15/08/2016 | 2.7 |
| 16/08/2016 | 2.6 |
| 16/08/2016 | 2.6 |
| 16/08/2016 | 2.6 |
| 16/08/2016 | 2.7 |
| 16/08/2016 | 2.9 |
| 16/08/2016 | 3.2 |
| 16/08/2016 | 3.6 |
| 16/08/2016 | 3.9 |
| 16/08/2016 | 3.9 |
| 16/08/2016 | 4 |
| 16/08/2016 | 4 |
| 16/08/2016 | 3.9 |
| 16/08/2016 | 3.9 |
| 16/08/2016 | 3.9 |
| 16/08/2016 | 3.9 |
| 16/08/2016 | 4 |
| 16/08/2016 | 3.9 |
| 16/08/2016 | 3.9 |
| 16/08/2016 | 3.8 |
| 16/08/2016 | 3.6 |
| 16/08/2016 | 3.5 |
| 16/08/2016 | 3 |
| 16/08/2016 | 2.9 |
| 16/08/2016 | 2.8 |
| 17/08/2016 | 2.7 |
| 17/08/2016 | 2.6 |
| 17/08/2016 | 2.6 |
| 17/08/2016 | 2.7 |
| 17/08/2016 | 3 |
| 17/08/2016 | 3.2 |
| 17/08/2016 | 3.7 |
| 17/08/2016 | 3.8 |
| 17/08/2016 | 4.1 |
| 17/08/2016 | 4.2 |
| 17/08/2016 | 4.1 |
| 17/08/2016 | 4 |
| 17/08/2016 | 4 |
| 17/08/2016 | 4 |
| 17/08/2016 | 4 |
| 17/08/2016 | 4 |
| 17/08/2016 | 3.9 |
| 17/08/2016 | 3.9 |
| 17/08/2016 | 3.8 |
| 17/08/2016 | 3.6 |
| 17/08/2016 | 3.5 |
| 17/08/2016 | 3.1 |
| 17/08/2016 | 3 |
| 17/08/2016 | 2.8 |
| 18/08/2016 | 2.7 |
| 18/08/2016 | 2.6 |
| 18/08/2016 | 2.6 |
| 18/08/2016 | 2.7 |
| 18/08/2016 | 3 |
| 18/08/2016 | 3.2 |
| 18/08/2016 | 3.6 |
| 18/08/2016 | 3.7 |
| 18/08/2016 | 4 |
| 18/08/2016 | 3.9 |
| 18/08/2016 | 4 |
| 18/08/2016 | 3.9 |
| 18/08/2016 | 3.9 |
| 18/08/2016 | 3.9 |
| 18/08/2016 | 3.6 |
| 18/08/2016 | 3.6 |
| 18/08/2016 | 3.8 |
| 18/08/2016 | 3.8 |
| 18/08/2016 | 3.5 |
| 18/08/2016 | 3.6 |
| 18/08/2016 | 3.4 |
| 18/08/2016 | 3 |
| 18/08/2016 | 2.9 |
| 18/08/2016 | 2.8 |
| 19/08/2016 | 2.7 |
| 19/08/2016 | 2.6 |
| 19/08/2016 | 2.6 |
| 19/08/2016 | 2.7 |
| 19/08/2016 | 2.9 |
| 19/08/2016 | 3.1 |
| 19/08/2016 | 3.5 |
| 19/08/2016 | 3.7 |
| 19/08/2016 | 4 |
| 19/08/2016 | 4.1 |
| 19/08/2016 | 4 |
| 19/08/2016 | 4 |
| 19/08/2016 | 3.9 |
| 19/08/2016 | 3.8 |
| 19/08/2016 | 3.7 |
| 19/08/2016 | 3.7 |
| 19/08/2016 | 3.6 |
| 19/08/2016 | 3.8 |
| 19/08/2016 | 3.6 |
| 19/08/2016 | 3.5 |
| 19/08/2016 | 3.3 |
| 19/08/2016 | 3.1 |
| 19/08/2016 | 2.8 |
| 19/08/2016 | 2.7 |
| 20/08/2016 | 2.6 |
| 20/08/2016 | 2.6 |
| 20/08/2016 | 2.4 |
| 20/08/2016 | 2.4 |
| 20/08/2016 | 2.5 |
| 20/08/2016 | 2.6 |
| 20/08/2016 | 2.7 |
| 20/08/2016 | 2.9 |
| 20/08/2016 | 3.2 |
| 20/08/2016 | 3.4 |
| 20/08/2016 | 3.3 |
| 20/08/2016 | 3.3 |
| 20/08/2016 | 3.2 |
| 20/08/2016 | 3.3 |
| 20/08/2016 | 3.1 |
| 20/08/2016 | 3.1 |
| 20/08/2016 | 3.2 |
| 20/08/2016 | 3.3 |
| 20/08/2016 | 3.3 |
| 20/08/2016 | 3.1 |
| 20/08/2016 | 3 |
| 20/08/2016 | 2.9 |
| 20/08/2016 | 2.8 |
| 20/08/2016 | 2.8 |
| 21/08/2016 | 2.5 |
| 21/08/2016 | 2.5 |
| 21/08/2016 | 2.4 |
| 21/08/2016 | 2.4 |
| 21/08/2016 | 2.5 |
| 21/08/2016 | 2.4 |
| 21/08/2016 | 2.5 |
| 21/08/2016 | 2.6 |
| 21/08/2016 | 2.9 |
| 21/08/2016 | 3.1 |
| 21/08/2016 | 3.2 |
| 21/08/2016 | 3.2 |
| 21/08/2016 | 3.2 |
| 21/08/2016 | 3.1 |
| 21/08/2016 | 3.1 |
| 21/08/2016 | 3.1 |
| 21/08/2016 | 3 |
| 21/08/2016 | 3.1 |
| 21/08/2016 | 3.1 |
| 21/08/2016 | 3.1 |
| 21/08/2016 | 3.1 |
| 21/08/2016 | 2.9 |
| 21/08/2016 | 2.8 |
| 21/08/2016 | 2.6 |
| 22/08/2016 | 2.5 |
| 22/08/2016 | 2.5 |
| 22/08/2016 | 2.5 |
| 22/08/2016 | 2.6 |
| 22/08/2016 | 2.7 |
| 22/08/2016 | 3.2 |
| 22/08/2016 | 3.6 |
| 22/08/2016 | 3.7 |
| 22/08/2016 | 3.8 |
| 22/08/2016 | 3.9 |
| 22/08/2016 | 3.9 |
| 22/08/2016 | 4 |
| 22/08/2016 | 4 |
| 22/08/2016 | 3.8 |
| 22/08/2016 | 3.8 |
| 22/08/2016 | 3.8 |
| 22/08/2016 | 3.7 |
| 22/08/2016 | 3.7 |
| 22/08/2016 | 3.6 |
| 22/08/2016 | 3.7 |
| 22/08/2016 | 3.4 |
| 22/08/2016 | 3.1 |
| 22/08/2016 | 2.8 |
| 22/08/2016 | 2.7 |
| 23/08/2016 | 2.6 |
| 23/08/2016 | 2.5 |
| 23/08/2016 | 2.5 |
| 23/08/2016 | 2.6 |
| 23/08/2016 | 2.9 |
| 23/08/2016 | 3.2 |
| 23/08/2016 | 3.5 |
| 23/08/2016 | 3.7 |
| 23/08/2016 | 4 |
| 23/08/2016 | 4 |
| 23/08/2016 | 4 |
| 23/08/2016 | 3.8 |
| 23/08/2016 | 3.9 |
| 23/08/2016 | 3.8 |
| 23/08/2016 | 3.8 |
| 23/08/2016 | 3.9 |
| 23/08/2016 | 3.9 |
| 23/08/2016 | 3.9 |
| 23/08/2016 | 3.8 |
| 23/08/2016 | 3.6 |
| 23/08/2016 | 3.5 |
| 23/08/2016 | 3.2 |
| 23/08/2016 | 2.9 |
| 23/08/2016 | 2.8 |
| 24/08/2016 | 2.6 |
| 24/08/2016 | 2.6 |
| 24/08/2016 | 2.6 |
| 24/08/2016 | 2.7 |
| 24/08/2016 | 2.8 |
| 24/08/2016 | 3.2 |
| 24/08/2016 | 3.6 |
| 24/08/2016 | 3.8 |
| 24/08/2016 | 3.9 |
| 24/08/2016 | 4.2 |
| 24/08/2016 | 4.1 |
| 24/08/2016 | 4 |
| 24/08/2016 | 4 |
| 24/08/2016 | 4 |
| 24/08/2016 | 3.9 |
| 24/08/2016 | 3.9 |
| 24/08/2016 | 3.9 |
| 24/08/2016 | 3.9 |
| 24/08/2016 | 3.8 |
| 24/08/2016 | 3.6 |
| 24/08/2016 | 3.5 |
| 24/08/2016 | 3 |
| 24/08/2016 | 2.9 |
| 24/08/2016 | 2.8 |
| 25/08/2016 | 2.6 |
| 25/08/2016 | 2.6 |
| 25/08/2016 | 2.5 |
| 25/08/2016 | 2.7 |
| 25/08/2016 | 2.7 |
| 25/08/2016 | 3.2 |
| 25/08/2016 | 3.6 |
| 25/08/2016 | 3.7 |
| 25/08/2016 | 3.8 |
| 25/08/2016 | 3.9 |
| 25/08/2016 | 4 |
| 25/08/2016 | 3.9 |
| 25/08/2016 | 3.9 |
| 25/08/2016 | 3.8 |
| 25/08/2016 | 3.6 |
| 25/08/2016 | 3.6 |
| 25/08/2016 | 3.7 |
| 25/08/2016 | 3.8 |
| 25/08/2016 | 3.7 |
| 25/08/2016 | 3.6 |
| 25/08/2016 | 3.4 |
| 25/08/2016 | 3 |
| 25/08/2016 | 2.9 |
| 25/08/2016 | 2.8 |
| 26/08/2016 | 2.6 |
| 26/08/2016 | 2.6 |
| 26/08/2016 | 2.5 |
| 26/08/2016 | 2.6 |
| 26/08/2016 | 2.7 |
| 26/08/2016 | 3.1 |
| 26/08/2016 | 3.5 |
| 26/08/2016 | 3.6 |
| 26/08/2016 | 3.8 |
| 26/08/2016 | 3.9 |
| 26/08/2016 | 4 |
| 26/08/2016 | 4 |
| 26/08/2016 | 3.9 |
| 26/08/2016 | 3.8 |
| 26/08/2016 | 3.7 |
| 26/08/2016 | 3.7 |
| 26/08/2016 | 3.6 |
| 26/08/2016 | 3.8 |
| 26/08/2016 | 3.6 |
| 26/08/2016 | 3.5 |
| 26/08/2016 | 3.3 |
| 26/08/2016 | 3.1 |
| 26/08/2016 | 2.8 |
| 26/08/2016 | 2.6 |
| 27/08/2016 | 2.6 |
| 27/08/2016 | 2.5 |
| 27/08/2016 | 2.4 |
| 27/08/2016 | 2.6 |
| 27/08/2016 | 2.5 |
| 27/08/2016 | 2.6 |
| 27/08/2016 | 2.7 |
| 27/08/2016 | 2.9 |
| 27/08/2016 | 3.2 |
| 27/08/2016 | 3.4 |
| 27/08/2016 | 3.3 |
| 27/08/2016 | 3.3 |
| 27/08/2016 | 3.2 |
| 27/08/2016 | 3.2 |
| 27/08/2016 | 3 |
| 27/08/2016 | 3.1 |
| 27/08/2016 | 3.2 |
| 27/08/2016 | 3.3 |
| 27/08/2016 | 3.3 |
| 27/08/2016 | 3.3 |
| 27/08/2016 | 3 |
| 27/08/2016 | 2.8 |
| 27/08/2016 | 2.7 |
| 27/08/2016 | 2.7 |
| 28/08/2016 | 2.5 |
| 28/08/2016 | 2.5 |
| 28/08/2016 | 2.6 |
| 28/08/2016 | 2.5 |
| 28/08/2016 | 2.5 |
| 28/08/2016 | 2.4 |
| 28/08/2016 | 2.5 |
| 28/08/2016 | 2.6 |
| 28/08/2016 | 2.9 |
| 28/08/2016 | 3.1 |
| 28/08/2016 | 3.2 |
| 28/08/2016 | 3.2 |
| 28/08/2016 | 3.2 |
| 28/08/2016 | 3.1 |
| 28/08/2016 | 2.9 |
| 28/08/2016 | 3.1 |
| 28/08/2016 | 3 |
| 28/08/2016 | 3.1 |
| 28/08/2016 | 3 |
| 28/08/2016 | 3.1 |
| 28/08/2016 | 3.1 |
| 28/08/2016 | 2.9 |
| 28/08/2016 | 2.7 |
| 28/08/2016 | 2.7 |
| 29/08/2016 | 2.5 |
| 29/08/2016 | 2.5 |
| 29/08/2016 | 2.5 |
| 29/08/2016 | 2.6 |
| 29/08/2016 | 2.7 |
| 29/08/2016 | 3.1 |
| 29/08/2016 | 3.4 |
| 29/08/2016 | 3.7 |
| 29/08/2016 | 3.8 |
| 29/08/2016 | 3.9 |
| 29/08/2016 | 3.9 |
| 29/08/2016 | 4 |
| 29/08/2016 | 4 |
| 29/08/2016 | 3.8 |
| 29/08/2016 | 3.7 |
| 29/08/2016 | 3.7 |
| 29/08/2016 | 3.7 |
| 29/08/2016 | 3.8 |
| 29/08/2016 | 3.8 |
| 29/08/2016 | 3.7 |
| 29/08/2016 | 3.4 |
| 29/08/2016 | 3.1 |
| 29/08/2016 | 2.8 |
| 29/08/2016 | 2.7 |
| 30/08/2016 | 2.5 |
| 30/08/2016 | 2.5 |
| 30/08/2016 | 2.5 |
| 30/08/2016 | 2.6 |
| 30/08/2016 | 2.7 |
| 30/08/2016 | 3 |
| 30/08/2016 | 3.5 |
| 30/08/2016 | 3.7 |
| 30/08/2016 | 4 |
| 30/08/2016 | 4.1 |
| 30/08/2016 | 4 |
| 30/08/2016 | 3.8 |
| 30/08/2016 | 3.9 |
| 30/08/2016 | 3.8 |
| 30/08/2016 | 3.8 |
| 30/08/2016 | 3.9 |
| 30/08/2016 | 3.9 |
| 30/08/2016 | 3.9 |
| 30/08/2016 | 3.8 |
| 30/08/2016 | 3.6 |
| 30/08/2016 | 3.5 |
| 30/08/2016 | 3.2 |
| 30/08/2016 | 2.9 |
| 30/08/2016 | 2.7 |
| 31/08/2016 | 2.6 |
| 31/08/2016 | 2.5 |
| 31/08/2016 | 2.5 |
| 31/08/2016 | 2.6 |
| 31/08/2016 | 2.8 |
| 31/08/2016 | 3.1 |
| 31/08/2016 | 3.4 |
| 31/08/2016 | 3.8 |
| 31/08/2016 | 3.9 |
| 31/08/2016 | 4 |
| 31/08/2016 | 4.1 |
| 31/08/2016 | 4 |
| 31/08/2016 | 4 |
| 31/08/2016 | 3.9 |
| 31/08/2016 | 3.9 |
| 31/08/2016 | 3.9 |
| 31/08/2016 | 3.9 |
| 31/08/2016 | 3.9 |
| 31/08/2016 | 3.8 |
| 31/08/2016 | 3.7 |
| 31/08/2016 | 3.5 |
| 31/08/2016 | 3.2 |
| 31/08/2016 | 2.9 |
| 31/08/2016 | 2.7 |
| 01/09/2016 | 2.6 |
| 01/09/2016 | 2.5 |
| 01/09/2016 | 2.5 |
| 01/09/2016 | 2.6 |
| 01/09/2016 | 2.7 |
| 01/09/2016 | 3 |
| 01/09/2016 | 3.4 |
| 01/09/2016 | 3.7 |
| 01/09/2016 | 3.8 |
| 01/09/2016 | 3.9 |
| 01/09/2016 | 4.1 |
| 01/09/2016 | 3.9 |
| 01/09/2016 | 3.9 |
| 01/09/2016 | 3.8 |
| 01/09/2016 | 3.6 |
| 01/09/2016 | 3.6 |
| 01/09/2016 | 3.7 |
| 01/09/2016 | 3.8 |
| 01/09/2016 | 3.7 |
| 01/09/2016 | 3.6 |
| 01/09/2016 | 3.4 |
| 01/09/2016 | 3.1 |
| 01/09/2016 | 2.9 |
| 01/09/2016 | 2.7 |
| 02/09/2016 | 2.6 |
| 02/09/2016 | 2.5 |
| 02/09/2016 | 2.5 |
| 02/09/2016 | 2.6 |
| 02/09/2016 | 2.7 |
| 02/09/2016 | 2.9 |
| 02/09/2016 | 3.5 |
| 02/09/2016 | 3.6 |
| 02/09/2016 | 3.8 |
| 02/09/2016 | 3.9 |
| 02/09/2016 | 4 |
| 02/09/2016 | 4 |
| 02/09/2016 | 3.9 |
| 02/09/2016 | 3.8 |
| 02/09/2016 | 3.7 |
| 02/09/2016 | 3.7 |
| 02/09/2016 | 3.8 |
| 02/09/2016 | 3.8 |
| 02/09/2016 | 3.6 |
| 02/09/2016 | 3.5 |
| 02/09/2016 | 3.3 |
| 02/09/2016 | 3 |
| 02/09/2016 | 2.7 |
| 02/09/2016 | 2.6 |
| 03/09/2016 | 2.5 |
| 03/09/2016 | 2.5 |
| 03/09/2016 | 2.4 |
| 03/09/2016 | 2.4 |
| 03/09/2016 | 2.6 |
| 03/09/2016 | 2.5 |
| 03/09/2016 | 2.7 |
| 03/09/2016 | 2.9 |
| 03/09/2016 | 3.1 |
| 03/09/2016 | 3.4 |
| 03/09/2016 | 3.5 |
| 03/09/2016 | 3.5 |
| 03/09/2016 | 3.4 |
| 03/09/2016 | 3.3 |
| 03/09/2016 | 3.3 |
| 03/09/2016 | 3.2 |
| 03/09/2016 | 3.2 |
| 03/09/2016 | 3.2 |
| 03/09/2016 | 3.4 |
| 03/09/2016 | 3.4 |
| 03/09/2016 | 3.3 |
| 03/09/2016 | 2.9 |
| 03/09/2016 | 2.7 |
| 03/09/2016 | 2.7 |
| 04/09/2016 | 2.5 |
| 04/09/2016 | 2.4 |
| 04/09/2016 | 2.3 |
| 04/09/2016 | 2.3 |
| 04/09/2016 | 2.4 |
| 04/09/2016 | 2.5 |
| 04/09/2016 | 2.6 |
| 04/09/2016 | 2.7 |
| 04/09/2016 | 2.9 |
| 04/09/2016 | 3.1 |
| 04/09/2016 | 3.2 |
| 04/09/2016 | 3.2 |
| 04/09/2016 | 3.2 |
| 04/09/2016 | 3.1 |
| 04/09/2016 | 3.2 |
| 04/09/2016 | 3.1 |
| 04/09/2016 | 3.1 |
| 04/09/2016 | 3.2 |
| 04/09/2016 | 3.3 |
| 04/09/2016 | 3.4 |
| 04/09/2016 | 3.1 |
| 04/09/2016 | 3 |
| 04/09/2016 | 2.8 |
| 04/09/2016 | 2.7 |
| 05/09/2016 | 2.4 |
| 05/09/2016 | 2.4 |
| 05/09/2016 | 2.4 |
| 05/09/2016 | 2.6 |
| 05/09/2016 | 2.8 |
| 05/09/2016 | 3.3 |
| 05/09/2016 | 3.5 |
| 05/09/2016 | 3.7 |
| 05/09/2016 | 3.9 |
| 05/09/2016 | 3.9 |
| 05/09/2016 | 4.1 |
| 05/09/2016 | 4 |
| 05/09/2016 | 4.1 |
| 05/09/2016 | 3.9 |
| 05/09/2016 | 3.9 |
| 05/09/2016 | 3.8 |
| 05/09/2016 | 3.8 |
| 05/09/2016 | 3.9 |
| 05/09/2016 | 4 |
| 05/09/2016 | 3.8 |
| 05/09/2016 | 3.4 |
| 05/09/2016 | 3.2 |
| 05/09/2016 | 2.8 |
| 05/09/2016 | 2.6 |
| 06/09/2016 | 2.5 |
| 06/09/2016 | 2.5 |
| 06/09/2016 | 2.5 |
| 06/09/2016 | 2.6 |
| 06/09/2016 | 2.8 |
| 06/09/2016 | 3.2 |
| 06/09/2016 | 3.5 |
| 06/09/2016 | 3.7 |
| 06/09/2016 | 3.9 |
| 06/09/2016 | 4.1 |
| 06/09/2016 | 4 |
| 06/09/2016 | 4.1 |
| 06/09/2016 | 3.9 |
| 06/09/2016 | 4 |
| 06/09/2016 | 3.9 |
| 06/09/2016 | 4 |
| 06/09/2016 | 4 |
| 06/09/2016 | 3.9 |
| 06/09/2016 | 4 |
| 06/09/2016 | 3.8 |
| 06/09/2016 | 3.5 |
| 06/09/2016 | 3 |
| 06/09/2016 | 2.9 |
| 06/09/2016 | 2.7 |
| 07/09/2016 | 2.6 |
| 07/09/2016 | 2.5 |
| 07/09/2016 | 2.5 |
| 07/09/2016 | 2.6 |
| 07/09/2016 | 2.9 |
| 07/09/2016 | 3.3 |
| 07/09/2016 | 3.6 |
| 07/09/2016 | 3.8 |
| 07/09/2016 | 4 |
| 07/09/2016 | 4 |
| 07/09/2016 | 4.2 |
| 07/09/2016 | 4 |
| 07/09/2016 | 4.1 |
| 07/09/2016 | 4.1 |
| 07/09/2016 | 4 |
| 07/09/2016 | 3.8 |
| 07/09/2016 | 4 |
| 07/09/2016 | 3.9 |
| 07/09/2016 | 4 |
| 07/09/2016 | 3.8 |
| 07/09/2016 | 3.5 |
| 07/09/2016 | 3.1 |
| 07/09/2016 | 2.9 |
| 07/09/2016 | 2.7 |
| 08/09/2016 | 2.6 |
| 08/09/2016 | 2.5 |
| 08/09/2016 | 2.5 |
| 08/09/2016 | 2.6 |
| 08/09/2016 | 2.8 |
| 08/09/2016 | 3.3 |
| 08/09/2016 | 3.5 |
| 08/09/2016 | 3.7 |
| 08/09/2016 | 3.9 |
| 08/09/2016 | 3.9 |
| 08/09/2016 | 4.1 |
| 08/09/2016 | 3.9 |
| 08/09/2016 | 3.9 |
| 08/09/2016 | 3.9 |
| 08/09/2016 | 3.7 |
| 08/09/2016 | 3.7 |
| 08/09/2016 | 3.8 |
| 08/09/2016 | 3.8 |
| 08/09/2016 | 3.9 |
| 08/09/2016 | 3.8 |
| 08/09/2016 | 3.5 |
| 08/09/2016 | 3 |
| 08/09/2016 | 2.9 |
| 08/09/2016 | 2.7 |
| 09/09/2016 | 2.5 |
| 09/09/2016 | 2.5 |
| 09/09/2016 | 2.5 |
| 09/09/2016 | 2.6 |
| 09/09/2016 | 2.8 |
| 09/09/2016 | 3.2 |
| 09/09/2016 | 3.4 |
| 09/09/2016 | 3.7 |
| 09/09/2016 | 3.9 |
| 09/09/2016 | 4 |
| 09/09/2016 | 4 |
| 09/09/2016 | 4.1 |
| 09/09/2016 | 4 |
| 09/09/2016 | 3.9 |
| 09/09/2016 | 3.8 |
| 09/09/2016 | 3.8 |
| 09/09/2016 | 3.7 |
| 09/09/2016 | 3.7 |
| 09/09/2016 | 3.8 |
| 09/09/2016 | 3.7 |
| 09/09/2016 | 3.4 |
| 09/09/2016 | 3.1 |
| 09/09/2016 | 2.8 |
| 09/09/2016 | 2.6 |
| 10/09/2016 | 2.5 |
| 10/09/2016 | 2.4 |
| 10/09/2016 | 2.3 |
| 10/09/2016 | 2.4 |
| 10/09/2016 | 2.6 |
| 10/09/2016 | 2.5 |
| 10/09/2016 | 2.7 |
| 10/09/2016 | 2.9 |
| 10/09/2016 | 3.1 |
| 10/09/2016 | 3.4 |
| 10/09/2016 | 3.5 |
| 10/09/2016 | 3.5 |
| 10/09/2016 | 3.4 |
| 10/09/2016 | 3.3 |
| 10/09/2016 | 3.3 |
| 10/09/2016 | 3.1 |
| 10/09/2016 | 3.2 |
| 10/09/2016 | 3.2 |
| 10/09/2016 | 3.6 |
| 10/09/2016 | 3.4 |
| 10/09/2016 | 3.3 |
| 10/09/2016 | 2.9 |
| 10/09/2016 | 2.7 |
| 10/09/2016 | 2.6 |
| 11/09/2016 | 2.4 |
| 11/09/2016 | 2.4 |
| 11/09/2016 | 2.5 |
| 11/09/2016 | 2.3 |
| 11/09/2016 | 2.4 |
| 11/09/2016 | 2.5 |
| 11/09/2016 | 2.6 |
| 11/09/2016 | 2.7 |
| 11/09/2016 | 2.9 |
| 11/09/2016 | 3.1 |
| 11/09/2016 | 3.2 |
| 11/09/2016 | 3.2 |
| 11/09/2016 | 3.2 |
| 11/09/2016 | 3.1 |
| 11/09/2016 | 3.1 |
| 11/09/2016 | 3.1 |
| 11/09/2016 | 3 |
| 11/09/2016 | 3.2 |
| 11/09/2016 | 3.3 |
| 11/09/2016 | 3.4 |
| 11/09/2016 | 3.1 |
| 11/09/2016 | 3 |
| 11/09/2016 | 2.7 |
| 11/09/2016 | 2.7 |
| 12/09/2016 | 2.4 |
| 12/09/2016 | 2.4 |
| 12/09/2016 | 2.4 |
| 12/09/2016 | 2.5 |
| 12/09/2016 | 2.8 |
| 12/09/2016 | 3.1 |
| 12/09/2016 | 3.5 |
| 12/09/2016 | 3.7 |
| 12/09/2016 | 3.9 |
| 12/09/2016 | 4 |
| 12/09/2016 | 4.1 |
| 12/09/2016 | 4 |
| 12/09/2016 | 4 |
| 12/09/2016 | 3.9 |
| 12/09/2016 | 3.8 |
| 12/09/2016 | 3.8 |
| 12/09/2016 | 3.8 |
| 12/09/2016 | 3.9 |
| 12/09/2016 | 4 |
| 12/09/2016 | 3.9 |
| 12/09/2016 | 3.4 |
| 12/09/2016 | 3.1 |
| 12/09/2016 | 2.8 |
| 12/09/2016 | 2.6 |
| 13/09/2016 | 2.5 |
| 13/09/2016 | 2.4 |
| 13/09/2016 | 2.4 |
| 13/09/2016 | 2.6 |
| 13/09/2016 | 2.8 |
| 13/09/2016 | 3.1 |
| 13/09/2016 | 3.5 |
| 13/09/2016 | 3.7 |
| 13/09/2016 | 3.9 |
| 13/09/2016 | 3.9 |
| 13/09/2016 | 4 |
| 13/09/2016 | 4.1 |
| 13/09/2016 | 3.9 |
| 13/09/2016 | 3.9 |
| 13/09/2016 | 3.9 |
| 13/09/2016 | 4 |
| 13/09/2016 | 4 |
| 13/09/2016 | 3.9 |
| 13/09/2016 | 4 |
| 13/09/2016 | 4 |
| 13/09/2016 | 3.5 |
| 13/09/2016 | 3.2 |
| 13/09/2016 | 2.8 |
| 13/09/2016 | 2.7 |
| 14/09/2016 | 2.5 |
| 14/09/2016 | 2.5 |
| 14/09/2016 | 2.5 |
| 14/09/2016 | 2.6 |
| 14/09/2016 | 2.9 |
| 14/09/2016 | 3.1 |
| 14/09/2016 | 3.6 |
| 14/09/2016 | 3.8 |
| 14/09/2016 | 4 |
| 14/09/2016 | 4 |
| 14/09/2016 | 4.2 |
| 14/09/2016 | 4 |
| 14/09/2016 | 4.1 |
| 14/09/2016 | 4.1 |
| 14/09/2016 | 4 |
| 14/09/2016 | 3.8 |
| 14/09/2016 | 3.8 |
| 14/09/2016 | 3.9 |
| 14/09/2016 | 4 |
| 14/09/2016 | 4 |
| 14/09/2016 | 3.5 |
| 14/09/2016 | 3 |
| 14/09/2016 | 2.9 |
| 14/09/2016 | 2.7 |
| 15/09/2016 | 2.5 |
| 15/09/2016 | 2.5 |
| 15/09/2016 | 2.5 |
| 15/09/2016 | 2.6 |
| 15/09/2016 | 2.8 |
| 15/09/2016 | 3.1 |
| 15/09/2016 | 3.5 |
| 15/09/2016 | 3.8 |
| 15/09/2016 | 4 |
| 15/09/2016 | 4 |
| 15/09/2016 | 4.1 |
| 15/09/2016 | 3.9 |
| 15/09/2016 | 4 |
| 15/09/2016 | 3.9 |
| 15/09/2016 | 3.7 |
| 15/09/2016 | 3.7 |
| 15/09/2016 | 3.7 |
| 15/09/2016 | 3.9 |
| 15/09/2016 | 3.9 |
| 15/09/2016 | 3.7 |
| 15/09/2016 | 3.5 |
| 15/09/2016 | 3 |
| 15/09/2016 | 2.9 |
| 15/09/2016 | 2.7 |
| 16/09/2016 | 2.5 |
| 16/09/2016 | 2.5 |
| 16/09/2016 | 2.5 |
| 16/09/2016 | 2.6 |
| 16/09/2016 | 2.8 |
| 16/09/2016 | 3 |
| 16/09/2016 | 3.5 |
| 16/09/2016 | 3.8 |
| 16/09/2016 | 4 |
| 16/09/2016 | 4 |
| 16/09/2016 | 4.1 |
| 16/09/2016 | 4.1 |
| 16/09/2016 | 4 |
| 16/09/2016 | 3.9 |
| 16/09/2016 | 3.8 |
| 16/09/2016 | 3.8 |
| 16/09/2016 | 3.8 |
| 16/09/2016 | 3.7 |
| 16/09/2016 | 3.8 |
| 16/09/2016 | 3.8 |
| 16/09/2016 | 3.4 |
| 16/09/2016 | 3.1 |
| 16/09/2016 | 2.8 |
| 16/09/2016 | 2.6 |
| 17/09/2016 | 2.5 |
| 17/09/2016 | 2.4 |
| 17/09/2016 | 2.3 |
| 17/09/2016 | 2.4 |
| 17/09/2016 | 2.4 |
| 17/09/2016 | 2.6 |
| 17/09/2016 | 2.7 |
| 17/09/2016 | 2.9 |
| 17/09/2016 | 3.2 |
| 17/09/2016 | 3.3 |
| 17/09/2016 | 3.3 |
| 17/09/2016 | 3.3 |
| 17/09/2016 | 3.4 |
| 17/09/2016 | 3.3 |
| 17/09/2016 | 3.1 |
| 17/09/2016 | 3.2 |
| 17/09/2016 | 3.3 |
| 17/09/2016 | 3.2 |
| 17/09/2016 | 3.6 |
| 17/09/2016 | 3.5 |
| 17/09/2016 | 3.3 |
| 17/09/2016 | 2.9 |
| 17/09/2016 | 2.7 |
| 17/09/2016 | 2.7 |
| 18/09/2016 | 2.4 |
| 18/09/2016 | 2.4 |
| 18/09/2016 | 2.3 |
| 18/09/2016 | 2.3 |
| 18/09/2016 | 2.4 |
| 18/09/2016 | 2.4 |
| 18/09/2016 | 2.5 |
| 18/09/2016 | 2.8 |
| 18/09/2016 | 3 |
| 18/09/2016 | 3.2 |
| 18/09/2016 | 3.2 |
| 18/09/2016 | 3.2 |
| 18/09/2016 | 3.2 |
| 18/09/2016 | 3.1 |
| 18/09/2016 | 3.2 |
| 18/09/2016 | 3.1 |
| 18/09/2016 | 3.2 |
| 18/09/2016 | 3.2 |
| 18/09/2016 | 3.3 |
| 18/09/2016 | 3.4 |
| 18/09/2016 | 3.2 |
| 18/09/2016 | 3 |
| 18/09/2016 | 2.8 |
| 18/09/2016 | 2.5 |
| 19/09/2016 | 2.4 |
| 19/09/2016 | 2.4 |
| 19/09/2016 | 2.4 |
| 19/09/2016 | 2.6 |
| 19/09/2016 | 2.6 |
| 19/09/2016 | 3.2 |
| 19/09/2016 | 3.4 |
| 19/09/2016 | 3.6 |
| 19/09/2016 | 3.8 |
| 19/09/2016 | 4 |
| 19/09/2016 | 4 |
| 19/09/2016 | 4 |
| 19/09/2016 | 4.1 |
| 19/09/2016 | 3.9 |
| 19/09/2016 | 3.9 |
| 19/09/2016 | 3.9 |
| 19/09/2016 | 3.8 |
| 19/09/2016 | 3.9 |
| 19/09/2016 | 4.1 |
| 19/09/2016 | 3.9 |
| 19/09/2016 | 3.5 |
| 19/09/2016 | 3.2 |
| 19/09/2016 | 2.8 |
| 19/09/2016 | 2.6 |
| 20/09/2016 | 2.5 |
| 20/09/2016 | 2.5 |
| 20/09/2016 | 2.4 |
| 20/09/2016 | 2.6 |
| 20/09/2016 | 2.8 |
| 20/09/2016 | 3.2 |
| 20/09/2016 | 3.6 |
| 20/09/2016 | 3.8 |
| 20/09/2016 | 4 |
| 20/09/2016 | 4 |
| 20/09/2016 | 4.1 |
| 20/09/2016 | 3.9 |
| 20/09/2016 | 4 |
| 20/09/2016 | 4 |
| 20/09/2016 | 4 |
| 20/09/2016 | 3.9 |
| 20/09/2016 | 4 |
| 20/09/2016 | 4.1 |
| 20/09/2016 | 4 |
| 20/09/2016 | 3.8 |
| 20/09/2016 | 3.6 |
| 20/09/2016 | 3 |
| 20/09/2016 | 2.9 |
| 20/09/2016 | 2.7 |
| 21/09/2016 | 2.6 |
| 21/09/2016 | 2.5 |
| 21/09/2016 | 2.5 |
| 21/09/2016 | 2.6 |
| 21/09/2016 | 2.7 |
| 21/09/2016 | 3.2 |
| 21/09/2016 | 3.5 |
| 21/09/2016 | 3.8 |
| 21/09/2016 | 3.9 |
| 21/09/2016 | 4.1 |
| 21/09/2016 | 4 |
| 21/09/2016 | 4.1 |
| 21/09/2016 | 4.1 |
| 21/09/2016 | 4.1 |
| 21/09/2016 | 3.9 |
| 21/09/2016 | 3.9 |
| 21/09/2016 | 4 |
| 21/09/2016 | 3.9 |
| 21/09/2016 | 4.1 |
| 21/09/2016 | 3.8 |
| 21/09/2016 | 3.5 |
| 21/09/2016 | 3.1 |
| 21/09/2016 | 2.9 |
| 21/09/2016 | 2.7 |
| 22/09/2016 | 2.6 |
| 22/09/2016 | 2.5 |
| 22/09/2016 | 2.5 |
| 22/09/2016 | 2.6 |
| 22/09/2016 | 2.7 |
| 22/09/2016 | 3.2 |
| 22/09/2016 | 3.5 |
| 22/09/2016 | 3.7 |
| 22/09/2016 | 3.9 |
| 22/09/2016 | 4.1 |
| 22/09/2016 | 4 |
| 22/09/2016 | 4 |
| 22/09/2016 | 4 |
| 22/09/2016 | 3.8 |
| 22/09/2016 | 3.7 |
| 22/09/2016 | 3.8 |
| 22/09/2016 | 3.9 |
| 22/09/2016 | 3.9 |
| 22/09/2016 | 4 |
| 22/09/2016 | 3.7 |
| 22/09/2016 | 3.5 |
| 22/09/2016 | 3 |
| 22/09/2016 | 2.7 |
| 22/09/2016 | 2.7 |
| 23/09/2016 | 2.6 |
| 23/09/2016 | 2.5 |
| 23/09/2016 | 2.5 |
| 23/09/2016 | 2.6 |
| 23/09/2016 | 2.8 |
| 23/09/2016 | 3.1 |
| 23/09/2016 | 3.4 |
| 23/09/2016 | 3.7 |
| 23/09/2016 | 3.9 |
| 23/09/2016 | 4.1 |
| 23/09/2016 | 4 |
| 23/09/2016 | 3.9 |
| 23/09/2016 | 4 |
| 23/09/2016 | 3.9 |
| 23/09/2016 | 3.9 |
| 23/09/2016 | 3.7 |
| 23/09/2016 | 3.8 |
| 23/09/2016 | 3.9 |
| 23/09/2016 | 3.9 |
| 23/09/2016 | 3.6 |
| 23/09/2016 | 3.4 |
| 23/09/2016 | 3 |
| 23/09/2016 | 2.8 |
| 23/09/2016 | 2.6 |
| 24/09/2016 | 2.5 |
| 24/09/2016 | 2.5 |
| 24/09/2016 | 2.4 |
| 24/09/2016 | 2.4 |
| 24/09/2016 | 2.4 |
| 24/09/2016 | 2.7 |
| 24/09/2016 | 2.6 |
| 24/09/2016 | 2.8 |
| 24/09/2016 | 3.2 |
| 24/09/2016 | 3.3 |
| 24/09/2016 | 3.4 |
| 24/09/2016 | 3.4 |
| 24/09/2016 | 3.2 |
| 24/09/2016 | 3.3 |
| 24/09/2016 | 3.1 |
| 24/09/2016 | 3.2 |
| 24/09/2016 | 3.2 |
| 24/09/2016 | 3.4 |
| 24/09/2016 | 3.6 |
| 24/09/2016 | 3.5 |
| 24/09/2016 | 3.1 |
| 24/09/2016 | 2.9 |
| 24/09/2016 | 2.8 |
| 24/09/2016 | 2.5 |
| 25/09/2016 | 2.5 |
| 25/09/2016 | 2.4 |
| 25/09/2016 | 2.3 |
| 25/09/2016 | 2.3 |
| 25/09/2016 | 2.4 |
| 25/09/2016 | 2.4 |
| 25/09/2016 | 2.6 |
| 25/09/2016 | 2.7 |
| 25/09/2016 | 2.9 |
| 25/09/2016 | 3 |
| 25/09/2016 | 3.3 |
| 25/09/2016 | 3.3 |
| 25/09/2016 | 3.2 |
| 25/09/2016 | 3.1 |
| 25/09/2016 | 3.2 |
| 25/09/2016 | 3.2 |
| 25/09/2016 | 3.1 |
| 25/09/2016 | 3.3 |
| 25/09/2016 | 3.3 |
| 25/09/2016 | 3.3 |
| 25/09/2016 | 3.2 |
| 25/09/2016 | 3 |
| 25/09/2016 | 2.8 |
| 25/09/2016 | 2.5 |
| 26/09/2016 | 2.5 |
| 26/09/2016 | 2.5 |
| 26/09/2016 | 2.4 |
| 26/09/2016 | 2.6 |
| 26/09/2016 | 2.7 |
| 26/09/2016 | 3.1 |
| 26/09/2016 | 3.6 |
| 26/09/2016 | 3.8 |
| 26/09/2016 | 3.9 |
| 26/09/2016 | 3.9 |
| 26/09/2016 | 4 |
| 26/09/2016 | 4.1 |
| 26/09/2016 | 3.9 |
| 26/09/2016 | 3.9 |
| 26/09/2016 | 3.9 |
| 26/09/2016 | 3.8 |
| 26/09/2016 | 4 |
| 26/09/2016 | 4.1 |
| 26/09/2016 | 4.1 |
| 26/09/2016 | 3.7 |
| 26/09/2016 | 3.5 |
| 26/09/2016 | 3 |
| 26/09/2016 | 2.9 |
| 26/09/2016 | 2.7 |
| 27/09/2016 | 2.5 |
| 27/09/2016 | 2.5 |
| 27/09/2016 | 2.5 |
| 27/09/2016 | 2.6 |
| 27/09/2016 | 2.7 |
| 27/09/2016 | 3.2 |
| 27/09/2016 | 3.6 |
| 27/09/2016 | 3.8 |
| 27/09/2016 | 3.9 |
| 27/09/2016 | 4.1 |
| 27/09/2016 | 4 |
| 27/09/2016 | 4 |
| 27/09/2016 | 4 |
| 27/09/2016 | 4 |
| 27/09/2016 | 4 |
| 27/09/2016 | 3.9 |
| 27/09/2016 | 4 |
| 27/09/2016 | 4 |
| 27/09/2016 | 4.1 |
| 27/09/2016 | 3.9 |
| 27/09/2016 | 3.6 |
| 27/09/2016 | 3.1 |
| 27/09/2016 | 2.7 |
| 27/09/2016 | 2.7 |
| 28/09/2016 | 2.6 |
| 28/09/2016 | 2.5 |
| 28/09/2016 | 2.5 |
| 28/09/2016 | 2.7 |
| 28/09/2016 | 2.7 |
| 28/09/2016 | 3.3 |
| 28/09/2016 | 3.7 |
| 28/09/2016 | 3.9 |
| 28/09/2016 | 4 |
| 28/09/2016 | 4 |
| 28/09/2016 | 4.1 |
| 28/09/2016 | 4.2 |
| 28/09/2016 | 4.2 |
| 28/09/2016 | 4.1 |
| 28/09/2016 | 3.9 |
| 28/09/2016 | 4 |
| 28/09/2016 | 4 |
| 28/09/2016 | 4.1 |
| 28/09/2016 | 4.1 |
| 28/09/2016 | 3.9 |
| 28/09/2016 | 3.6 |
| 28/09/2016 | 3.1 |
| 28/09/2016 | 2.8 |
| 28/09/2016 | 2.5 |
| 29/09/2016 | 2.6 |
| 29/09/2016 | 2.5 |
| 29/09/2016 | 2.5 |
| 29/09/2016 | 2.4 |
| 29/09/2016 | 2.7 |
| 29/09/2016 | 3.3 |
| 29/09/2016 | 3.6 |
| 29/09/2016 | 3.8 |
| 29/09/2016 | 4 |
| 29/09/2016 | 3.9 |
| 29/09/2016 | 4 |
| 29/09/2016 | 4 |
| 29/09/2016 | 3.8 |
| 29/09/2016 | 3.8 |
| 29/09/2016 | 3.8 |
| 29/09/2016 | 3.8 |
| 29/09/2016 | 3.9 |
| 29/09/2016 | 3.8 |
| 29/09/2016 | 4 |
| 29/09/2016 | 3.8 |
| 29/09/2016 | 3.3 |
| 29/09/2016 | 3.1 |
| 29/09/2016 | 2.8 |
| 29/09/2016 | 2.5 |
| 30/09/2016 | 2.4 |
| 30/09/2016 | 2.5 |
| 30/09/2016 | 2.5 |
| 30/09/2016 | 2.4 |
| 30/09/2016 | 2.7 |
| 30/09/2016 | 3.2 |
| 30/09/2016 | 3.6 |
| 30/09/2016 | 3.8 |
| 30/09/2016 | 4 |
| 30/09/2016 | 4 |
| 30/09/2016 | 4 |
| 30/09/2016 | 4 |
| 30/09/2016 | 3.9 |
| 30/09/2016 | 4 |
| 30/09/2016 | 3.9 |
| 30/09/2016 | 3.8 |
| 30/09/2016 | 3.8 |
| 30/09/2016 | 3.9 |
| 30/09/2016 | 3.9 |
| 30/09/2016 | 3.7 |
| 30/09/2016 | 3.2 |
| 30/09/2016 | 3 |
| 30/09/2016 | 2.9 |
| 30/09/2016 | 2.6 |
| 01/10/2016 | 2.6 |
| 01/10/2016 | 2.5 |
| 01/10/2016 | 2.4 |
| 01/10/2016 | 2.4 |
| 01/10/2016 | 2.4 |
| 01/10/2016 | 2.5 |
| 01/10/2016 | 2.8 |
| 01/10/2016 | 2.9 |
| 01/10/2016 | 3.1 |
| 01/10/2016 | 3.4 |
| 01/10/2016 | 3.4 |
| 01/10/2016 | 3.4 |
| 01/10/2016 | 3.3 |
| 01/10/2016 | 3.3 |
| 01/10/2016 | 3.2 |
| 01/10/2016 | 3.3 |
| 01/10/2016 | 3.2 |
| 01/10/2016 | 3.5 |
| 01/10/2016 | 3.6 |
| 01/10/2016 | 3.3 |
| 01/10/2016 | 3.1 |
| 01/10/2016 | 2.9 |
| 01/10/2016 | 2.8 |
| 01/10/2016 | 2.5 |
| 02/10/2016 | 2.5 |
| 02/10/2016 | 2.5 |
| 02/10/2016 | 2.4 |
| 02/10/2016 | 2.4 |
| 02/10/2016 | 2.5 |
| 02/10/2016 | 2.5 |
| 02/10/2016 | 2.5 |
| 02/10/2016 | 2.7 |
| 02/10/2016 | 2.9 |
| 02/10/2016 | 3.1 |
| 02/10/2016 | 3.3 |
| 02/10/2016 | 3.3 |
| 02/10/2016 | 3.3 |
| 02/10/2016 | 3.2 |
| 02/10/2016 | 3 |
| 02/10/2016 | 3 |
| 02/10/2016 | 3.3 |
| 02/10/2016 | 3.2 |
| 02/10/2016 | 3.3 |
| 02/10/2016 | 3.3 |
| 02/10/2016 | 3.2 |
| 02/10/2016 | 2.8 |
| 02/10/2016 | 2.6 |
| 02/10/2016 | 2.7 |
| 03/10/2016 | 2.5 |
| 03/10/2016 | 2.4 |
| 03/10/2016 | 2.5 |
| 03/10/2016 | 2.5 |
| 03/10/2016 | 2.4 |
| 03/10/2016 | 2.6 |
| 03/10/2016 | 2.6 |
| 03/10/2016 | 2.8 |
| 03/10/2016 | 2.9 |
| 03/10/2016 | 3.3 |
| 03/10/2016 | 3.4 |
| 03/10/2016 | 3.4 |
| 03/10/2016 | 3.3 |
| 03/10/2016 | 3.2 |
| 03/10/2016 | 3.3 |
| 03/10/2016 | 3.2 |
| 03/10/2016 | 3.1 |
| 03/10/2016 | 3.3 |
| 03/10/2016 | 3.3 |
| 03/10/2016 | 3.2 |
| 03/10/2016 | 3.1 |
| 03/10/2016 | 2.7 |
| 03/10/2016 | 2.7 |
| 03/10/2016 | 2.7 |
| 04/10/2016 | 2.6 |
| 04/10/2016 | 2.5 |
| 04/10/2016 | 2.5 |
| 04/10/2016 | 2.4 |
| 04/10/2016 | 2.7 |
| 04/10/2016 | 3.1 |
| 04/10/2016 | 3.5 |
| 04/10/2016 | 3.9 |
| 04/10/2016 | 4 |
| 04/10/2016 | 4 |
| 04/10/2016 | 4 |
| 04/10/2016 | 4.1 |
| 04/10/2016 | 4.1 |
| 04/10/2016 | 4 |
| 04/10/2016 | 3.8 |
| 04/10/2016 | 4 |
| 04/10/2016 | 4 |
| 04/10/2016 | 4 |
| 04/10/2016 | 4.1 |
| 04/10/2016 | 3.9 |
| 04/10/2016 | 3.4 |
| 04/10/2016 | 3.1 |
| 04/10/2016 | 2.8 |
| 04/10/2016 | 2.6 |
| 05/10/2016 | 2.4 |
| 05/10/2016 | 2.4 |
| 05/10/2016 | 2.6 |
| 05/10/2016 | 2.5 |
| 05/10/2016 | 2.7 |
| 05/10/2016 | 3.2 |
| 05/10/2016 | 3.6 |
| 05/10/2016 | 3.8 |
| 05/10/2016 | 4 |
| 05/10/2016 | 4.1 |
| 05/10/2016 | 4.2 |
| 05/10/2016 | 4.2 |
| 05/10/2016 | 4.2 |
| 05/10/2016 | 4.2 |
| 05/10/2016 | 3.9 |
| 05/10/2016 | 4 |
| 05/10/2016 | 4 |
| 05/10/2016 | 4.1 |
| 05/10/2016 | 4.2 |
| 05/10/2016 | 3.9 |
| 05/10/2016 | 3.4 |
| 05/10/2016 | 3.1 |
| 05/10/2016 | 2.8 |
| 05/10/2016 | 2.6 |
| 06/10/2016 | 2.4 |
| 06/10/2016 | 2.4 |
| 06/10/2016 | 2.5 |
| 06/10/2016 | 2.5 |
| 06/10/2016 | 2.7 |
| 06/10/2016 | 3.2 |
| 06/10/2016 | 3.6 |
| 06/10/2016 | 3.8 |
| 06/10/2016 | 3.9 |
| 06/10/2016 | 4 |
| 06/10/2016 | 4.1 |
| 06/10/2016 | 4.1 |
| 06/10/2016 | 3.9 |
| 06/10/2016 | 3.8 |
| 06/10/2016 | 3.8 |
| 06/10/2016 | 3.7 |
| 06/10/2016 | 3.9 |
| 06/10/2016 | 4 |
| 06/10/2016 | 4.1 |
| 06/10/2016 | 3.8 |
| 06/10/2016 | 3.3 |
| 06/10/2016 | 3.1 |
| 06/10/2016 | 2.8 |
| 06/10/2016 | 2.6 |
| 07/10/2016 | 2.4 |
| 07/10/2016 | 2.4 |
| 07/10/2016 | 2.3 |
| 07/10/2016 | 2.5 |
| 07/10/2016 | 2.7 |
| 07/10/2016 | 3.1 |
| 07/10/2016 | 3.5 |
| 07/10/2016 | 3.8 |
| 07/10/2016 | 3.9 |
| 07/10/2016 | 4 |
| 07/10/2016 | 4.1 |
| 07/10/2016 | 4.1 |
| 07/10/2016 | 3.9 |
| 07/10/2016 | 4 |
| 07/10/2016 | 3.9 |
| 07/10/2016 | 3.8 |
| 07/10/2016 | 4 |
| 07/10/2016 | 4 |
| 07/10/2016 | 4 |
| 07/10/2016 | 3.7 |
| 07/10/2016 | 3.3 |
| 07/10/2016 | 3 |
| 07/10/2016 | 2.7 |
| 07/10/2016 | 2.5 |
| 08/10/2016 | 2.4 |
| 08/10/2016 | 2.3 |
| 08/10/2016 | 2.4 |
| 08/10/2016 | 2.4 |
| 08/10/2016 | 2.5 |
| 08/10/2016 | 2.6 |
| 08/10/2016 | 2.7 |
| 08/10/2016 | 3 |
| 08/10/2016 | 3.2 |
| 08/10/2016 | 3.3 |
| 08/10/2016 | 3.5 |
| 08/10/2016 | 3.5 |
| 08/10/2016 | 3.3 |
| 08/10/2016 | 3.4 |
| 08/10/2016 | 3.2 |
| 08/10/2016 | 3.2 |
| 08/10/2016 | 3.4 |
| 08/10/2016 | 3.4 |
| 08/10/2016 | 3.6 |
| 08/10/2016 | 3.4 |
| 08/10/2016 | 3.1 |
| 08/10/2016 | 3 |
| 08/10/2016 | 2.7 |
| 08/10/2016 | 2.5 |
| 09/10/2016 | 2.5 |
| 09/10/2016 | 2.5 |
| 09/10/2016 | 2.4 |
| 09/10/2016 | 2.4 |
| 09/10/2016 | 2.5 |
| 09/10/2016 | 2.6 |
| 09/10/2016 | 2.6 |
| 09/10/2016 | 2.8 |
| 09/10/2016 | 3 |
| 09/10/2016 | 3.2 |
| 09/10/2016 | 3.2 |
| 09/10/2016 | 3.3 |
| 09/10/2016 | 3.3 |
| 09/10/2016 | 3.2 |
| 09/10/2016 | 3.1 |
| 09/10/2016 | 3.1 |
| 09/10/2016 | 3.2 |
| 09/10/2016 | 3.4 |
| 09/10/2016 | 3.5 |
| 09/10/2016 | 3.3 |
| 09/10/2016 | 3 |
| 09/10/2016 | 2.9 |
| 09/10/2016 | 2.7 |
| 09/10/2016 | 2.6 |
| 10/10/2016 | 2.5 |
| 10/10/2016 | 2.3 |
| 10/10/2016 | 2.5 |
| 10/10/2016 | 2.4 |
| 10/10/2016 | 2.7 |
| 10/10/2016 | 3.3 |
| 10/10/2016 | 3.7 |
| 10/10/2016 | 3.8 |
| 10/10/2016 | 3.9 |
| 10/10/2016 | 4.1 |
| 10/10/2016 | 4 |
| 10/10/2016 | 4 |
| 10/10/2016 | 4 |
| 10/10/2016 | 4 |
| 10/10/2016 | 4 |
| 10/10/2016 | 3.9 |
| 10/10/2016 | 4 |
| 10/10/2016 | 4 |
| 10/10/2016 | 4.2 |
| 10/10/2016 | 3.8 |
| 10/10/2016 | 3.3 |
| 10/10/2016 | 3.1 |
| 10/10/2016 | 2.8 |
| 10/10/2016 | 2.5 |
| 11/10/2016 | 2.4 |
| 11/10/2016 | 2.3 |
| 11/10/2016 | 2.5 |
| 11/10/2016 | 2.5 |
| 11/10/2016 | 2.7 |
| 11/10/2016 | 3.2 |
| 11/10/2016 | 3.7 |
| 11/10/2016 | 3.8 |
| 11/10/2016 | 3.9 |
| 11/10/2016 | 4 |
| 11/10/2016 | 4.1 |
| 11/10/2016 | 4.1 |
| 11/10/2016 | 4.1 |
| 11/10/2016 | 4 |
| 11/10/2016 | 3.9 |
| 11/10/2016 | 3.9 |
| 11/10/2016 | 4.2 |
| 11/10/2016 | 4.2 |
| 11/10/2016 | 4.2 |
| 11/10/2016 | 3.9 |
| 11/10/2016 | 3.4 |
| 11/10/2016 | 2.9 |
| 11/10/2016 | 2.8 |
| 11/10/2016 | 2.6 |
| 12/10/2016 | 2.4 |
| 12/10/2016 | 2.4 |
| 12/10/2016 | 2.4 |
| 12/10/2016 | 2.5 |
| 12/10/2016 | 2.8 |
| 12/10/2016 | 3.3 |
| 12/10/2016 | 3.6 |
| 12/10/2016 | 4 |
| 12/10/2016 | 4.1 |
| 12/10/2016 | 4.2 |
| 12/10/2016 | 4.3 |
| 12/10/2016 | 4.3 |
| 12/10/2016 | 4.1 |
| 12/10/2016 | 4 |
| 12/10/2016 | 4 |
| 12/10/2016 | 3.9 |
| 12/10/2016 | 4 |
| 12/10/2016 | 4.1 |
| 12/10/2016 | 4.3 |
| 12/10/2016 | 3.9 |
| 12/10/2016 | 3.4 |
| 12/10/2016 | 3 |
| 12/10/2016 | 2.9 |
| 12/10/2016 | 2.6 |
| 13/10/2016 | 2.4 |
| 13/10/2016 | 2.4 |
| 13/10/2016 | 2.4 |
| 13/10/2016 | 2.5 |
| 13/10/2016 | 2.8 |
| 13/10/2016 | 3.3 |
| 13/10/2016 | 3.6 |
| 13/10/2016 | 3.9 |
| 13/10/2016 | 4 |
| 13/10/2016 | 4.1 |
| 13/10/2016 | 4 |
| 13/10/2016 | 4 |
| 13/10/2016 | 3.9 |
| 13/10/2016 | 3.9 |
| 13/10/2016 | 3.9 |
| 13/10/2016 | 3.8 |
| 13/10/2016 | 3.9 |
| 13/10/2016 | 4 |
| 13/10/2016 | 4.2 |
| 13/10/2016 | 3.6 |
| 13/10/2016 | 3.4 |
| 13/10/2016 | 3 |
| 13/10/2016 | 2.9 |
| 13/10/2016 | 2.6 |
| 14/10/2016 | 2.4 |
| 14/10/2016 | 2.4 |
| 14/10/2016 | 2.4 |
| 14/10/2016 | 2.5 |
| 14/10/2016 | 2.7 |
| 14/10/2016 | 3.2 |
| 14/10/2016 | 3.5 |
| 14/10/2016 | 3.9 |
| 14/10/2016 | 4 |
| 14/10/2016 | 4.1 |
| 14/10/2016 | 4.2 |
| 14/10/2016 | 4.1 |
| 14/10/2016 | 4 |
| 14/10/2016 | 3.8 |
| 14/10/2016 | 3.8 |
| 14/10/2016 | 3.9 |
| 14/10/2016 | 3.9 |
| 14/10/2016 | 4 |
| 14/10/2016 | 4 |
| 14/10/2016 | 3.7 |
| 14/10/2016 | 3.3 |
| 14/10/2016 | 3.1 |
| 14/10/2016 | 2.8 |
| 14/10/2016 | 2.5 |
| 15/10/2016 | 2.4 |
| 15/10/2016 | 2.4 |
| 15/10/2016 | 2.5 |
| 15/10/2016 | 2.5 |
| 15/10/2016 | 2.5 |
| 15/10/2016 | 2.7 |
| 15/10/2016 | 2.8 |
| 15/10/2016 | 2.9 |
| 15/10/2016 | 3.3 |
| 15/10/2016 | 3.4 |
| 15/10/2016 | 3.4 |
| 15/10/2016 | 3.5 |
| 15/10/2016 | 3.3 |
| 15/10/2016 | 3.2 |
| 15/10/2016 | 3.2 |
| 15/10/2016 | 3.2 |
| 15/10/2016 | 3.3 |
| 15/10/2016 | 3.6 |
| 15/10/2016 | 3.6 |
| 15/10/2016 | 3.4 |
| 15/10/2016 | 3.1 |
| 15/10/2016 | 2.8 |
| 15/10/2016 | 2.7 |
| 15/10/2016 | 2.6 |
| 16/10/2016 | 2.3 |
| 16/10/2016 | 2.3 |
| 16/10/2016 | 2.4 |
| 16/10/2016 | 2.4 |
| 16/10/2016 | 2.3 |
| 16/10/2016 | 2.4 |
| 16/10/2016 | 2.7 |
| 16/10/2016 | 2.7 |
| 16/10/2016 | 2.9 |
| 16/10/2016 | 3.2 |
| 16/10/2016 | 3.2 |
| 16/10/2016 | 3.4 |
| 16/10/2016 | 3.3 |
| 16/10/2016 | 3.2 |
| 16/10/2016 | 3.1 |
| 16/10/2016 | 3.2 |
| 16/10/2016 | 3.2 |
| 16/10/2016 | 3.5 |
| 16/10/2016 | 3.5 |
| 16/10/2016 | 3.3 |
| 16/10/2016 | 3 |
| 16/10/2016 | 2.9 |
| 16/10/2016 | 2.7 |
| 16/10/2016 | 2.6 |
| 17/10/2016 | 2.5 |
| 17/10/2016 | 2.3 |
| 17/10/2016 | 2.5 |
| 17/10/2016 | 2.4 |
| 17/10/2016 | 2.6 |
| 17/10/2016 | 3.1 |
| 17/10/2016 | 3.4 |
| 17/10/2016 | 3.7 |
| 17/10/2016 | 3.9 |
| 17/10/2016 | 3.9 |
| 17/10/2016 | 4 |
| 17/10/2016 | 4 |
| 17/10/2016 | 4 |
| 17/10/2016 | 3.9 |
| 17/10/2016 | 3.9 |
| 17/10/2016 | 3.9 |
| 17/10/2016 | 4 |
| 17/10/2016 | 4 |
| 17/10/2016 | 3.9 |
| 17/10/2016 | 3.7 |
| 17/10/2016 | 3.3 |
| 17/10/2016 | 3 |
| 17/10/2016 | 2.8 |
| 17/10/2016 | 2.5 |
| 18/10/2016 | 2.4 |
| 18/10/2016 | 2.4 |
| 18/10/2016 | 2.5 |
| 18/10/2016 | 2.4 |
| 18/10/2016 | 2.6 |
| 18/10/2016 | 3.1 |
| 18/10/2016 | 3.4 |
| 18/10/2016 | 3.7 |
| 18/10/2016 | 3.9 |
| 18/10/2016 | 4.1 |
| 18/10/2016 | 4 |
| 18/10/2016 | 3.9 |
| 18/10/2016 | 3.9 |
| 18/10/2016 | 3.7 |
| 18/10/2016 | 3.7 |
| 18/10/2016 | 3.8 |
| 18/10/2016 | 4 |
| 18/10/2016 | 4.2 |
| 18/10/2016 | 4.1 |
| 18/10/2016 | 3.8 |
| 18/10/2016 | 3.4 |
| 18/10/2016 | 3.1 |
| 18/10/2016 | 2.8 |
| 18/10/2016 | 2.6 |
| 19/10/2016 | 2.5 |
| 19/10/2016 | 2.4 |
| 19/10/2016 | 2.4 |
| 19/10/2016 | 2.5 |
| 19/10/2016 | 2.7 |
| 19/10/2016 | 3.2 |
| 19/10/2016 | 3.6 |
| 19/10/2016 | 3.8 |
| 19/10/2016 | 4 |
| 19/10/2016 | 4 |
| 19/10/2016 | 4.1 |
| 19/10/2016 | 4.1 |
| 19/10/2016 | 4 |
| 19/10/2016 | 3.9 |
| 19/10/2016 | 3.8 |
| 19/10/2016 | 3.9 |
| 19/10/2016 | 4.1 |
| 19/10/2016 | 4.1 |
| 19/10/2016 | 4.1 |
| 19/10/2016 | 3.8 |
| 19/10/2016 | 3.4 |
| 19/10/2016 | 2.9 |
| 19/10/2016 | 2.7 |
| 19/10/2016 | 2.6 |
| 20/10/2016 | 2.5 |
| 20/10/2016 | 2.4 |
| 20/10/2016 | 2.4 |
| 20/10/2016 | 2.5 |
| 20/10/2016 | 2.7 |
| 20/10/2016 | 3.1 |
| 20/10/2016 | 3.5 |
| 20/10/2016 | 3.8 |
| 20/10/2016 | 4 |
| 20/10/2016 | 4 |
| 20/10/2016 | 4.1 |
| 20/10/2016 | 4 |
| 20/10/2016 | 3.9 |
| 20/10/2016 | 3.8 |
| 20/10/2016 | 3.8 |
| 20/10/2016 | 3.8 |
| 20/10/2016 | 4 |
| 20/10/2016 | 4 |
| 20/10/2016 | 3.8 |
| 20/10/2016 | 3.5 |
| 20/10/2016 | 3.1 |
| 20/10/2016 | 2.9 |
| 20/10/2016 | 2.7 |
| 20/10/2016 | 2.5 |
| 21/10/2016 | 2.5 |
| 21/10/2016 | 2.4 |
| 21/10/2016 | 2.4 |
| 21/10/2016 | 2.5 |
| 21/10/2016 | 2.6 |
| 21/10/2016 | 3.1 |
| 21/10/2016 | 3.5 |
| 21/10/2016 | 3.8 |
| 21/10/2016 | 4 |
| 21/10/2016 | 4.1 |
| 21/10/2016 | 4.1 |
| 21/10/2016 | 4 |
| 21/10/2016 | 3.8 |
| 21/10/2016 | 3.8 |
| 21/10/2016 | 3.8 |
| 21/10/2016 | 3.8 |
| 21/10/2016 | 3.9 |
| 21/10/2016 | 4 |
| 21/10/2016 | 3.9 |
| 21/10/2016 | 3.5 |
| 21/10/2016 | 3.1 |
| 21/10/2016 | 2.8 |
| 21/10/2016 | 2.8 |
| 21/10/2016 | 2.6 |
| 22/10/2016 | 2.5 |
| 22/10/2016 | 2.4 |
| 22/10/2016 | 2.5 |
| 22/10/2016 | 2.5 |
| 22/10/2016 | 2.4 |
| 22/10/2016 | 2.6 |
| 22/10/2016 | 2.7 |
| 22/10/2016 | 2.9 |
| 22/10/2016 | 3.2 |
| 22/10/2016 | 3.3 |
| 22/10/2016 | 3.5 |
| 22/10/2016 | 3.5 |
| 22/10/2016 | 3.2 |
| 22/10/2016 | 3.2 |
| 22/10/2016 | 3.1 |
| 22/10/2016 | 3.2 |
| 22/10/2016 | 3.3 |
| 22/10/2016 | 3.5 |
| 22/10/2016 | 3.5 |
| 22/10/2016 | 3.2 |
| 22/10/2016 | 3 |
| 22/10/2016 | 2.8 |
| 22/10/2016 | 2.8 |
| 22/10/2016 | 2.5 |
| 23/10/2016 | 2.4 |
| 23/10/2016 | 2.4 |
| 23/10/2016 | 2.5 |
| 23/10/2016 | 2.4 |
| 23/10/2016 | 2.5 |
| 23/10/2016 | 2.4 |
| 23/10/2016 | 2.4 |
| 23/10/2016 | 2.7 |
| 23/10/2016 | 3 |
| 23/10/2016 | 3.2 |
| 23/10/2016 | 3.3 |
| 23/10/2016 | 3.4 |
| 23/10/2016 | 3.3 |
| 23/10/2016 | 3.1 |
| 23/10/2016 | 3 |
| 23/10/2016 | 3.2 |
| 23/10/2016 | 3.2 |
| 23/10/2016 | 3.4 |
| 23/10/2016 | 3.4 |
| 23/10/2016 | 3.2 |
| 23/10/2016 | 2.9 |
| 23/10/2016 | 2.9 |
| 23/10/2016 | 2.6 |
| 23/10/2016 | 2.5 |
| 24/10/2016 | 2.4 |
| 24/10/2016 | 2.4 |
| 24/10/2016 | 2.4 |
| 24/10/2016 | 2.5 |
| 24/10/2016 | 2.7 |
| 24/10/2016 | 3 |
| 24/10/2016 | 3.5 |
| 24/10/2016 | 3.9 |
| 24/10/2016 | 4 |
| 24/10/2016 | 4.2 |
| 24/10/2016 | 4.1 |
| 24/10/2016 | 4.1 |
| 24/10/2016 | 4 |
| 24/10/2016 | 3.9 |
| 24/10/2016 | 3.8 |
| 24/10/2016 | 3.9 |
| 24/10/2016 | 4 |
| 24/10/2016 | 4.1 |
| 24/10/2016 | 4.1 |
| 24/10/2016 | 3.7 |
| 24/10/2016 | 3.3 |
| 24/10/2016 | 3 |
| 24/10/2016 | 2.7 |
| 24/10/2016 | 2.7 |
| 25/10/2016 | 2.5 |
| 25/10/2016 | 2.5 |
| 25/10/2016 | 2.4 |
| 25/10/2016 | 2.5 |
| 25/10/2016 | 2.7 |
| 25/10/2016 | 3 |
| 25/10/2016 | 3.5 |
| 25/10/2016 | 3.9 |
| 25/10/2016 | 4 |
| 25/10/2016 | 4.2 |
| 25/10/2016 | 4.1 |
| 25/10/2016 | 4.1 |
| 25/10/2016 | 4 |
| 25/10/2016 | 3.9 |
| 25/10/2016 | 3.9 |
| 25/10/2016 | 4 |
| 25/10/2016 | 4 |
| 25/10/2016 | 4.3 |
| 25/10/2016 | 4.1 |
| 25/10/2016 | 3.9 |
| 25/10/2016 | 3.4 |
| 25/10/2016 | 3.1 |
| 25/10/2016 | 2.8 |
| 25/10/2016 | 2.6 |
| 26/10/2016 | 2.6 |
| 26/10/2016 | 2.5 |
| 26/10/2016 | 2.5 |
| 26/10/2016 | 2.6 |
| 26/10/2016 | 2.8 |
| 26/10/2016 | 3.1 |
| 26/10/2016 | 3.6 |
| 26/10/2016 | 3.9 |
| 26/10/2016 | 4.1 |
| 26/10/2016 | 4.2 |
| 26/10/2016 | 4.3 |
| 26/10/2016 | 4.3 |
| 26/10/2016 | 4.2 |
| 26/10/2016 | 4 |
| 26/10/2016 | 3.9 |
| 26/10/2016 | 4.1 |
| 26/10/2016 | 4.1 |
| 26/10/2016 | 4.2 |
| 26/10/2016 | 4.1 |
| 26/10/2016 | 3.7 |
| 26/10/2016 | 3.4 |
| 26/10/2016 | 3 |
| 26/10/2016 | 2.9 |
| 26/10/2016 | 2.6 |
| 27/10/2016 | 2.4 |
| 27/10/2016 | 2.6 |
| 27/10/2016 | 2.5 |
| 27/10/2016 | 2.6 |
| 27/10/2016 | 2.8 |
| 27/10/2016 | 3.1 |
| 27/10/2016 | 3.6 |
| 27/10/2016 | 3.8 |
| 27/10/2016 | 4.1 |
| 27/10/2016 | 4.1 |
| 27/10/2016 | 4.2 |
| 27/10/2016 | 4.2 |
| 27/10/2016 | 3.9 |
| 27/10/2016 | 3.8 |
| 27/10/2016 | 3.8 |
| 27/10/2016 | 3.8 |
| 27/10/2016 | 4 |
| 27/10/2016 | 4.1 |
| 27/10/2016 | 4 |
| 27/10/2016 | 3.7 |
| 27/10/2016 | 3.2 |
| 27/10/2016 | 3 |
| 27/10/2016 | 2.7 |
| 27/10/2016 | 2.6 |
| 28/10/2016 | 2.4 |
| 28/10/2016 | 2.4 |
| 28/10/2016 | 2.5 |
| 28/10/2016 | 2.6 |
| 28/10/2016 | 2.7 |
| 28/10/2016 | 3 |
| 28/10/2016 | 3.5 |
| 28/10/2016 | 3.8 |
| 28/10/2016 | 4.1 |
| 28/10/2016 | 4.2 |
| 28/10/2016 | 4.3 |
| 28/10/2016 | 4.2 |
| 28/10/2016 | 4 |
| 28/10/2016 | 4 |
| 28/10/2016 | 3.8 |
| 28/10/2016 | 4 |
| 28/10/2016 | 3.9 |
| 28/10/2016 | 4.1 |
| 28/10/2016 | 3.9 |
| 28/10/2016 | 3.6 |
| 28/10/2016 | 3.2 |
| 28/10/2016 | 3.1 |
| 28/10/2016 | 2.8 |
| 28/10/2016 | 2.6 |
| 29/10/2016 | 2.4 |
| 29/10/2016 | 2.4 |
| 29/10/2016 | 2.4 |
| 29/10/2016 | 2.4 |
| 29/10/2016 | 2.4 |
| 29/10/2016 | 2.7 |
| 29/10/2016 | 2.9 |
| 29/10/2016 | 3.1 |
| 29/10/2016 | 3.3 |
| 29/10/2016 | 3.6 |
| 29/10/2016 | 3.7 |
| 29/10/2016 | 3.6 |
| 29/10/2016 | 3.6 |
| 29/10/2016 | 3.5 |
| 29/10/2016 | 3.4 |
| 29/10/2016 | 3.4 |
| 29/10/2016 | 3.6 |
| 29/10/2016 | 3.7 |
| 29/10/2016 | 3.9 |
| 29/10/2016 | 3.4 |
| 29/10/2016 | 3.3 |
| 29/10/2016 | 3 |
| 29/10/2016 | 2.8 |
| 29/10/2016 | 2.5 |
| 30/10/2016 | 2.5 |
| 30/10/2016 | 2.4 |
| 30/10/2016 | 2.4 |
| 30/10/2016 | 2.3 |
| 30/10/2016 | 2.3 |
| 30/10/2016 | 2.4 |
| 30/10/2016 | 2.5 |
| 30/10/2016 | 2.6 |
| 30/10/2016 | 2.7 |
| 30/10/2016 | 3 |
| 30/10/2016 | 3.2 |
| 30/10/2016 | 3.2 |
| 30/10/2016 | 3.4 |
| 30/10/2016 | 3.3 |
| 30/10/2016 | 3.3 |
| 30/10/2016 | 3.3 |
| 30/10/2016 | 3.5 |
| 30/10/2016 | 3.6 |
| 30/10/2016 | 3.6 |
| 30/10/2016 | 3.5 |
| 30/10/2016 | 3.4 |
| 30/10/2016 | 3.1 |
| 30/10/2016 | 2.9 |
| 30/10/2016 | 2.6 |
| 30/10/2016 | 2.6 |
| 31/10/2016 | 2.5 |
| 31/10/2016 | 2.5 |
| 31/10/2016 | 2.5 |
| 31/10/2016 | 2.6 |
| 31/10/2016 | 2.7 |
| 31/10/2016 | 3.3 |
| 31/10/2016 | 3.6 |
| 31/10/2016 | 3.9 |
| 31/10/2016 | 3.9 |
| 31/10/2016 | 4 |
| 31/10/2016 | 4.1 |
| 31/10/2016 | 4.1 |
| 31/10/2016 | 4.2 |
| 31/10/2016 | 4.1 |
| 31/10/2016 | 4.1 |
| 31/10/2016 | 4.2 |
| 31/10/2016 | 4.4 |
| 31/10/2016 | 4.3 |
| 31/10/2016 | 4.1 |
| 31/10/2016 | 3.9 |
| 31/10/2016 | 3.5 |
| 31/10/2016 | 3.1 |
| 31/10/2016 | 2.7 |
| 31/10/2016 | 2.5 |
| 01/11/2016 | 2.4 |
| 01/11/2016 | 2.5 |
| 01/11/2016 | 2.5 |
| 01/11/2016 | 2.5 |
| 01/11/2016 | 2.7 |
| 01/11/2016 | 3.3 |
| 01/11/2016 | 3.6 |
| 01/11/2016 | 3.9 |
| 01/11/2016 | 3.9 |
| 01/11/2016 | 4.2 |
| 01/11/2016 | 4.1 |
| 01/11/2016 | 4.1 |
| 01/11/2016 | 4.1 |
| 01/11/2016 | 4.2 |
| 01/11/2016 | 4.2 |
| 01/11/2016 | 4.3 |
| 01/11/2016 | 4.7 |
| 01/11/2016 | 4.3 |
| 01/11/2016 | 4.2 |
| 01/11/2016 | 3.9 |
| 01/11/2016 | 3.4 |
| 01/11/2016 | 3 |
| 01/11/2016 | 2.8 |
| 01/11/2016 | 2.6 |
| 02/11/2016 | 2.5 |
| 02/11/2016 | 2.4 |
| 02/11/2016 | 2.6 |
| 02/11/2016 | 2.5 |
| 02/11/2016 | 2.8 |
| 02/11/2016 | 3.4 |
| 02/11/2016 | 3.8 |
| 02/11/2016 | 4 |
| 02/11/2016 | 4.1 |
| 02/11/2016 | 4.2 |
| 02/11/2016 | 4.3 |
| 02/11/2016 | 4.3 |
| 02/11/2016 | 4.3 |
| 02/11/2016 | 4.2 |
| 02/11/2016 | 4.2 |
| 02/11/2016 | 4.4 |
| 02/11/2016 | 4.5 |
| 02/11/2016 | 4.4 |
| 02/11/2016 | 4.3 |
| 02/11/2016 | 3.9 |
| 02/11/2016 | 3.5 |
| 02/11/2016 | 3.1 |
| 02/11/2016 | 2.9 |
| 02/11/2016 | 2.7 |
| 03/11/2016 | 2.5 |
| 03/11/2016 | 2.4 |
| 03/11/2016 | 2.6 |
| 03/11/2016 | 2.5 |
| 03/11/2016 | 2.8 |
| 03/11/2016 | 3.3 |
| 03/11/2016 | 3.7 |
| 03/11/2016 | 4 |
| 03/11/2016 | 4 |
| 03/11/2016 | 4.1 |
| 03/11/2016 | 4.2 |
| 03/11/2016 | 4.2 |
| 03/11/2016 | 4.2 |
| 03/11/2016 | 4.1 |
| 03/11/2016 | 4.1 |
| 03/11/2016 | 4.2 |
| 03/11/2016 | 4.4 |
| 03/11/2016 | 4.3 |
| 03/11/2016 | 4.2 |
| 03/11/2016 | 3.8 |
| 03/11/2016 | 3.4 |
| 03/11/2016 | 3.1 |
| 03/11/2016 | 2.9 |
| 03/11/2016 | 2.7 |
| 04/11/2016 | 2.5 |
| 04/11/2016 | 2.4 |
| 04/11/2016 | 2.4 |
| 04/11/2016 | 2.5 |
| 04/11/2016 | 2.8 |
| 04/11/2016 | 3.3 |
| 04/11/2016 | 3.7 |
| 04/11/2016 | 4 |
| 04/11/2016 | 4.1 |
| 04/11/2016 | 4.2 |
| 04/11/2016 | 4.3 |
| 04/11/2016 | 4.2 |
| 04/11/2016 | 4.1 |
| 04/11/2016 | 4.1 |
| 04/11/2016 | 4.1 |
| 04/11/2016 | 4.3 |
| 04/11/2016 | 4.5 |
| 04/11/2016 | 4.2 |
| 04/11/2016 | 4 |
| 04/11/2016 | 3.8 |
| 04/11/2016 | 3.4 |
| 04/11/2016 | 3 |
| 04/11/2016 | 2.8 |
| 04/11/2016 | 2.6 |
| 05/11/2016 | 2.5 |
| 05/11/2016 | 2.4 |
| 05/11/2016 | 2.5 |
| 05/11/2016 | 2.5 |
| 05/11/2016 | 2.5 |
| 05/11/2016 | 2.7 |
| 05/11/2016 | 2.9 |
| 05/11/2016 | 3.1 |
| 05/11/2016 | 3.3 |
| 05/11/2016 | 3.6 |
| 05/11/2016 | 3.6 |
| 05/11/2016 | 3.6 |
| 05/11/2016 | 3.5 |
| 05/11/2016 | 3.4 |
| 05/11/2016 | 3.4 |
| 05/11/2016 | 3.7 |
| 05/11/2016 | 3.9 |
| 05/11/2016 | 3.8 |
| 05/11/2016 | 3.6 |
| 05/11/2016 | 3.4 |
| 05/11/2016 | 3.3 |
| 05/11/2016 | 3 |
| 05/11/2016 | 2.8 |
| 05/11/2016 | 2.7 |
| 06/11/2016 | 2.4 |
| 06/11/2016 | 2.4 |
| 06/11/2016 | 2.4 |
| 06/11/2016 | 2.4 |
| 06/11/2016 | 2.5 |
| 06/11/2016 | 2.4 |
| 06/11/2016 | 2.5 |
| 06/11/2016 | 2.9 |
| 06/11/2016 | 3.1 |
| 06/11/2016 | 3.2 |
| 06/11/2016 | 3.3 |
| 06/11/2016 | 3.5 |
| 06/11/2016 | 3.4 |
| 06/11/2016 | 3.4 |
| 06/11/2016 | 3.3 |
| 06/11/2016 | 3.6 |
| 06/11/2016 | 3.6 |
| 06/11/2016 | 3.7 |
| 06/11/2016 | 3.4 |
| 06/11/2016 | 3.4 |
| 06/11/2016 | 3.2 |
| 06/11/2016 | 2.9 |
| 06/11/2016 | 2.8 |
| 06/11/2016 | 2.5 |
| 07/11/2016 | 2.4 |
| 07/11/2016 | 2.4 |
| 07/11/2016 | 2.4 |
| 07/11/2016 | 2.5 |
| 07/11/2016 | 2.8 |
| 07/11/2016 | 3.2 |
| 07/11/2016 | 3.7 |
| 07/11/2016 | 3.9 |
| 07/11/2016 | 4 |
| 07/11/2016 | 4.1 |
| 07/11/2016 | 4.3 |
| 07/11/2016 | 4.3 |
| 07/11/2016 | 4.4 |
| 07/11/2016 | 4.3 |
| 07/11/2016 | 4.3 |
| 07/11/2016 | 4.5 |
| 07/11/2016 | 4.5 |
| 07/11/2016 | 4.4 |
| 07/11/2016 | 4.3 |
| 07/11/2016 | 3.8 |
| 07/11/2016 | 3.6 |
| 07/11/2016 | 3.2 |
| 07/11/2016 | 2.8 |
| 07/11/2016 | 2.7 |
| 08/11/2016 | 2.5 |
| 08/11/2016 | 2.5 |
| 08/11/2016 | 2.4 |
| 08/11/2016 | 2.6 |
| 08/11/2016 | 2.9 |
| 08/11/2016 | 3.2 |
| 08/11/2016 | 3.7 |
| 08/11/2016 | 3.9 |
| 08/11/2016 | 4.2 |
| 08/11/2016 | 4.3 |
| 08/11/2016 | 4.3 |
| 08/11/2016 | 4.3 |
| 08/11/2016 | 4.3 |
| 08/11/2016 | 4.2 |
| 08/11/2016 | 4.3 |
| 08/11/2016 | 4.6 |
| 08/11/2016 | 4.8 |
| 08/11/2016 | 4.4 |
| 08/11/2016 | 4.3 |
| 08/11/2016 | 4 |
| 08/11/2016 | 3.5 |
| 08/11/2016 | 3.1 |
| 08/11/2016 | 2.9 |
| 08/11/2016 | 2.6 |
| 09/11/2016 | 2.6 |
| 09/11/2016 | 2.5 |
| 09/11/2016 | 2.5 |
| 09/11/2016 | 2.6 |
| 09/11/2016 | 2.9 |
| 09/11/2016 | 3.3 |
| 09/11/2016 | 3.8 |
| 09/11/2016 | 4.1 |
| 09/11/2016 | 4.2 |
| 09/11/2016 | 4.3 |
| 09/11/2016 | 4.5 |
| 09/11/2016 | 4.5 |
| 09/11/2016 | 4.5 |
| 09/11/2016 | 4.4 |
| 09/11/2016 | 4.5 |
| 09/11/2016 | 4.5 |
| 09/11/2016 | 4.6 |
| 09/11/2016 | 4.5 |
| 09/11/2016 | 4.3 |
| 09/11/2016 | 4 |
| 09/11/2016 | 3.5 |
| 09/11/2016 | 3.2 |
| 09/11/2016 | 2.9 |
| 09/11/2016 | 2.7 |
| 10/11/2016 | 2.6 |
| 10/11/2016 | 2.5 |
| 10/11/2016 | 2.5 |
| 10/11/2016 | 2.6 |
| 10/11/2016 | 2.9 |
| 10/11/2016 | 3.3 |
| 10/11/2016 | 3.8 |
| 10/11/2016 | 4.1 |
| 10/11/2016 | 4.2 |
| 10/11/2016 | 4.3 |
| 10/11/2016 | 4.4 |
| 10/11/2016 | 4.4 |
| 10/11/2016 | 4.2 |
| 10/11/2016 | 4.1 |
| 10/11/2016 | 4.2 |
| 10/11/2016 | 4.4 |
| 10/11/2016 | 4.5 |
| 10/11/2016 | 4.4 |
| 10/11/2016 | 4.2 |
| 10/11/2016 | 3.8 |
| 10/11/2016 | 3.5 |
| 10/11/2016 | 3.2 |
| 10/11/2016 | 3 |
| 10/11/2016 | 2.7 |
| 11/11/2016 | 2.5 |
| 11/11/2016 | 2.6 |
| 11/11/2016 | 2.5 |
| 11/11/2016 | 2.6 |
| 11/11/2016 | 2.9 |
| 11/11/2016 | 3.2 |
| 11/11/2016 | 3.7 |
| 11/11/2016 | 4 |
| 11/11/2016 | 4.2 |
| 11/11/2016 | 4.4 |
| 11/11/2016 | 4.5 |
| 11/11/2016 | 4.4 |
| 11/11/2016 | 4.3 |
| 11/11/2016 | 4.3 |
| 11/11/2016 | 4.3 |
| 11/11/2016 | 4.4 |
| 11/11/2016 | 4.6 |
| 11/11/2016 | 4.3 |
| 11/11/2016 | 4.1 |
| 11/11/2016 | 3.9 |
| 11/11/2016 | 3.5 |
| 11/11/2016 | 3.1 |
| 11/11/2016 | 2.9 |
| 11/11/2016 | 2.6 |
| 12/11/2016 | 2.6 |
| 12/11/2016 | 2.5 |
| 12/11/2016 | 2.4 |
| 12/11/2016 | 2.4 |
| 12/11/2016 | 2.6 |
| 12/11/2016 | 2.6 |
| 12/11/2016 | 2.9 |
| 12/11/2016 | 3.2 |
| 12/11/2016 | 3.4 |
| 12/11/2016 | 3.7 |
| 12/11/2016 | 3.8 |
| 12/11/2016 | 3.7 |
| 12/11/2016 | 3.6 |
| 12/11/2016 | 3.6 |
| 12/11/2016 | 3.7 |
| 12/11/2016 | 3.6 |
| 12/11/2016 | 3.9 |
| 12/11/2016 | 3.8 |
| 12/11/2016 | 3.8 |
| 12/11/2016 | 3.5 |
| 12/11/2016 | 3.3 |
| 12/11/2016 | 3 |
| 12/11/2016 | 2.8 |
| 12/11/2016 | 2.7 |
| 13/11/2016 | 2.6 |
| 13/11/2016 | 2.5 |
| 13/11/2016 | 2.4 |
| 13/11/2016 | 2.5 |
| 13/11/2016 | 2.4 |
| 13/11/2016 | 2.5 |
| 13/11/2016 | 2.7 |
| 13/11/2016 | 2.9 |
| 13/11/2016 | 3.1 |
| 13/11/2016 | 3.3 |
| 13/11/2016 | 3.6 |
| 13/11/2016 | 3.6 |
| 13/11/2016 | 3.5 |
| 13/11/2016 | 3.5 |
| 13/11/2016 | 3.5 |
| 13/11/2016 | 3.7 |
| 13/11/2016 | 3.8 |
| 13/11/2016 | 3.7 |
| 13/11/2016 | 3.6 |
| 13/11/2016 | 3.5 |
| 13/11/2016 | 3.2 |
| 13/11/2016 | 3 |
| 13/11/2016 | 2.9 |
| 13/11/2016 | 2.7 |
| 14/11/2016 | 2.6 |
| 14/11/2016 | 2.5 |
| 14/11/2016 | 2.5 |
| 14/11/2016 | 2.6 |
| 14/11/2016 | 2.7 |
| 14/11/2016 | 3.2 |
| 14/11/2016 | 3.7 |
| 14/11/2016 | 4 |
| 14/11/2016 | 4.3 |
| 14/11/2016 | 4.3 |
| 14/11/2016 | 4.5 |
| 14/11/2016 | 4.5 |
| 14/11/2016 | 4.4 |
| 14/11/2016 | 4.3 |
| 14/11/2016 | 4.4 |
| 14/11/2016 | 4.5 |
| 14/11/2016 | 4.6 |
| 14/11/2016 | 4.5 |
| 14/11/2016 | 4.3 |
| 14/11/2016 | 3.9 |
| 14/11/2016 | 3.6 |
| 14/11/2016 | 3.3 |
| 14/11/2016 | 3 |
| 14/11/2016 | 2.7 |
| 15/11/2016 | 2.5 |
| 15/11/2016 | 2.6 |
| 15/11/2016 | 2.5 |
| 15/11/2016 | 2.7 |
| 15/11/2016 | 2.8 |
| 15/11/2016 | 3.4 |
| 15/11/2016 | 3.7 |
| 15/11/2016 | 4.2 |
| 15/11/2016 | 4.4 |
| 15/11/2016 | 4.5 |
| 15/11/2016 | 4.5 |
| 15/11/2016 | 4.5 |
| 15/11/2016 | 4.5 |
| 15/11/2016 | 4.4 |
| 15/11/2016 | 4.4 |
| 15/11/2016 | 4.6 |
| 15/11/2016 | 4.7 |
| 15/11/2016 | 4.7 |
| 15/11/2016 | 4.5 |
| 15/11/2016 | 4.1 |
| 15/11/2016 | 3.6 |
| 15/11/2016 | 3.2 |
| 15/11/2016 | 2.9 |
| 15/11/2016 | 2.8 |
| 16/11/2016 | 2.6 |
| 16/11/2016 | 2.5 |
| 16/11/2016 | 2.6 |
| 16/11/2016 | 2.5 |
| 16/11/2016 | 2.8 |
| 16/11/2016 | 3.3 |
| 16/11/2016 | 3.9 |
| 16/11/2016 | 4.2 |
| 16/11/2016 | 4.3 |
| 16/11/2016 | 4.5 |
| 16/11/2016 | 4.7 |
| 16/11/2016 | 4.7 |
| 16/11/2016 | 4.5 |
| 16/11/2016 | 4.4 |
| 16/11/2016 | 4.6 |
| 16/11/2016 | 4.7 |
| 16/11/2016 | 4.7 |
| 16/11/2016 | 4.5 |
| 16/11/2016 | 4.4 |
| 16/11/2016 | 4.2 |
| 16/11/2016 | 3.6 |
| 16/11/2016 | 3.3 |
| 16/11/2016 | 3 |
| 16/11/2016 | 2.8 |
| 17/11/2016 | 2.6 |
| 17/11/2016 | 2.5 |
| 17/11/2016 | 2.6 |
| 17/11/2016 | 2.5 |
| 17/11/2016 | 2.8 |
| 17/11/2016 | 3.3 |
| 17/11/2016 | 3.8 |
| 17/11/2016 | 4.1 |
| 17/11/2016 | 4.3 |
| 17/11/2016 | 4.4 |
| 17/11/2016 | 4.4 |
| 17/11/2016 | 4.4 |
| 17/11/2016 | 4.4 |
| 17/11/2016 | 4.3 |
| 17/11/2016 | 4.3 |
| 17/11/2016 | 4.5 |
| 17/11/2016 | 4.6 |
| 17/11/2016 | 4.5 |
| 17/11/2016 | 4.3 |
| 17/11/2016 | 3.9 |
| 17/11/2016 | 3.6 |
| 17/11/2016 | 3.3 |
| 17/11/2016 | 3 |
| 17/11/2016 | 2.7 |
| 18/11/2016 | 2.6 |
| 18/11/2016 | 2.5 |
| 18/11/2016 | 2.4 |
| 18/11/2016 | 2.5 |
| 18/11/2016 | 2.8 |
| 18/11/2016 | 3.2 |
| 18/11/2016 | 3.8 |
| 18/11/2016 | 4.1 |
| 18/11/2016 | 4.3 |
| 18/11/2016 | 4.5 |
| 18/11/2016 | 4.5 |
| 18/11/2016 | 4.6 |
| 18/11/2016 | 4.5 |
| 18/11/2016 | 4.3 |
| 18/11/2016 | 4.4 |
| 18/11/2016 | 4.4 |
| 18/11/2016 | 4.7 |
| 18/11/2016 | 4.6 |
| 18/11/2016 | 4.3 |
| 18/11/2016 | 3.8 |
| 18/11/2016 | 3.5 |
| 18/11/2016 | 3.2 |
| 18/11/2016 | 2.9 |
| 18/11/2016 | 2.8 |
| 19/11/2016 | 2.6 |
| 19/11/2016 | 2.5 |
| 19/11/2016 | 2.5 |
| 19/11/2016 | 2.5 |
| 19/11/2016 | 2.5 |
| 19/11/2016 | 2.7 |
| 19/11/2016 | 2.9 |
| 19/11/2016 | 3.2 |
| 19/11/2016 | 3.5 |
| 19/11/2016 | 3.8 |
| 19/11/2016 | 3.9 |
| 19/11/2016 | 3.9 |
| 19/11/2016 | 3.7 |
| 19/11/2016 | 3.7 |
| 19/11/2016 | 3.7 |
| 19/11/2016 | 3.8 |
| 19/11/2016 | 3.9 |
| 19/11/2016 | 3.9 |
| 19/11/2016 | 3.8 |
| 19/11/2016 | 3.6 |
| 19/11/2016 | 3.4 |
| 19/11/2016 | 3.1 |
| 19/11/2016 | 2.8 |
| 19/11/2016 | 2.7 |
| 20/11/2016 | 2.5 |
| 20/11/2016 | 2.4 |
| 20/11/2016 | 2.5 |
| 20/11/2016 | 2.4 |
| 20/11/2016 | 2.5 |
| 20/11/2016 | 2.6 |
| 20/11/2016 | 2.7 |
| 20/11/2016 | 3 |
| 20/11/2016 | 3.3 |
| 20/11/2016 | 3.6 |
| 20/11/2016 | 3.7 |
| 20/11/2016 | 3.7 |
| 20/11/2016 | 3.6 |
| 20/11/2016 | 3.5 |
| 20/11/2016 | 3.6 |
| 20/11/2016 | 3.6 |
| 20/11/2016 | 3.8 |
| 20/11/2016 | 3.9 |
| 20/11/2016 | 3.6 |
| 20/11/2016 | 3.6 |
| 20/11/2016 | 3.3 |
| 20/11/2016 | 3.2 |
| 20/11/2016 | 2.9 |
| 20/11/2016 | 2.7 |
| 21/11/2016 | 2.5 |
| 21/11/2016 | 2.5 |
| 21/11/2016 | 2.6 |
| 21/11/2016 | 2.5 |
| 21/11/2016 | 2.9 |
| 21/11/2016 | 3.4 |
| 21/11/2016 | 4 |
| 21/11/2016 | 4.3 |
| 21/11/2016 | 4.5 |
| 21/11/2016 | 4.5 |
| 21/11/2016 | 4.7 |
| 21/11/2016 | 4.7 |
| 21/11/2016 | 4.6 |
| 21/11/2016 | 4.5 |
| 21/11/2016 | 4.5 |
| 21/11/2016 | 4.6 |
| 21/11/2016 | 4.7 |
| 21/11/2016 | 4.6 |
| 21/11/2016 | 4.4 |
| 21/11/2016 | 4.1 |
| 21/11/2016 | 3.7 |
| 21/11/2016 | 3.4 |
| 21/11/2016 | 3.1 |
| 21/11/2016 | 2.7 |
| 22/11/2016 | 2.6 |
| 22/11/2016 | 2.5 |
| 22/11/2016 | 2.5 |
| 22/11/2016 | 2.6 |
| 22/11/2016 | 2.9 |
| 22/11/2016 | 3.4 |
| 22/11/2016 | 4 |
| 22/11/2016 | 4.3 |
| 22/11/2016 | 4.5 |
| 22/11/2016 | 4.7 |
| 22/11/2016 | 4.7 |
| 22/11/2016 | 4.7 |
| 22/11/2016 | 4.5 |
| 22/11/2016 | 4.4 |
| 22/11/2016 | 4.5 |
| 22/11/2016 | 4.7 |
| 22/11/2016 | 4.8 |
| 22/11/2016 | 4.8 |
| 22/11/2016 | 4.5 |
| 22/11/2016 | 4.1 |
| 22/11/2016 | 3.7 |
| 22/11/2016 | 3.3 |
| 22/11/2016 | 3 |
| 22/11/2016 | 2.8 |
| 23/11/2016 | 2.7 |
| 23/11/2016 | 2.6 |
| 23/11/2016 | 2.5 |
| 23/11/2016 | 2.7 |
| 23/11/2016 | 3 |
| 23/11/2016 | 3.5 |
| 23/11/2016 | 3.9 |
| 23/11/2016 | 4.3 |
| 23/11/2016 | 4.5 |
| 23/11/2016 | 4.7 |
| 23/11/2016 | 4.9 |
| 23/11/2016 | 4.9 |
| 23/11/2016 | 4.7 |
| 23/11/2016 | 4.6 |
| 23/11/2016 | 4.7 |
| 23/11/2016 | 4.8 |
| 23/11/2016 | 4.8 |
| 23/11/2016 | 4.6 |
| 23/11/2016 | 4.6 |
| 23/11/2016 | 4.1 |
| 23/11/2016 | 3.7 |
| 23/11/2016 | 3.3 |
| 23/11/2016 | 3 |
| 23/11/2016 | 2.8 |
| 24/11/2016 | 2.6 |
| 24/11/2016 | 2.6 |
| 24/11/2016 | 2.5 |
| 24/11/2016 | 2.7 |
| 24/11/2016 | 3 |
| 24/11/2016 | 3.4 |
| 24/11/2016 | 3.9 |
| 24/11/2016 | 4.2 |
| 24/11/2016 | 4.4 |
| 24/11/2016 | 4.6 |
| 24/11/2016 | 4.6 |
| 24/11/2016 | 4.6 |
| 24/11/2016 | 4.6 |
| 24/11/2016 | 4.6 |
| 24/11/2016 | 4.6 |
| 24/11/2016 | 4.6 |
| 24/11/2016 | 4.7 |
| 24/11/2016 | 4.6 |
| 24/11/2016 | 4.5 |
| 24/11/2016 | 4 |
| 24/11/2016 | 3.7 |
| 24/11/2016 | 3.3 |
| 24/11/2016 | 3 |
| 24/11/2016 | 2.9 |
| 25/11/2016 | 2.6 |
| 25/11/2016 | 2.6 |
| 25/11/2016 | 2.5 |
| 25/11/2016 | 2.6 |
| 25/11/2016 | 2.9 |
| 25/11/2016 | 3.3 |
| 25/11/2016 | 3.8 |
| 25/11/2016 | 4.2 |
| 25/11/2016 | 4.4 |
| 25/11/2016 | 4.7 |
| 25/11/2016 | 4.6 |
| 25/11/2016 | 4.8 |
| 25/11/2016 | 4.7 |
| 25/11/2016 | 4.5 |
| 25/11/2016 | 4.5 |
| 25/11/2016 | 4.7 |
| 25/11/2016 | 4.7 |
| 25/11/2016 | 4.7 |
| 25/11/2016 | 4.3 |
| 25/11/2016 | 3.9 |
| 25/11/2016 | 3.6 |
| 25/11/2016 | 3.2 |
| 25/11/2016 | 3.1 |
| 25/11/2016 | 2.7 |
| 26/11/2016 | 2.7 |
| 26/11/2016 | 2.6 |
| 26/11/2016 | 2.4 |
| 26/11/2016 | 2.6 |
| 26/11/2016 | 2.6 |
| 26/11/2016 | 2.8 |
| 26/11/2016 | 3 |
| 26/11/2016 | 3.3 |
| 26/11/2016 | 3.6 |
| 26/11/2016 | 3.8 |
| 26/11/2016 | 4 |
| 26/11/2016 | 3.9 |
| 26/11/2016 | 3.8 |
| 26/11/2016 | 3.8 |
| 26/11/2016 | 3.8 |
| 26/11/2016 | 3.9 |
| 26/11/2016 | 4 |
| 26/11/2016 | 4.1 |
| 26/11/2016 | 3.9 |
| 26/11/2016 | 3.6 |
| 26/11/2016 | 3.4 |
| 26/11/2016 | 3.1 |
| 26/11/2016 | 3 |
| 26/11/2016 | 2.8 |
| 27/11/2016 | 2.6 |
| 27/11/2016 | 2.5 |
| 27/11/2016 | 2.5 |
| 27/11/2016 | 2.5 |
| 27/11/2016 | 2.6 |
| 27/11/2016 | 2.5 |
| 27/11/2016 | 2.7 |
| 27/11/2016 | 2.9 |
| 27/11/2016 | 3.2 |
| 27/11/2016 | 3.5 |
| 27/11/2016 | 3.7 |
| 27/11/2016 | 3.7 |
| 27/11/2016 | 3.6 |
| 27/11/2016 | 3.7 |
| 27/11/2016 | 3.7 |
| 27/11/2016 | 3.7 |
| 27/11/2016 | 3.8 |
| 27/11/2016 | 3.9 |
| 27/11/2016 | 3.7 |
| 27/11/2016 | 3.6 |
| 27/11/2016 | 3.4 |
| 27/11/2016 | 3.2 |
| 27/11/2016 | 3.1 |
| 27/11/2016 | 2.8 |
| 28/11/2016 | 2.6 |
| 28/11/2016 | 2.5 |
| 28/11/2016 | 2.5 |
| 28/11/2016 | 2.6 |
| 28/11/2016 | 2.9 |
| 28/11/2016 | 3.4 |
| 28/11/2016 | 3.8 |
| 28/11/2016 | 4.1 |
| 28/11/2016 | 4.4 |
| 28/11/2016 | 4.6 |
| 28/11/2016 | 4.6 |
| 28/11/2016 | 4.7 |
| 28/11/2016 | 4.5 |
| 28/11/2016 | 4.5 |
| 28/11/2016 | 4.6 |
| 28/11/2016 | 4.7 |
| 28/11/2016 | 4.6 |
| 28/11/2016 | 4.7 |
| 28/11/2016 | 4.5 |
| 28/11/2016 | 4 |
| 28/11/2016 | 3.7 |
| 28/11/2016 | 3.3 |
| 28/11/2016 | 3 |
| 28/11/2016 | 2.8 |
| 29/11/2016 | 2.7 |
| 29/11/2016 | 2.6 |
| 29/11/2016 | 2.5 |
| 29/11/2016 | 2.6 |
| 29/11/2016 | 2.9 |
| 29/11/2016 | 3.4 |
| 29/11/2016 | 3.8 |
| 29/11/2016 | 4.1 |
| 29/11/2016 | 4.5 |
| 29/11/2016 | 4.5 |
| 29/11/2016 | 4.5 |
| 29/11/2016 | 4.5 |
| 29/11/2016 | 4.6 |
| 29/11/2016 | 4.5 |
| 29/11/2016 | 4.6 |
| 29/11/2016 | 4.7 |
| 29/11/2016 | 4.8 |
| 29/11/2016 | 4.6 |
| 29/11/2016 | 4.6 |
| 29/11/2016 | 4.1 |
| 29/11/2016 | 3.8 |
| 29/11/2016 | 3.4 |
| 29/11/2016 | 3 |
| 29/11/2016 | 2.9 |
| 30/11/2016 | 2.6 |
| 30/11/2016 | 2.7 |
| 30/11/2016 | 2.6 |
| 30/11/2016 | 2.7 |
| 30/11/2016 | 3 |
| 30/11/2016 | 3.4 |
| 30/11/2016 | 3.9 |
| 30/11/2016 | 4.2 |
| 30/11/2016 | 4.4 |
| 30/11/2016 | 4.6 |
| 30/11/2016 | 4.6 |
| 30/11/2016 | 4.7 |
| 30/11/2016 | 4.7 |
| 30/11/2016 | 4.7 |
| 30/11/2016 | 4.5 |
| 30/11/2016 | 4.7 |
| 30/11/2016 | 4.8 |
| 30/11/2016 | 4.6 |
| 30/11/2016 | 4.6 |
| 30/11/2016 | 4.1 |
| 30/11/2016 | 3.7 |
| 30/11/2016 | 3.4 |
| 30/11/2016 | 3.1 |
| 30/11/2016 | 2.9 |
| 01/12/2016 | 2.6 |
| 01/12/2016 | 2.6 |
| 01/12/2016 | 2.5 |
| 01/12/2016 | 2.7 |
| 01/12/2016 | 2.9 |
| 01/12/2016 | 3.4 |
| 01/12/2016 | 3.8 |
| 01/12/2016 | 4.1 |
| 01/12/2016 | 4.3 |
| 01/12/2016 | 4.5 |
| 01/12/2016 | 4.5 |
| 01/12/2016 | 4.6 |
| 01/12/2016 | 4.4 |
| 01/12/2016 | 4.3 |
| 01/12/2016 | 4.4 |
| 01/12/2016 | 4.5 |
| 01/12/2016 | 4.6 |
| 01/12/2016 | 4.5 |
| 01/12/2016 | 4.4 |
| 01/12/2016 | 4 |
| 01/12/2016 | 3.7 |
| 01/12/2016 | 3.3 |
| 01/12/2016 | 3.1 |
| 01/12/2016 | 2.7 |
| 02/12/2016 | 2.6 |
| 02/12/2016 | 2.6 |
| 02/12/2016 | 2.5 |
| 02/12/2016 | 2.6 |
| 02/12/2016 | 2.9 |
| 02/12/2016 | 3.2 |
| 02/12/2016 | 3.9 |
| 02/12/2016 | 4 |
| 02/12/2016 | 4.3 |
| 02/12/2016 | 4.5 |
| 02/12/2016 | 4.5 |
| 02/12/2016 | 4.5 |
| 02/12/2016 | 4.6 |
| 02/12/2016 | 4.4 |
| 02/12/2016 | 4.4 |
| 02/12/2016 | 4.5 |
| 02/12/2016 | 4.5 |
| 02/12/2016 | 4.5 |
| 02/12/2016 | 4.2 |
| 02/12/2016 | 3.8 |
| 02/12/2016 | 3.6 |
| 02/12/2016 | 3.2 |
| 02/12/2016 | 2.9 |
| 02/12/2016 | 2.8 |
| 03/12/2016 | 2.5 |
| 03/12/2016 | 2.6 |
| 03/12/2016 | 2.4 |
| 03/12/2016 | 2.6 |
| 03/12/2016 | 2.6 |
| 03/12/2016 | 2.7 |
| 03/12/2016 | 2.9 |
| 03/12/2016 | 3.2 |
| 03/12/2016 | 3.5 |
| 03/12/2016 | 3.7 |
| 03/12/2016 | 3.8 |
| 03/12/2016 | 3.8 |
| 03/12/2016 | 3.7 |
| 03/12/2016 | 3.7 |
| 03/12/2016 | 3.8 |
| 03/12/2016 | 3.7 |
| 03/12/2016 | 3.8 |
| 03/12/2016 | 4 |
| 03/12/2016 | 3.9 |
| 03/12/2016 | 3.6 |
| 03/12/2016 | 3.3 |
| 03/12/2016 | 3.1 |
| 03/12/2016 | 3 |
| 03/12/2016 | 2.8 |
| 04/12/2016 | 2.6 |
| 04/12/2016 | 2.5 |
| 04/12/2016 | 2.5 |
| 04/12/2016 | 2.5 |
| 04/12/2016 | 2.5 |
| 04/12/2016 | 2.4 |
| 04/12/2016 | 2.7 |
| 04/12/2016 | 2.8 |
| 04/12/2016 | 3.1 |
| 04/12/2016 | 3.4 |
| 04/12/2016 | 3.6 |
| 04/12/2016 | 3.6 |
| 04/12/2016 | 3.6 |
| 04/12/2016 | 3.6 |
| 04/12/2016 | 3.6 |
| 04/12/2016 | 3.6 |
| 04/12/2016 | 3.6 |
| 04/12/2016 | 3.8 |
| 04/12/2016 | 3.7 |
| 04/12/2016 | 3.5 |
| 04/12/2016 | 3.2 |
| 04/12/2016 | 3.2 |
| 04/12/2016 | 2.8 |
| 04/12/2016 | 2.6 |
| 05/12/2016 | 2.6 |
| 05/12/2016 | 2.5 |
| 05/12/2016 | 2.5 |
| 05/12/2016 | 2.6 |
| 05/12/2016 | 2.9 |
| 05/12/2016 | 3.3 |
| 05/12/2016 | 3.7 |
| 05/12/2016 | 4 |
| 05/12/2016 | 4.2 |
| 05/12/2016 | 4.4 |
| 05/12/2016 | 4.5 |
| 05/12/2016 | 4.6 |
| 05/12/2016 | 4.4 |
| 05/12/2016 | 4.4 |
| 05/12/2016 | 4.5 |
| 05/12/2016 | 4.6 |
| 05/12/2016 | 4.6 |
| 05/12/2016 | 4.6 |
| 05/12/2016 | 4.4 |
| 05/12/2016 | 3.9 |
| 05/12/2016 | 3.6 |
| 05/12/2016 | 3.3 |
| 05/12/2016 | 3 |
| 05/12/2016 | 2.8 |
| 06/12/2016 | 2.5 |
| 06/12/2016 | 2.6 |
| 06/12/2016 | 2.5 |
| 06/12/2016 | 2.6 |
| 06/12/2016 | 2.9 |
| 06/12/2016 | 3.3 |
| 06/12/2016 | 3.9 |
| 06/12/2016 | 4.2 |
| 06/12/2016 | 4.3 |
| 06/12/2016 | 4.4 |
| 06/12/2016 | 4.4 |
| 06/12/2016 | 4.4 |
| 06/12/2016 | 4.5 |
| 06/12/2016 | 4.5 |
| 06/12/2016 | 4.4 |
| 06/12/2016 | 4.6 |
| 06/12/2016 | 4.6 |
| 06/12/2016 | 4.7 |
| 06/12/2016 | 4.5 |
| 06/12/2016 | 4.1 |
| 06/12/2016 | 3.7 |
| 06/12/2016 | 3.3 |
| 06/12/2016 | 3 |
| 06/12/2016 | 2.9 |
| 07/12/2016 | 2.6 |
| 07/12/2016 | 2.7 |
| 07/12/2016 | 2.6 |
| 07/12/2016 | 2.7 |
| 07/12/2016 | 2.9 |
| 07/12/2016 | 3.3 |
| 07/12/2016 | 3.8 |
| 07/12/2016 | 4.1 |
| 07/12/2016 | 4.3 |
| 07/12/2016 | 4.5 |
| 07/12/2016 | 4.5 |
| 07/12/2016 | 4.6 |
| 07/12/2016 | 4.6 |
| 07/12/2016 | 4.4 |
| 07/12/2016 | 4.5 |
| 07/12/2016 | 4.6 |
| 07/12/2016 | 4.6 |
| 07/12/2016 | 4.5 |
| 07/12/2016 | 4.5 |
| 07/12/2016 | 4 |
| 07/12/2016 | 3.7 |
| 07/12/2016 | 3.4 |
| 07/12/2016 | 3.1 |
| 07/12/2016 | 2.7 |
| 08/12/2016 | 2.6 |
| 08/12/2016 | 2.7 |
| 08/12/2016 | 2.5 |
| 08/12/2016 | 2.6 |
| 08/12/2016 | 2.9 |
| 08/12/2016 | 3.3 |
| 08/12/2016 | 3.7 |
| 08/12/2016 | 4 |
| 08/12/2016 | 4.1 |
| 08/12/2016 | 4.3 |
| 08/12/2016 | 4.4 |
| 08/12/2016 | 4.4 |
| 08/12/2016 | 4.3 |
| 08/12/2016 | 4.3 |
| 08/12/2016 | 4.3 |
| 08/12/2016 | 4.4 |
| 08/12/2016 | 4.4 |
| 08/12/2016 | 4.3 |
| 08/12/2016 | 4.2 |
| 08/12/2016 | 3.9 |
| 08/12/2016 | 3.4 |
| 08/12/2016 | 3.3 |
| 08/12/2016 | 3 |
| 08/12/2016 | 2.7 |
| 09/12/2016 | 2.6 |
| 09/12/2016 | 2.6 |
| 09/12/2016 | 2.5 |
| 09/12/2016 | 2.6 |
| 09/12/2016 | 2.9 |
| 09/12/2016 | 3.2 |
| 09/12/2016 | 3.8 |
| 09/12/2016 | 4.1 |
| 09/12/2016 | 4.1 |
| 09/12/2016 | 4.3 |
| 09/12/2016 | 4.4 |
| 09/12/2016 | 4.4 |
| 09/12/2016 | 4.3 |
| 09/12/2016 | 4.4 |
| 09/12/2016 | 4.4 |
| 09/12/2016 | 4.4 |
| 09/12/2016 | 4.3 |
| 09/12/2016 | 4.4 |
| 09/12/2016 | 4.2 |
| 09/12/2016 | 3.7 |
| 09/12/2016 | 3.5 |
| 09/12/2016 | 3.2 |
| 09/12/2016 | 2.9 |
| 09/12/2016 | 2.8 |
| 10/12/2016 | 2.6 |
| 10/12/2016 | 2.6 |
| 10/12/2016 | 2.4 |
| 10/12/2016 | 2.5 |
| 10/12/2016 | 2.5 |
| 10/12/2016 | 2.7 |
| 10/12/2016 | 2.8 |
| 10/12/2016 | 3.1 |
| 10/12/2016 | 3.4 |
| 10/12/2016 | 3.6 |
| 10/12/2016 | 3.7 |
| 10/12/2016 | 3.7 |
| 10/12/2016 | 3.6 |
| 10/12/2016 | 3.7 |
| 10/12/2016 | 3.7 |
| 10/12/2016 | 3.6 |
| 10/12/2016 | 3.9 |
| 10/12/2016 | 3.9 |
| 10/12/2016 | 3.8 |
| 10/12/2016 | 3.5 |
| 10/12/2016 | 3.3 |
| 10/12/2016 | 3.1 |
| 10/12/2016 | 2.8 |
| 10/12/2016 | 2.6 |
| 11/12/2016 | 2.7 |
| 11/12/2016 | 2.5 |
| 11/12/2016 | 2.5 |
| 11/12/2016 | 2.5 |
| 11/12/2016 | 2.5 |
| 11/12/2016 | 2.6 |
| 11/12/2016 | 2.6 |
| 11/12/2016 | 2.8 |
| 11/12/2016 | 3 |
| 11/12/2016 | 3.3 |
| 11/12/2016 | 3.5 |
| 11/12/2016 | 3.5 |
| 11/12/2016 | 3.5 |
| 11/12/2016 | 3.4 |
| 11/12/2016 | 3.4 |
| 11/12/2016 | 3.5 |
| 11/12/2016 | 3.7 |
| 11/12/2016 | 3.6 |
| 11/12/2016 | 3.6 |
| 11/12/2016 | 3.4 |
| 11/12/2016 | 3.2 |
| 11/12/2016 | 3.2 |
| 11/12/2016 | 2.8 |
| 11/12/2016 | 2.7 |
| 12/12/2016 | 2.6 |
| 12/12/2016 | 2.5 |
| 12/12/2016 | 2.5 |
| 12/12/2016 | 2.6 |
| 12/12/2016 | 2.8 |
| 12/12/2016 | 3.2 |
| 12/12/2016 | 3.8 |
| 12/12/2016 | 4.1 |
| 12/12/2016 | 4.1 |
| 12/12/2016 | 4.3 |
| 12/12/2016 | 4.3 |
| 12/12/2016 | 4.4 |
| 12/12/2016 | 4.3 |
| 12/12/2016 | 4.4 |
| 12/12/2016 | 4.5 |
| 12/12/2016 | 4.5 |
| 12/12/2016 | 4.4 |
| 12/12/2016 | 4.4 |
| 12/12/2016 | 4.3 |
| 12/12/2016 | 3.8 |
| 12/12/2016 | 3.6 |
| 12/12/2016 | 3.3 |
| 12/12/2016 | 3 |
| 12/12/2016 | 2.8 |
| 13/12/2016 | 2.5 |
| 13/12/2016 | 2.6 |
| 13/12/2016 | 2.5 |
| 13/12/2016 | 2.6 |
| 13/12/2016 | 2.9 |
| 13/12/2016 | 3.2 |
| 13/12/2016 | 3.8 |
| 13/12/2016 | 4.1 |
| 13/12/2016 | 4.2 |
| 13/12/2016 | 4.2 |
| 13/12/2016 | 4.3 |
| 13/12/2016 | 4.3 |
| 13/12/2016 | 4.4 |
| 13/12/2016 | 4.2 |
| 13/12/2016 | 4.3 |
| 13/12/2016 | 4.6 |
| 13/12/2016 | 4.6 |
| 13/12/2016 | 4.6 |
| 13/12/2016 | 4.2 |
| 13/12/2016 | 4 |
| 13/12/2016 | 3.7 |
| 13/12/2016 | 3.3 |
| 13/12/2016 | 3 |
| 13/12/2016 | 2.7 |
| 14/12/2016 | 2.6 |
| 14/12/2016 | 2.7 |
| 14/12/2016 | 2.6 |
| 14/12/2016 | 2.7 |
| 14/12/2016 | 2.9 |
| 14/12/2016 | 3.2 |
| 14/12/2016 | 3.9 |
| 14/12/2016 | 4.1 |
| 14/12/2016 | 4.1 |
| 14/12/2016 | 4.3 |
| 14/12/2016 | 4.4 |
| 14/12/2016 | 4.5 |
| 14/12/2016 | 4.3 |
| 14/12/2016 | 4.3 |
| 14/12/2016 | 4.4 |
| 14/12/2016 | 4.4 |
| 14/12/2016 | 4.6 |
| 14/12/2016 | 4.4 |
| 14/12/2016 | 4.2 |
| 14/12/2016 | 4 |
| 14/12/2016 | 3.5 |
| 14/12/2016 | 3.4 |
| 14/12/2016 | 3.1 |
| 14/12/2016 | 2.7 |
| 15/12/2016 | 2.6 |
| 15/12/2016 | 2.7 |
| 15/12/2016 | 2.6 |
| 15/12/2016 | 2.6 |
| 15/12/2016 | 2.9 |
| 15/12/2016 | 3.2 |
| 15/12/2016 | 3.8 |
| 15/12/2016 | 4 |
| 15/12/2016 | 4 |
| 15/12/2016 | 4.2 |
| 15/12/2016 | 4.3 |
| 15/12/2016 | 4.3 |
| 15/12/2016 | 4.2 |
| 15/12/2016 | 4.2 |
| 15/12/2016 | 4.3 |
| 15/12/2016 | 4.3 |
| 15/12/2016 | 4.4 |
| 15/12/2016 | 4.2 |
| 15/12/2016 | 4.1 |
| 15/12/2016 | 3.8 |
| 15/12/2016 | 3.4 |
| 15/12/2016 | 3.1 |
| 15/12/2016 | 2.8 |
| 15/12/2016 | 2.7 |
| 16/12/2016 | 2.6 |
| 16/12/2016 | 2.5 |
| 16/12/2016 | 2.5 |
| 16/12/2016 | 2.6 |
| 16/12/2016 | 2.8 |
| 16/12/2016 | 3.3 |
| 16/12/2016 | 3.6 |
| 16/12/2016 | 4 |
| 16/12/2016 | 4.2 |
| 16/12/2016 | 4.2 |
| 16/12/2016 | 4.2 |
| 16/12/2016 | 4.3 |
| 16/12/2016 | 4.2 |
| 16/12/2016 | 4.1 |
| 16/12/2016 | 4.1 |
| 16/12/2016 | 4.3 |
| 16/12/2016 | 4.4 |
| 16/12/2016 | 4.3 |
| 16/12/2016 | 4.1 |
| 16/12/2016 | 3.7 |
| 16/12/2016 | 3.3 |
| 16/12/2016 | 3.2 |
| 16/12/2016 | 2.9 |
| 16/12/2016 | 2.8 |
| 17/12/2016 | 2.6 |
| 17/12/2016 | 2.6 |
| 17/12/2016 | 2.4 |
| 17/12/2016 | 2.5 |
| 17/12/2016 | 2.5 |
| 17/12/2016 | 2.6 |
| 17/12/2016 | 2.7 |
| 17/12/2016 | 3 |
| 17/12/2016 | 3.3 |
| 17/12/2016 | 3.4 |
| 17/12/2016 | 3.6 |
| 17/12/2016 | 3.6 |
| 17/12/2016 | 3.5 |
| 17/12/2016 | 3.6 |
| 17/12/2016 | 3.5 |
| 17/12/2016 | 3.5 |
| 17/12/2016 | 3.7 |
| 17/12/2016 | 3.8 |
| 17/12/2016 | 3.8 |
| 17/12/2016 | 3.4 |
| 17/12/2016 | 3.3 |
| 17/12/2016 | 3 |
| 17/12/2016 | 2.8 |
| 17/12/2016 | 2.6 |
| 18/12/2016 | 2.7 |
| 18/12/2016 | 2.5 |
| 18/12/2016 | 2.5 |
| 18/12/2016 | 2.5 |
| 18/12/2016 | 2.5 |
| 18/12/2016 | 2.5 |
| 18/12/2016 | 2.5 |
| 18/12/2016 | 2.9 |
| 18/12/2016 | 2.9 |
| 18/12/2016 | 3.2 |
| 18/12/2016 | 3.4 |
| 18/12/2016 | 3.4 |
| 18/12/2016 | 3.4 |
| 18/12/2016 | 3.3 |
| 18/12/2016 | 3.4 |
| 18/12/2016 | 3.4 |
| 18/12/2016 | 3.5 |
| 18/12/2016 | 3.5 |
| 18/12/2016 | 3.6 |
| 18/12/2016 | 3.4 |
| 18/12/2016 | 3.1 |
| 18/12/2016 | 3.1 |
| 18/12/2016 | 2.8 |
| 18/12/2016 | 2.7 |
| 19/12/2016 | 2.7 |
| 19/12/2016 | 2.5 |
| 19/12/2016 | 2.5 |
| 19/12/2016 | 2.6 |
| 19/12/2016 | 2.8 |
| 19/12/2016 | 3.1 |
| 19/12/2016 | 3.7 |
| 19/12/2016 | 4 |
| 19/12/2016 | 4.1 |
| 19/12/2016 | 4.1 |
| 19/12/2016 | 4.2 |
| 19/12/2016 | 4.1 |
| 19/12/2016 | 4.2 |
| 19/12/2016 | 4.3 |
| 19/12/2016 | 4.2 |
| 19/12/2016 | 4.3 |
| 19/12/2016 | 4.5 |
| 19/12/2016 | 4.3 |
| 19/12/2016 | 4.2 |
| 19/12/2016 | 3.8 |
| 19/12/2016 | 3.6 |
| 19/12/2016 | 3.2 |
| 19/12/2016 | 3 |
| 19/12/2016 | 2.7 |
| 20/12/2016 | 2.6 |
| 20/12/2016 | 2.6 |
| 20/12/2016 | 2.5 |
| 20/12/2016 | 2.6 |
| 20/12/2016 | 2.8 |
| 20/12/2016 | 3.3 |
| 20/12/2016 | 3.6 |
| 20/12/2016 | 3.9 |
| 20/12/2016 | 4 |
| 20/12/2016 | 4.1 |
| 20/12/2016 | 4.1 |
| 20/12/2016 | 4.2 |
| 20/12/2016 | 4.1 |
| 20/12/2016 | 4.1 |
| 20/12/2016 | 4.3 |
| 20/12/2016 | 4.5 |
| 20/12/2016 | 4.4 |
| 20/12/2016 | 4.5 |
| 20/12/2016 | 4.2 |
| 20/12/2016 | 3.9 |
| 20/12/2016 | 3.5 |
| 20/12/2016 | 3.3 |
| 20/12/2016 | 3 |
| 20/12/2016 | 2.7 |
| 21/12/2016 | 2.6 |
| 21/12/2016 | 2.7 |
| 21/12/2016 | 2.6 |
| 21/12/2016 | 2.6 |
| 21/12/2016 | 2.9 |
| 21/12/2016 | 3.4 |
| 21/12/2016 | 3.7 |
| 21/12/2016 | 4 |
| 21/12/2016 | 4.2 |
| 21/12/2016 | 4.2 |
| 21/12/2016 | 4.2 |
| 21/12/2016 | 4.4 |
| 21/12/2016 | 4.2 |
| 21/12/2016 | 4.3 |
| 21/12/2016 | 4.4 |
| 21/12/2016 | 4.5 |
| 21/12/2016 | 4.4 |
| 21/12/2016 | 4.2 |
| 21/12/2016 | 4.2 |
| 21/12/2016 | 3.9 |
| 21/12/2016 | 3.4 |
| 21/12/2016 | 3.1 |
| 21/12/2016 | 2.8 |
| 21/12/2016 | 2.7 |
| 22/12/2016 | 2.6 |
| 22/12/2016 | 2.5 |
| 22/12/2016 | 2.6 |
| 22/12/2016 | 2.6 |
| 22/12/2016 | 2.8 |
| 22/12/2016 | 3.3 |
| 22/12/2016 | 3.7 |
| 22/12/2016 | 3.9 |
| 22/12/2016 | 3.8 |
| 22/12/2016 | 4.1 |
| 22/12/2016 | 4.1 |
| 22/12/2016 | 4 |
| 22/12/2016 | 4.1 |
| 22/12/2016 | 4.1 |
| 22/12/2016 | 4 |
| 22/12/2016 | 4.1 |
| 22/12/2016 | 4.2 |
| 22/12/2016 | 4.1 |
| 22/12/2016 | 4 |
| 22/12/2016 | 3.8 |
| 22/12/2016 | 3.4 |
| 22/12/2016 | 3.1 |
| 22/12/2016 | 2.8 |
| 22/12/2016 | 2.7 |
| 23/12/2016 | 2.6 |
| 23/12/2016 | 2.6 |
| 23/12/2016 | 2.5 |
| 23/12/2016 | 2.6 |
| 23/12/2016 | 2.7 |
| 23/12/2016 | 2.9 |
| 23/12/2016 | 3.3 |
| 23/12/2016 | 3.7 |
| 23/12/2016 | 3.9 |
| 23/12/2016 | 4 |
| 23/12/2016 | 4.1 |
| 23/12/2016 | 4.1 |
| 23/12/2016 | 4 |
| 23/12/2016 | 3.9 |
| 23/12/2016 | 3.9 |
| 23/12/2016 | 4 |
| 23/12/2016 | 4.2 |
| 23/12/2016 | 4.2 |
| 23/12/2016 | 3.8 |
| 23/12/2016 | 3.4 |
| 23/12/2016 | 3.2 |
| 23/12/2016 | 3 |
| 23/12/2016 | 2.8 |
| 23/12/2016 | 2.4 |
| 24/12/2016 | 2.4 |
| 24/12/2016 | 2.4 |
| 24/12/2016 | 2.2 |
| 24/12/2016 | 2.3 |
| 24/12/2016 | 2.3 |
| 24/12/2016 | 2.6 |
| 24/12/2016 | 2.9 |
| 24/12/2016 | 3.1 |
| 24/12/2016 | 3.6 |
| 24/12/2016 | 3.8 |
| 24/12/2016 | 3.9 |
| 24/12/2016 | 3.8 |
| 24/12/2016 | 3.7 |
| 24/12/2016 | 3.8 |
| 24/12/2016 | 3.6 |
| 24/12/2016 | 3.4 |
| 24/12/2016 | 3.2 |
| 24/12/2016 | 3.3 |
| 24/12/2016 | 3.2 |
| 24/12/2016 | 3 |
| 24/12/2016 | 2.8 |
| 24/12/2016 | 2.9 |
| 24/12/2016 | 2.7 |
| 24/12/2016 | 2.7 |
| 25/12/2016 | 2.6 |
| 25/12/2016 | 2.5 |
| 25/12/2016 | 2.4 |
| 25/12/2016 | 2.4 |
| 25/12/2016 | 2.4 |
| 25/12/2016 | 2.4 |
| 25/12/2016 | 2.7 |
| 25/12/2016 | 2.9 |
| 25/12/2016 | 2.9 |
| 25/12/2016 | 3.1 |
| 25/12/2016 | 3.4 |
| 25/12/2016 | 3.3 |
| 25/12/2016 | 3.1 |
| 25/12/2016 | 3.1 |
| 25/12/2016 | 2.9 |
| 25/12/2016 | 3.2 |
| 25/12/2016 | 3.3 |
| 25/12/2016 | 3.4 |
| 25/12/2016 | 3.3 |
| 25/12/2016 | 3.2 |
| 25/12/2016 | 3.1 |
| 25/12/2016 | 3.1 |
| 25/12/2016 | 3.1 |
| 25/12/2016 | 2.7 |
| 26/12/2016 | 2.6 |
| 26/12/2016 | 2.5 |
| 26/12/2016 | 2.4 |
| 26/12/2016 | 2.4 |
| 26/12/2016 | 2.4 |
| 26/12/2016 | 2.4 |
| 26/12/2016 | 2.7 |
| 26/12/2016 | 2.9 |
| 26/12/2016 | 2.9 |
| 26/12/2016 | 3.1 |
| 26/12/2016 | 3.4 |
| 26/12/2016 | 3.3 |
| 26/12/2016 | 3.1 |
| 26/12/2016 | 3.1 |
| 26/12/2016 | 2.9 |
| 26/12/2016 | 3.2 |
| 26/12/2016 | 3.3 |
| 26/12/2016 | 3.4 |
| 26/12/2016 | 3.3 |
| 26/12/2016 | 3.2 |
| 26/12/2016 | 3.1 |
| 26/12/2016 | 3.1 |
| 26/12/2016 | 3.1 |
| 26/12/2016 | 2.9 |
| 27/12/2016 | 2.8 |
| 27/12/2016 | 2.6 |
| 27/12/2016 | 2.5 |
| 27/12/2016 | 2.6 |
| 27/12/2016 | 2.7 |
| 27/12/2016 | 3 |
| 27/12/2016 | 3 |
| 27/12/2016 | 3.3 |
| 27/12/2016 | 3.4 |
| 27/12/2016 | 3.6 |
| 27/12/2016 | 3.7 |
| 27/12/2016 | 3.8 |
| 27/12/2016 | 3.8 |
| 27/12/2016 | 3.7 |
| 27/12/2016 | 3.7 |
| 27/12/2016 | 4 |
| 27/12/2016 | 4.2 |
| 27/12/2016 | 4.1 |
| 27/12/2016 | 4 |
| 27/12/2016 | 3.9 |
| 27/12/2016 | 3.6 |
| 27/12/2016 | 3.4 |
| 27/12/2016 | 3.1 |
| 27/12/2016 | 2.9 |
| 28/12/2016 | 2.8 |
| 28/12/2016 | 2.6 |
| 28/12/2016 | 2.5 |
| 28/12/2016 | 2.6 |
| 28/12/2016 | 2.7 |
| 28/12/2016 | 2.9 |
| 28/12/2016 | 3 |
| 28/12/2016 | 3.3 |
| 28/12/2016 | 3.4 |
| 28/12/2016 | 3.6 |
| 28/12/2016 | 3.7 |
| 28/12/2016 | 3.8 |
| 28/12/2016 | 3.8 |
| 28/12/2016 | 3.7 |
| 28/12/2016 | 3.7 |
| 28/12/2016 | 3.9 |
| 28/12/2016 | 4.2 |
| 28/12/2016 | 4 |
| 28/12/2016 | 4 |
| 28/12/2016 | 3.9 |
| 28/12/2016 | 3.6 |
| 28/12/2016 | 3.4 |
| 28/12/2016 | 3.1 |
| 28/12/2016 | 2.9 |
| 29/12/2016 | 2.8 |
| 29/12/2016 | 2.6 |
| 29/12/2016 | 2.5 |
| 29/12/2016 | 2.6 |
| 29/12/2016 | 2.7 |
| 29/12/2016 | 2.9 |
| 29/12/2016 | 3 |
| 29/12/2016 | 3.3 |
| 29/12/2016 | 3.4 |
| 29/12/2016 | 3.6 |
| 29/12/2016 | 3.7 |
| 29/12/2016 | 3.8 |
| 29/12/2016 | 3.8 |
| 29/12/2016 | 3.7 |
| 29/12/2016 | 3.7 |
| 29/12/2016 | 3.9 |
| 29/12/2016 | 4.2 |
| 29/12/2016 | 4 |
| 29/12/2016 | 4 |
| 29/12/2016 | 3.9 |
| 29/12/2016 | 3.4 |
| 29/12/2016 | 3.4 |
| 29/12/2016 | 3.1 |
| 29/12/2016 | 2.9 |
| 30/12/2016 | 2.8 |
| 30/12/2016 | 2.6 |
| 30/12/2016 | 2.5 |
| 30/12/2016 | 2.6 |
| 30/12/2016 | 2.7 |
| 30/12/2016 | 2.9 |
| 30/12/2016 | 3 |
| 30/12/2016 | 3.3 |
| 30/12/2016 | 3.4 |
| 30/12/2016 | 3.5 |
| 30/12/2016 | 3.7 |
| 30/12/2016 | 3.8 |
| 30/12/2016 | 3.8 |
| 30/12/2016 | 3.7 |
| 30/12/2016 | 3.7 |
| 30/12/2016 | 3.9 |
| 30/12/2016 | 4.2 |
| 30/12/2016 | 4 |
| 30/12/2016 | 4 |
| 30/12/2016 | 3.9 |
| 30/12/2016 | 3.4 |
| 30/12/2016 | 3.4 |
| 30/12/2016 | 3.1 |
| 30/12/2016 | 3.2 |
| 31/12/2016 | 3 |
| 31/12/2016 | 2.9 |
| 31/12/2016 | 2.6 |
| 31/12/2016 | 2.8 |
| 31/12/2016 | 2.8 |
| 31/12/2016 | 2.8 |
| 31/12/2016 | 3.1 |
| 31/12/2016 | 3.6 |
| 31/12/2016 | 3.9 |
| 31/12/2016 | 4.1 |
| 31/12/2016 | 4.4 |
| 31/12/2016 | 4.4 |
| 31/12/2016 | 4.5 |
| 31/12/2016 | 4.3 |
| 31/12/2016 | 4.5 |
| 31/12/2016 | 4.3 |
| 31/12/2016 | 4.1 |
| 31/12/2016 | 3.9 |
| 31/12/2016 | 3.7 |
| 31/12/2016 | 3.3 |
| 31/12/2016 | 3.3 |
| 31/12/2016 | 3 |
| 31/12/2016 | 3 |